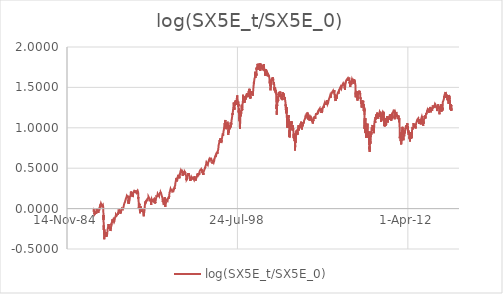
| Category | log(SX5E_t/SX5E_0) |
|---|---|
| 31777.0 | 0 |
| 31778.0 | 0 |
| 31779.0 | -0.01 |
| 31782.0 | -0.003 |
| 31783.0 | 0.002 |
| 31784.0 | -0.002 |
| 31785.0 | -0.015 |
| 31786.0 | -0.037 |
| 31789.0 | -0.024 |
| 31790.0 | -0.032 |
| 31791.0 | -0.027 |
| 31792.0 | -0.018 |
| 31793.0 | -0.019 |
| 31796.0 | -0.028 |
| 31797.0 | -0.029 |
| 31798.0 | -0.032 |
| 31799.0 | -0.027 |
| 31800.0 | -0.019 |
| 31803.0 | -0.034 |
| 31804.0 | -0.037 |
| 31805.0 | -0.072 |
| 31806.0 | -0.061 |
| 31807.0 | -0.047 |
| 31810.0 | -0.059 |
| 31811.0 | -0.07 |
| 31812.0 | -0.072 |
| 31813.0 | -0.078 |
| 31814.0 | -0.067 |
| 31817.0 | -0.064 |
| 31818.0 | -0.072 |
| 31819.0 | -0.073 |
| 31820.0 | -0.069 |
| 31821.0 | -0.068 |
| 31824.0 | -0.065 |
| 31825.0 | -0.077 |
| 31826.0 | -0.077 |
| 31827.0 | -0.065 |
| 31828.0 | -0.064 |
| 31831.0 | -0.071 |
| 31832.0 | -0.072 |
| 31833.0 | -0.078 |
| 31834.0 | -0.072 |
| 31835.0 | -0.069 |
| 31838.0 | -0.067 |
| 31839.0 | -0.074 |
| 31840.0 | -0.06 |
| 31841.0 | -0.052 |
| 31842.0 | -0.052 |
| 31845.0 | -0.05 |
| 31846.0 | -0.057 |
| 31847.0 | -0.064 |
| 31848.0 | -0.056 |
| 31849.0 | -0.052 |
| 31852.0 | -0.052 |
| 31853.0 | -0.06 |
| 31854.0 | -0.053 |
| 31855.0 | -0.067 |
| 31856.0 | -0.06 |
| 31859.0 | -0.046 |
| 31860.0 | -0.039 |
| 31861.0 | -0.037 |
| 31862.0 | -0.029 |
| 31863.0 | -0.02 |
| 31866.0 | -0.026 |
| 31867.0 | -0.035 |
| 31868.0 | -0.019 |
| 31869.0 | -0.014 |
| 31870.0 | -0.013 |
| 31873.0 | 0 |
| 31874.0 | -0.005 |
| 31875.0 | -0.006 |
| 31876.0 | -0.006 |
| 31877.0 | -0.018 |
| 31880.0 | -0.029 |
| 31881.0 | -0.022 |
| 31882.0 | -0.014 |
| 31883.0 | -0.006 |
| 31884.0 | -0.005 |
| 31887.0 | -0.008 |
| 31888.0 | -0.013 |
| 31889.0 | 0 |
| 31890.0 | -0.005 |
| 31891.0 | -0.011 |
| 31894.0 | -0.033 |
| 31895.0 | -0.024 |
| 31896.0 | -0.018 |
| 31897.0 | -0.022 |
| 31898.0 | -0.02 |
| 31901.0 | -0.023 |
| 31902.0 | -0.029 |
| 31903.0 | -0.022 |
| 31904.0 | -0.02 |
| 31905.0 | -0.02 |
| 31908.0 | -0.015 |
| 31909.0 | -0.024 |
| 31910.0 | -0.02 |
| 31911.0 | -0.02 |
| 31912.0 | -0.039 |
| 31915.0 | -0.036 |
| 31916.0 | -0.04 |
| 31917.0 | -0.051 |
| 31918.0 | -0.053 |
| 31919.0 | -0.049 |
| 31922.0 | -0.05 |
| 31923.0 | -0.041 |
| 31924.0 | -0.035 |
| 31925.0 | -0.036 |
| 31926.0 | -0.039 |
| 31929.0 | -0.032 |
| 31930.0 | -0.043 |
| 31931.0 | -0.041 |
| 31932.0 | -0.035 |
| 31933.0 | -0.041 |
| 31936.0 | -0.039 |
| 31937.0 | -0.043 |
| 31938.0 | -0.045 |
| 31939.0 | -0.037 |
| 31940.0 | -0.036 |
| 31943.0 | -0.024 |
| 31944.0 | -0.017 |
| 31945.0 | -0.017 |
| 31946.0 | -0.018 |
| 31947.0 | -0.004 |
| 31950.0 | 0.009 |
| 31951.0 | 0.016 |
| 31952.0 | 0.001 |
| 31953.0 | 0.003 |
| 31954.0 | 0.01 |
| 31957.0 | 0.01 |
| 31958.0 | 0.005 |
| 31959.0 | -0.007 |
| 31960.0 | 0.004 |
| 31961.0 | 0.019 |
| 31964.0 | 0.019 |
| 31965.0 | 0.018 |
| 31966.0 | 0.025 |
| 31967.0 | 0.022 |
| 31968.0 | 0.023 |
| 31971.0 | 0.023 |
| 31972.0 | 0.027 |
| 31973.0 | 0.031 |
| 31974.0 | 0.034 |
| 31975.0 | 0.044 |
| 31978.0 | 0.048 |
| 31979.0 | 0.044 |
| 31980.0 | 0.04 |
| 31981.0 | 0.034 |
| 31982.0 | 0.035 |
| 31985.0 | 0.039 |
| 31986.0 | 0.045 |
| 31987.0 | 0.053 |
| 31988.0 | 0.061 |
| 31989.0 | 0.059 |
| 31992.0 | 0.063 |
| 31993.0 | 0.061 |
| 31994.0 | 0.059 |
| 31995.0 | 0.065 |
| 31996.0 | 0.067 |
| 31999.0 | 0.066 |
| 32000.0 | 0.056 |
| 32001.0 | 0.066 |
| 32002.0 | 0.063 |
| 32003.0 | 0.065 |
| 32006.0 | 0.063 |
| 32007.0 | 0.052 |
| 32008.0 | 0.043 |
| 32009.0 | 0.052 |
| 32010.0 | 0.053 |
| 32013.0 | 0.045 |
| 32014.0 | 0.045 |
| 32015.0 | 0.045 |
| 32016.0 | 0.046 |
| 32017.0 | 0.051 |
| 32020.0 | 0.054 |
| 32021.0 | 0.057 |
| 32022.0 | 0.05 |
| 32023.0 | 0.042 |
| 32024.0 | 0.032 |
| 32027.0 | 0.021 |
| 32028.0 | 0.02 |
| 32029.0 | 0.021 |
| 32030.0 | 0.03 |
| 32031.0 | 0.036 |
| 32034.0 | 0.043 |
| 32035.0 | 0.039 |
| 32036.0 | 0.033 |
| 32037.0 | 0.036 |
| 32038.0 | 0.03 |
| 32041.0 | 0.029 |
| 32042.0 | 0.024 |
| 32043.0 | 0.04 |
| 32044.0 | 0.033 |
| 32045.0 | 0.03 |
| 32048.0 | 0.036 |
| 32049.0 | 0.039 |
| 32050.0 | 0.033 |
| 32051.0 | 0.041 |
| 32052.0 | 0.047 |
| 32055.0 | 0.053 |
| 32056.0 | 0.048 |
| 32057.0 | 0.038 |
| 32058.0 | 0.043 |
| 32059.0 | 0.028 |
| 32062.0 | 0.021 |
| 32063.0 | 0.023 |
| 32064.0 | 0.018 |
| 32065.0 | 0.001 |
| 32066.0 | -0.007 |
| 32069.0 | -0.09 |
| 32070.0 | -0.14 |
| 32071.0 | -0.08 |
| 32072.0 | -0.119 |
| 32073.0 | -0.133 |
| 32076.0 | -0.204 |
| 32077.0 | -0.195 |
| 32078.0 | -0.25 |
| 32079.0 | -0.265 |
| 32080.0 | -0.209 |
| 32083.0 | -0.217 |
| 32084.0 | -0.234 |
| 32085.0 | -0.267 |
| 32086.0 | -0.278 |
| 32087.0 | -0.277 |
| 32090.0 | -0.32 |
| 32091.0 | -0.38 |
| 32092.0 | -0.354 |
| 32093.0 | -0.287 |
| 32094.0 | -0.289 |
| 32097.0 | -0.259 |
| 32098.0 | -0.284 |
| 32099.0 | -0.287 |
| 32100.0 | -0.297 |
| 32101.0 | -0.321 |
| 32104.0 | -0.314 |
| 32105.0 | -0.287 |
| 32106.0 | -0.288 |
| 32107.0 | -0.294 |
| 32108.0 | -0.288 |
| 32111.0 | -0.314 |
| 32112.0 | -0.319 |
| 32113.0 | -0.319 |
| 32114.0 | -0.325 |
| 32115.0 | -0.348 |
| 32118.0 | -0.351 |
| 32119.0 | -0.345 |
| 32120.0 | -0.341 |
| 32121.0 | -0.34 |
| 32122.0 | -0.348 |
| 32125.0 | -0.342 |
| 32126.0 | -0.328 |
| 32127.0 | -0.309 |
| 32128.0 | -0.306 |
| 32129.0 | -0.313 |
| 32132.0 | -0.303 |
| 32133.0 | -0.3 |
| 32134.0 | -0.292 |
| 32135.0 | -0.294 |
| 32136.0 | -0.294 |
| 32139.0 | -0.306 |
| 32140.0 | -0.323 |
| 32141.0 | -0.317 |
| 32142.0 | -0.329 |
| 32143.0 | -0.329 |
| 32146.0 | -0.352 |
| 32147.0 | -0.313 |
| 32148.0 | -0.303 |
| 32149.0 | -0.297 |
| 32150.0 | -0.289 |
| 32153.0 | -0.326 |
| 32154.0 | -0.328 |
| 32155.0 | -0.343 |
| 32156.0 | -0.338 |
| 32157.0 | -0.333 |
| 32160.0 | -0.308 |
| 32161.0 | -0.328 |
| 32162.0 | -0.344 |
| 32163.0 | -0.352 |
| 32164.0 | -0.348 |
| 32167.0 | -0.348 |
| 32168.0 | -0.342 |
| 32169.0 | -0.346 |
| 32170.0 | -0.352 |
| 32171.0 | -0.348 |
| 32174.0 | -0.343 |
| 32175.0 | -0.343 |
| 32176.0 | -0.334 |
| 32177.0 | -0.321 |
| 32178.0 | -0.318 |
| 32181.0 | -0.31 |
| 32182.0 | -0.323 |
| 32183.0 | -0.314 |
| 32184.0 | -0.292 |
| 32185.0 | -0.283 |
| 32188.0 | -0.271 |
| 32189.0 | -0.269 |
| 32190.0 | -0.257 |
| 32191.0 | -0.257 |
| 32192.0 | -0.258 |
| 32195.0 | -0.249 |
| 32196.0 | -0.246 |
| 32197.0 | -0.242 |
| 32198.0 | -0.235 |
| 32199.0 | -0.245 |
| 32202.0 | -0.24 |
| 32203.0 | -0.23 |
| 32204.0 | -0.227 |
| 32205.0 | -0.229 |
| 32206.0 | -0.237 |
| 32209.0 | -0.251 |
| 32210.0 | -0.238 |
| 32211.0 | -0.233 |
| 32212.0 | -0.225 |
| 32213.0 | -0.233 |
| 32216.0 | -0.232 |
| 32217.0 | -0.231 |
| 32218.0 | -0.222 |
| 32219.0 | -0.242 |
| 32220.0 | -0.192 |
| 32223.0 | -0.196 |
| 32224.0 | -0.21 |
| 32225.0 | -0.208 |
| 32226.0 | -0.212 |
| 32227.0 | -0.224 |
| 32230.0 | -0.252 |
| 32231.0 | -0.243 |
| 32232.0 | -0.243 |
| 32233.0 | -0.25 |
| 32234.0 | -0.25 |
| 32237.0 | -0.253 |
| 32238.0 | -0.257 |
| 32239.0 | -0.242 |
| 32240.0 | -0.234 |
| 32241.0 | -0.235 |
| 32244.0 | -0.22 |
| 32245.0 | -0.213 |
| 32246.0 | -0.209 |
| 32247.0 | -0.216 |
| 32248.0 | -0.235 |
| 32251.0 | -0.236 |
| 32252.0 | -0.229 |
| 32253.0 | -0.235 |
| 32254.0 | -0.241 |
| 32255.0 | -0.236 |
| 32258.0 | -0.232 |
| 32259.0 | -0.229 |
| 32260.0 | -0.231 |
| 32261.0 | -0.228 |
| 32262.0 | -0.237 |
| 32265.0 | -0.238 |
| 32266.0 | -0.244 |
| 32267.0 | -0.237 |
| 32268.0 | -0.24 |
| 32269.0 | -0.242 |
| 32272.0 | -0.26 |
| 32273.0 | -0.264 |
| 32274.0 | -0.277 |
| 32275.0 | -0.281 |
| 32276.0 | -0.283 |
| 32279.0 | -0.262 |
| 32280.0 | -0.253 |
| 32281.0 | -0.256 |
| 32282.0 | -0.272 |
| 32283.0 | -0.265 |
| 32286.0 | -0.269 |
| 32287.0 | -0.267 |
| 32288.0 | -0.254 |
| 32289.0 | -0.256 |
| 32290.0 | -0.258 |
| 32293.0 | -0.249 |
| 32294.0 | -0.236 |
| 32295.0 | -0.218 |
| 32296.0 | -0.193 |
| 32297.0 | -0.207 |
| 32300.0 | -0.201 |
| 32301.0 | -0.206 |
| 32302.0 | -0.201 |
| 32303.0 | -0.184 |
| 32304.0 | -0.184 |
| 32307.0 | -0.188 |
| 32308.0 | -0.183 |
| 32309.0 | -0.18 |
| 32310.0 | -0.19 |
| 32311.0 | -0.187 |
| 32314.0 | -0.189 |
| 32315.0 | -0.186 |
| 32316.0 | -0.178 |
| 32317.0 | -0.171 |
| 32318.0 | -0.165 |
| 32321.0 | -0.166 |
| 32322.0 | -0.174 |
| 32323.0 | -0.169 |
| 32324.0 | -0.169 |
| 32325.0 | -0.157 |
| 32328.0 | -0.155 |
| 32329.0 | -0.15 |
| 32330.0 | -0.134 |
| 32331.0 | -0.14 |
| 32332.0 | -0.14 |
| 32335.0 | -0.143 |
| 32336.0 | -0.154 |
| 32337.0 | -0.161 |
| 32338.0 | -0.156 |
| 32339.0 | -0.151 |
| 32342.0 | -0.154 |
| 32343.0 | -0.16 |
| 32344.0 | -0.155 |
| 32345.0 | -0.154 |
| 32346.0 | -0.162 |
| 32349.0 | -0.163 |
| 32350.0 | -0.154 |
| 32351.0 | -0.15 |
| 32352.0 | -0.155 |
| 32353.0 | -0.144 |
| 32356.0 | -0.136 |
| 32357.0 | -0.135 |
| 32358.0 | -0.137 |
| 32359.0 | -0.138 |
| 32360.0 | -0.13 |
| 32363.0 | -0.136 |
| 32364.0 | -0.133 |
| 32365.0 | -0.151 |
| 32366.0 | -0.162 |
| 32367.0 | -0.153 |
| 32370.0 | -0.157 |
| 32371.0 | -0.161 |
| 32372.0 | -0.15 |
| 32373.0 | -0.147 |
| 32374.0 | -0.151 |
| 32377.0 | -0.152 |
| 32378.0 | -0.161 |
| 32379.0 | -0.157 |
| 32380.0 | -0.167 |
| 32381.0 | -0.169 |
| 32384.0 | -0.173 |
| 32385.0 | -0.17 |
| 32386.0 | -0.168 |
| 32387.0 | -0.173 |
| 32388.0 | -0.176 |
| 32391.0 | -0.166 |
| 32392.0 | -0.164 |
| 32393.0 | -0.16 |
| 32394.0 | -0.152 |
| 32395.0 | -0.159 |
| 32398.0 | -0.149 |
| 32399.0 | -0.144 |
| 32400.0 | -0.132 |
| 32401.0 | -0.126 |
| 32402.0 | -0.126 |
| 32405.0 | -0.121 |
| 32406.0 | -0.121 |
| 32407.0 | -0.114 |
| 32408.0 | -0.112 |
| 32409.0 | -0.116 |
| 32412.0 | -0.111 |
| 32413.0 | -0.115 |
| 32414.0 | -0.117 |
| 32415.0 | -0.109 |
| 32416.0 | -0.107 |
| 32419.0 | -0.107 |
| 32420.0 | -0.104 |
| 32421.0 | -0.101 |
| 32422.0 | -0.098 |
| 32423.0 | -0.096 |
| 32426.0 | -0.089 |
| 32427.0 | -0.097 |
| 32428.0 | -0.103 |
| 32429.0 | -0.094 |
| 32430.0 | -0.09 |
| 32433.0 | -0.087 |
| 32434.0 | -0.078 |
| 32435.0 | -0.073 |
| 32436.0 | -0.079 |
| 32437.0 | -0.079 |
| 32440.0 | -0.08 |
| 32441.0 | -0.079 |
| 32442.0 | -0.062 |
| 32443.0 | -0.074 |
| 32444.0 | -0.068 |
| 32447.0 | -0.072 |
| 32448.0 | -0.067 |
| 32449.0 | -0.072 |
| 32450.0 | -0.073 |
| 32451.0 | -0.072 |
| 32454.0 | -0.081 |
| 32455.0 | -0.074 |
| 32456.0 | -0.078 |
| 32457.0 | -0.081 |
| 32458.0 | -0.086 |
| 32461.0 | -0.092 |
| 32462.0 | -0.094 |
| 32463.0 | -0.091 |
| 32464.0 | -0.095 |
| 32465.0 | -0.088 |
| 32468.0 | -0.091 |
| 32469.0 | -0.091 |
| 32470.0 | -0.084 |
| 32471.0 | -0.082 |
| 32472.0 | -0.085 |
| 32475.0 | -0.091 |
| 32476.0 | -0.09 |
| 32477.0 | -0.084 |
| 32478.0 | -0.084 |
| 32479.0 | -0.087 |
| 32482.0 | -0.09 |
| 32483.0 | -0.085 |
| 32484.0 | -0.077 |
| 32485.0 | -0.078 |
| 32486.0 | -0.066 |
| 32489.0 | -0.075 |
| 32490.0 | -0.075 |
| 32491.0 | -0.078 |
| 32492.0 | -0.079 |
| 32493.0 | -0.071 |
| 32496.0 | -0.062 |
| 32497.0 | -0.053 |
| 32498.0 | -0.054 |
| 32499.0 | -0.066 |
| 32500.0 | -0.05 |
| 32503.0 | -0.051 |
| 32504.0 | -0.045 |
| 32505.0 | -0.047 |
| 32506.0 | -0.045 |
| 32507.0 | -0.045 |
| 32510.0 | -0.039 |
| 32511.0 | -0.032 |
| 32512.0 | -0.028 |
| 32513.0 | -0.02 |
| 32514.0 | -0.019 |
| 32517.0 | -0.017 |
| 32518.0 | -0.022 |
| 32519.0 | -0.022 |
| 32520.0 | -0.018 |
| 32521.0 | -0.017 |
| 32524.0 | -0.017 |
| 32525.0 | -0.021 |
| 32526.0 | -0.023 |
| 32527.0 | -0.014 |
| 32528.0 | -0.017 |
| 32531.0 | -0.023 |
| 32532.0 | -0.017 |
| 32533.0 | -0.009 |
| 32534.0 | -0.015 |
| 32535.0 | -0.011 |
| 32538.0 | -0.015 |
| 32539.0 | -0.022 |
| 32540.0 | -0.029 |
| 32541.0 | -0.026 |
| 32542.0 | -0.019 |
| 32545.0 | -0.017 |
| 32546.0 | -0.019 |
| 32547.0 | -0.01 |
| 32548.0 | -0.013 |
| 32549.0 | -0.014 |
| 32552.0 | -0.027 |
| 32553.0 | -0.025 |
| 32554.0 | -0.034 |
| 32555.0 | -0.031 |
| 32556.0 | -0.035 |
| 32559.0 | -0.027 |
| 32560.0 | -0.029 |
| 32561.0 | -0.038 |
| 32562.0 | -0.05 |
| 32563.0 | -0.042 |
| 32566.0 | -0.064 |
| 32567.0 | -0.055 |
| 32568.0 | -0.047 |
| 32569.0 | -0.046 |
| 32570.0 | -0.034 |
| 32573.0 | -0.024 |
| 32574.0 | -0.025 |
| 32575.0 | -0.032 |
| 32576.0 | -0.031 |
| 32577.0 | -0.034 |
| 32580.0 | -0.032 |
| 32581.0 | -0.028 |
| 32582.0 | -0.021 |
| 32583.0 | -0.02 |
| 32584.0 | -0.024 |
| 32587.0 | -0.054 |
| 32588.0 | -0.029 |
| 32589.0 | -0.029 |
| 32590.0 | -0.029 |
| 32591.0 | -0.028 |
| 32594.0 | -0.031 |
| 32595.0 | -0.028 |
| 32596.0 | -0.023 |
| 32597.0 | -0.021 |
| 32598.0 | -0.019 |
| 32601.0 | -0.011 |
| 32602.0 | -0.01 |
| 32603.0 | -0.008 |
| 32604.0 | -0.012 |
| 32605.0 | -0.011 |
| 32608.0 | -0.006 |
| 32609.0 | -0.001 |
| 32610.0 | 0.002 |
| 32611.0 | 0.002 |
| 32612.0 | 0.005 |
| 32615.0 | 0.009 |
| 32616.0 | 0.012 |
| 32617.0 | 0.012 |
| 32618.0 | 0.009 |
| 32619.0 | 0.009 |
| 32622.0 | 0.009 |
| 32623.0 | 0.004 |
| 32624.0 | 0 |
| 32625.0 | 0.001 |
| 32626.0 | 0.001 |
| 32629.0 | 0 |
| 32630.0 | -0.002 |
| 32631.0 | -0.003 |
| 32632.0 | -0.004 |
| 32633.0 | 0.004 |
| 32636.0 | -0.001 |
| 32637.0 | -0.002 |
| 32638.0 | -0.005 |
| 32639.0 | -0.008 |
| 32640.0 | -0.009 |
| 32643.0 | -0.01 |
| 32644.0 | -0.01 |
| 32645.0 | -0.012 |
| 32646.0 | -0.005 |
| 32647.0 | -0.003 |
| 32650.0 | 0.001 |
| 32651.0 | 0.004 |
| 32652.0 | 0.005 |
| 32653.0 | 0.014 |
| 32654.0 | 0.015 |
| 32657.0 | 0.021 |
| 32658.0 | 0.025 |
| 32659.0 | 0.025 |
| 32660.0 | 0.026 |
| 32661.0 | 0.028 |
| 32664.0 | 0.032 |
| 32665.0 | 0.031 |
| 32666.0 | 0.036 |
| 32667.0 | 0.042 |
| 32668.0 | 0.043 |
| 32671.0 | 0.048 |
| 32672.0 | 0.048 |
| 32673.0 | 0.05 |
| 32674.0 | 0.045 |
| 32675.0 | 0.046 |
| 32678.0 | 0.052 |
| 32679.0 | 0.062 |
| 32680.0 | 0.06 |
| 32681.0 | 0.062 |
| 32682.0 | 0.062 |
| 32685.0 | 0.066 |
| 32686.0 | 0.064 |
| 32687.0 | 0.07 |
| 32688.0 | 0.067 |
| 32689.0 | 0.057 |
| 32692.0 | 0.062 |
| 32693.0 | 0.067 |
| 32694.0 | 0.059 |
| 32695.0 | 0.06 |
| 32696.0 | 0.065 |
| 32699.0 | 0.07 |
| 32700.0 | 0.076 |
| 32701.0 | 0.075 |
| 32702.0 | 0.082 |
| 32703.0 | 0.085 |
| 32706.0 | 0.084 |
| 32707.0 | 0.086 |
| 32708.0 | 0.09 |
| 32709.0 | 0.096 |
| 32710.0 | 0.098 |
| 32713.0 | 0.088 |
| 32714.0 | 0.093 |
| 32715.0 | 0.099 |
| 32716.0 | 0.102 |
| 32717.0 | 0.101 |
| 32720.0 | 0.102 |
| 32721.0 | 0.111 |
| 32722.0 | 0.113 |
| 32723.0 | 0.109 |
| 32724.0 | 0.121 |
| 32727.0 | 0.123 |
| 32728.0 | 0.125 |
| 32729.0 | 0.127 |
| 32730.0 | 0.123 |
| 32731.0 | 0.127 |
| 32734.0 | 0.124 |
| 32735.0 | 0.116 |
| 32736.0 | 0.123 |
| 32737.0 | 0.125 |
| 32738.0 | 0.122 |
| 32741.0 | 0.129 |
| 32742.0 | 0.126 |
| 32743.0 | 0.125 |
| 32744.0 | 0.13 |
| 32745.0 | 0.141 |
| 32748.0 | 0.139 |
| 32749.0 | 0.135 |
| 32750.0 | 0.138 |
| 32751.0 | 0.142 |
| 32752.0 | 0.145 |
| 32755.0 | 0.152 |
| 32756.0 | 0.159 |
| 32757.0 | 0.152 |
| 32758.0 | 0.158 |
| 32759.0 | 0.162 |
| 32762.0 | 0.158 |
| 32763.0 | 0.155 |
| 32764.0 | 0.153 |
| 32765.0 | 0.152 |
| 32766.0 | 0.151 |
| 32769.0 | 0.154 |
| 32770.0 | 0.151 |
| 32771.0 | 0.149 |
| 32772.0 | 0.149 |
| 32773.0 | 0.155 |
| 32776.0 | 0.154 |
| 32777.0 | 0.149 |
| 32778.0 | 0.146 |
| 32779.0 | 0.145 |
| 32780.0 | 0.137 |
| 32783.0 | 0.132 |
| 32784.0 | 0.143 |
| 32785.0 | 0.146 |
| 32786.0 | 0.145 |
| 32787.0 | 0.151 |
| 32790.0 | 0.158 |
| 32791.0 | 0.158 |
| 32792.0 | 0.147 |
| 32793.0 | 0.146 |
| 32794.0 | 0.14 |
| 32797.0 | 0.064 |
| 32798.0 | 0.085 |
| 32799.0 | 0.088 |
| 32800.0 | 0.106 |
| 32801.0 | 0.104 |
| 32804.0 | 0.106 |
| 32805.0 | 0.088 |
| 32806.0 | 0.078 |
| 32807.0 | 0.076 |
| 32808.0 | 0.063 |
| 32811.0 | 0.07 |
| 32812.0 | 0.074 |
| 32813.0 | 0.076 |
| 32814.0 | 0.074 |
| 32815.0 | 0.065 |
| 32818.0 | 0.062 |
| 32819.0 | 0.05 |
| 32820.0 | 0.058 |
| 32821.0 | 0.064 |
| 32822.0 | 0.075 |
| 32825.0 | 0.087 |
| 32826.0 | 0.082 |
| 32827.0 | 0.078 |
| 32828.0 | 0.09 |
| 32829.0 | 0.09 |
| 32832.0 | 0.094 |
| 32833.0 | 0.089 |
| 32834.0 | 0.095 |
| 32835.0 | 0.101 |
| 32836.0 | 0.11 |
| 32839.0 | 0.114 |
| 32840.0 | 0.114 |
| 32841.0 | 0.118 |
| 32842.0 | 0.128 |
| 32843.0 | 0.138 |
| 32846.0 | 0.148 |
| 32847.0 | 0.144 |
| 32848.0 | 0.152 |
| 32849.0 | 0.154 |
| 32850.0 | 0.154 |
| 32853.0 | 0.152 |
| 32854.0 | 0.151 |
| 32855.0 | 0.15 |
| 32856.0 | 0.147 |
| 32857.0 | 0.149 |
| 32860.0 | 0.146 |
| 32861.0 | 0.142 |
| 32862.0 | 0.153 |
| 32863.0 | 0.161 |
| 32864.0 | 0.163 |
| 32867.0 | 0.163 |
| 32868.0 | 0.166 |
| 32869.0 | 0.184 |
| 32870.0 | 0.195 |
| 32871.0 | 0.198 |
| 32874.0 | 0.198 |
| 32875.0 | 0.201 |
| 32876.0 | 0.211 |
| 32877.0 | 0.212 |
| 32878.0 | 0.199 |
| 32881.0 | 0.204 |
| 32882.0 | 0.208 |
| 32883.0 | 0.2 |
| 32884.0 | 0.21 |
| 32885.0 | 0.2 |
| 32888.0 | 0.194 |
| 32889.0 | 0.178 |
| 32890.0 | 0.187 |
| 32891.0 | 0.173 |
| 32892.0 | 0.171 |
| 32895.0 | 0.172 |
| 32896.0 | 0.174 |
| 32897.0 | 0.152 |
| 32898.0 | 0.164 |
| 32899.0 | 0.164 |
| 32902.0 | 0.166 |
| 32903.0 | 0.17 |
| 32904.0 | 0.172 |
| 32905.0 | 0.183 |
| 32906.0 | 0.199 |
| 32909.0 | 0.21 |
| 32910.0 | 0.208 |
| 32911.0 | 0.194 |
| 32912.0 | 0.202 |
| 32913.0 | 0.192 |
| 32916.0 | 0.177 |
| 32917.0 | 0.169 |
| 32918.0 | 0.17 |
| 32919.0 | 0.174 |
| 32920.0 | 0.189 |
| 32923.0 | 0.176 |
| 32924.0 | 0.157 |
| 32925.0 | 0.15 |
| 32926.0 | 0.156 |
| 32927.0 | 0.142 |
| 32930.0 | 0.135 |
| 32931.0 | 0.149 |
| 32932.0 | 0.152 |
| 32933.0 | 0.143 |
| 32934.0 | 0.16 |
| 32937.0 | 0.167 |
| 32938.0 | 0.165 |
| 32939.0 | 0.176 |
| 32940.0 | 0.184 |
| 32941.0 | 0.188 |
| 32944.0 | 0.184 |
| 32945.0 | 0.189 |
| 32946.0 | 0.192 |
| 32947.0 | 0.201 |
| 32948.0 | 0.205 |
| 32951.0 | 0.208 |
| 32952.0 | 0.203 |
| 32953.0 | 0.213 |
| 32954.0 | 0.204 |
| 32955.0 | 0.207 |
| 32958.0 | 0.213 |
| 32959.0 | 0.208 |
| 32960.0 | 0.207 |
| 32961.0 | 0.212 |
| 32962.0 | 0.214 |
| 32965.0 | 0.202 |
| 32966.0 | 0.215 |
| 32967.0 | 0.216 |
| 32968.0 | 0.218 |
| 32969.0 | 0.224 |
| 32972.0 | 0.218 |
| 32973.0 | 0.217 |
| 32974.0 | 0.22 |
| 32975.0 | 0.225 |
| 32976.0 | 0.224 |
| 32979.0 | 0.227 |
| 32980.0 | 0.23 |
| 32981.0 | 0.222 |
| 32982.0 | 0.218 |
| 32983.0 | 0.224 |
| 32986.0 | 0.208 |
| 32987.0 | 0.205 |
| 32988.0 | 0.204 |
| 32989.0 | 0.196 |
| 32990.0 | 0.192 |
| 32993.0 | 0.189 |
| 32994.0 | 0.189 |
| 32995.0 | 0.198 |
| 32996.0 | 0.21 |
| 32997.0 | 0.216 |
| 33000.0 | 0.225 |
| 33001.0 | 0.221 |
| 33002.0 | 0.217 |
| 33003.0 | 0.214 |
| 33004.0 | 0.209 |
| 33007.0 | 0.211 |
| 33008.0 | 0.208 |
| 33009.0 | 0.207 |
| 33010.0 | 0.212 |
| 33011.0 | 0.208 |
| 33014.0 | 0.198 |
| 33015.0 | 0.206 |
| 33016.0 | 0.21 |
| 33017.0 | 0.209 |
| 33018.0 | 0.202 |
| 33021.0 | 0.199 |
| 33022.0 | 0.21 |
| 33023.0 | 0.215 |
| 33024.0 | 0.215 |
| 33025.0 | 0.214 |
| 33028.0 | 0.218 |
| 33029.0 | 0.221 |
| 33030.0 | 0.208 |
| 33031.0 | 0.206 |
| 33032.0 | 0.199 |
| 33035.0 | 0.194 |
| 33036.0 | 0.193 |
| 33037.0 | 0.195 |
| 33038.0 | 0.198 |
| 33039.0 | 0.19 |
| 33042.0 | 0.185 |
| 33043.0 | 0.198 |
| 33044.0 | 0.202 |
| 33045.0 | 0.205 |
| 33046.0 | 0.211 |
| 33049.0 | 0.217 |
| 33050.0 | 0.221 |
| 33051.0 | 0.22 |
| 33052.0 | 0.22 |
| 33053.0 | 0.218 |
| 33056.0 | 0.221 |
| 33057.0 | 0.219 |
| 33058.0 | 0.218 |
| 33059.0 | 0.212 |
| 33060.0 | 0.213 |
| 33063.0 | 0.209 |
| 33064.0 | 0.2 |
| 33065.0 | 0.208 |
| 33066.0 | 0.217 |
| 33067.0 | 0.219 |
| 33070.0 | 0.225 |
| 33071.0 | 0.23 |
| 33072.0 | 0.23 |
| 33073.0 | 0.231 |
| 33074.0 | 0.232 |
| 33077.0 | 0.218 |
| 33078.0 | 0.219 |
| 33079.0 | 0.22 |
| 33080.0 | 0.218 |
| 33081.0 | 0.211 |
| 33084.0 | 0.207 |
| 33085.0 | 0.215 |
| 33086.0 | 0.208 |
| 33087.0 | 0.197 |
| 33088.0 | 0.175 |
| 33091.0 | 0.126 |
| 33092.0 | 0.143 |
| 33093.0 | 0.121 |
| 33094.0 | 0.128 |
| 33095.0 | 0.125 |
| 33098.0 | 0.101 |
| 33099.0 | 0.108 |
| 33100.0 | 0.106 |
| 33101.0 | 0.112 |
| 33102.0 | 0.081 |
| 33105.0 | 0.056 |
| 33106.0 | 0.022 |
| 33107.0 | 0.032 |
| 33108.0 | 0.003 |
| 33109.0 | 0.021 |
| 33112.0 | 0.068 |
| 33113.0 | 0.059 |
| 33114.0 | 0.066 |
| 33115.0 | 0.074 |
| 33116.0 | 0.066 |
| 33119.0 | 0.062 |
| 33120.0 | 0.043 |
| 33121.0 | 0.043 |
| 33122.0 | 0.038 |
| 33123.0 | 0.04 |
| 33126.0 | 0.06 |
| 33127.0 | 0.051 |
| 33128.0 | 0.058 |
| 33129.0 | 0.056 |
| 33130.0 | 0.036 |
| 33133.0 | 0.026 |
| 33134.0 | 0.007 |
| 33135.0 | 0.004 |
| 33136.0 | -0.011 |
| 33137.0 | -0.016 |
| 33140.0 | -0.033 |
| 33141.0 | -0.057 |
| 33142.0 | -0.045 |
| 33143.0 | -0.046 |
| 33144.0 | -0.063 |
| 33147.0 | -0.029 |
| 33148.0 | -0.005 |
| 33149.0 | -0.01 |
| 33150.0 | -0.022 |
| 33151.0 | -0.038 |
| 33154.0 | -0.008 |
| 33155.0 | -0.026 |
| 33156.0 | -0.039 |
| 33157.0 | -0.035 |
| 33158.0 | -0.018 |
| 33161.0 | -0.01 |
| 33162.0 | -0.012 |
| 33163.0 | -0.016 |
| 33164.0 | 0.001 |
| 33165.0 | 0.01 |
| 33168.0 | 0.004 |
| 33169.0 | 0.027 |
| 33170.0 | 0.026 |
| 33171.0 | 0.017 |
| 33172.0 | -0.002 |
| 33175.0 | -0.005 |
| 33176.0 | -0.016 |
| 33177.0 | -0.013 |
| 33178.0 | -0.018 |
| 33179.0 | -0.021 |
| 33182.0 | -0.026 |
| 33183.0 | -0.027 |
| 33184.0 | -0.041 |
| 33185.0 | -0.049 |
| 33186.0 | -0.045 |
| 33189.0 | -0.032 |
| 33190.0 | -0.028 |
| 33191.0 | -0.034 |
| 33192.0 | -0.034 |
| 33193.0 | -0.033 |
| 33196.0 | -0.02 |
| 33197.0 | -0.018 |
| 33198.0 | -0.02 |
| 33199.0 | -0.012 |
| 33200.0 | -0.014 |
| 33203.0 | -0.033 |
| 33204.0 | -0.043 |
| 33205.0 | -0.042 |
| 33206.0 | -0.036 |
| 33207.0 | -0.032 |
| 33210.0 | -0.011 |
| 33211.0 | -0.019 |
| 33212.0 | -0.009 |
| 33213.0 | 0.006 |
| 33214.0 | 0.012 |
| 33217.0 | 0.008 |
| 33218.0 | 0.004 |
| 33219.0 | 0.008 |
| 33220.0 | 0.012 |
| 33221.0 | 0.01 |
| 33224.0 | -0.009 |
| 33225.0 | -0.009 |
| 33226.0 | -0.014 |
| 33227.0 | -0.034 |
| 33228.0 | -0.031 |
| 33231.0 | -0.038 |
| 33232.0 | -0.033 |
| 33233.0 | -0.039 |
| 33234.0 | -0.039 |
| 33235.0 | -0.045 |
| 33238.0 | -0.048 |
| 33239.0 | -0.048 |
| 33240.0 | -0.056 |
| 33241.0 | -0.053 |
| 33242.0 | -0.041 |
| 33245.0 | -0.061 |
| 33246.0 | -0.067 |
| 33247.0 | -0.051 |
| 33248.0 | -0.062 |
| 33249.0 | -0.066 |
| 33252.0 | -0.096 |
| 33253.0 | -0.093 |
| 33254.0 | -0.092 |
| 33255.0 | -0.035 |
| 33256.0 | -0.043 |
| 33259.0 | -0.053 |
| 33260.0 | -0.06 |
| 33261.0 | -0.07 |
| 33262.0 | -0.056 |
| 33263.0 | -0.049 |
| 33266.0 | -0.048 |
| 33267.0 | -0.054 |
| 33268.0 | -0.038 |
| 33269.0 | -0.033 |
| 33270.0 | -0.033 |
| 33273.0 | -0.026 |
| 33274.0 | -0.019 |
| 33275.0 | -0.022 |
| 33276.0 | -0.012 |
| 33277.0 | -0.001 |
| 33280.0 | 0.015 |
| 33281.0 | 0.009 |
| 33282.0 | 0.017 |
| 33283.0 | 0.024 |
| 33284.0 | 0.037 |
| 33287.0 | 0.054 |
| 33288.0 | 0.061 |
| 33289.0 | 0.049 |
| 33290.0 | 0.052 |
| 33291.0 | 0.063 |
| 33294.0 | 0.075 |
| 33295.0 | 0.056 |
| 33296.0 | 0.06 |
| 33297.0 | 0.063 |
| 33298.0 | 0.052 |
| 33301.0 | 0.06 |
| 33302.0 | 0.068 |
| 33303.0 | 0.086 |
| 33304.0 | 0.088 |
| 33305.0 | 0.095 |
| 33308.0 | 0.084 |
| 33309.0 | 0.084 |
| 33310.0 | 0.073 |
| 33311.0 | 0.09 |
| 33312.0 | 0.087 |
| 33315.0 | 0.083 |
| 33316.0 | 0.077 |
| 33317.0 | 0.069 |
| 33318.0 | 0.075 |
| 33319.0 | 0.071 |
| 33322.0 | 0.074 |
| 33323.0 | 0.071 |
| 33324.0 | 0.075 |
| 33325.0 | 0.086 |
| 33326.0 | 0.086 |
| 33329.0 | 0.093 |
| 33330.0 | 0.09 |
| 33331.0 | 0.103 |
| 33332.0 | 0.1 |
| 33333.0 | 0.107 |
| 33336.0 | 0.1 |
| 33337.0 | 0.104 |
| 33338.0 | 0.093 |
| 33339.0 | 0.1 |
| 33340.0 | 0.106 |
| 33343.0 | 0.111 |
| 33344.0 | 0.106 |
| 33345.0 | 0.117 |
| 33346.0 | 0.117 |
| 33347.0 | 0.112 |
| 33350.0 | 0.1 |
| 33351.0 | 0.109 |
| 33352.0 | 0.111 |
| 33353.0 | 0.118 |
| 33354.0 | 0.103 |
| 33357.0 | 0.111 |
| 33358.0 | 0.107 |
| 33359.0 | 0.109 |
| 33360.0 | 0.122 |
| 33361.0 | 0.123 |
| 33364.0 | 0.124 |
| 33365.0 | 0.124 |
| 33366.0 | 0.118 |
| 33367.0 | 0.119 |
| 33368.0 | 0.128 |
| 33371.0 | 0.12 |
| 33372.0 | 0.117 |
| 33373.0 | 0.109 |
| 33374.0 | 0.113 |
| 33375.0 | 0.109 |
| 33378.0 | 0.111 |
| 33379.0 | 0.12 |
| 33380.0 | 0.125 |
| 33381.0 | 0.125 |
| 33382.0 | 0.126 |
| 33385.0 | 0.128 |
| 33386.0 | 0.131 |
| 33387.0 | 0.135 |
| 33388.0 | 0.139 |
| 33389.0 | 0.149 |
| 33392.0 | 0.151 |
| 33393.0 | 0.148 |
| 33394.0 | 0.154 |
| 33395.0 | 0.149 |
| 33396.0 | 0.147 |
| 33399.0 | 0.146 |
| 33400.0 | 0.153 |
| 33401.0 | 0.145 |
| 33402.0 | 0.143 |
| 33403.0 | 0.151 |
| 33406.0 | 0.145 |
| 33407.0 | 0.142 |
| 33408.0 | 0.133 |
| 33409.0 | 0.129 |
| 33410.0 | 0.137 |
| 33413.0 | 0.125 |
| 33414.0 | 0.126 |
| 33415.0 | 0.119 |
| 33416.0 | 0.119 |
| 33417.0 | 0.108 |
| 33420.0 | 0.109 |
| 33421.0 | 0.105 |
| 33422.0 | 0.098 |
| 33423.0 | 0.096 |
| 33424.0 | 0.104 |
| 33427.0 | 0.091 |
| 33428.0 | 0.101 |
| 33429.0 | 0.111 |
| 33430.0 | 0.104 |
| 33431.0 | 0.103 |
| 33434.0 | 0.107 |
| 33435.0 | 0.107 |
| 33436.0 | 0.1 |
| 33437.0 | 0.101 |
| 33438.0 | 0.106 |
| 33441.0 | 0.108 |
| 33442.0 | 0.111 |
| 33443.0 | 0.109 |
| 33444.0 | 0.107 |
| 33445.0 | 0.101 |
| 33448.0 | 0.101 |
| 33449.0 | 0.105 |
| 33450.0 | 0.105 |
| 33451.0 | 0.108 |
| 33452.0 | 0.106 |
| 33455.0 | 0.107 |
| 33456.0 | 0.1 |
| 33457.0 | 0.111 |
| 33458.0 | 0.109 |
| 33459.0 | 0.108 |
| 33462.0 | 0.105 |
| 33463.0 | 0.113 |
| 33464.0 | 0.117 |
| 33465.0 | 0.117 |
| 33466.0 | 0.118 |
| 33469.0 | 0.045 |
| 33470.0 | 0.066 |
| 33471.0 | 0.087 |
| 33472.0 | 0.108 |
| 33473.0 | 0.111 |
| 33476.0 | 0.119 |
| 33477.0 | 0.118 |
| 33478.0 | 0.116 |
| 33479.0 | 0.119 |
| 33480.0 | 0.121 |
| 33483.0 | 0.121 |
| 33484.0 | 0.124 |
| 33485.0 | 0.123 |
| 33486.0 | 0.124 |
| 33487.0 | 0.122 |
| 33490.0 | 0.116 |
| 33491.0 | 0.111 |
| 33492.0 | 0.108 |
| 33493.0 | 0.111 |
| 33494.0 | 0.113 |
| 33497.0 | 0.114 |
| 33498.0 | 0.114 |
| 33499.0 | 0.117 |
| 33500.0 | 0.116 |
| 33501.0 | 0.117 |
| 33504.0 | 0.114 |
| 33505.0 | 0.119 |
| 33506.0 | 0.115 |
| 33507.0 | 0.114 |
| 33508.0 | 0.11 |
| 33511.0 | 0.111 |
| 33512.0 | 0.112 |
| 33513.0 | 0.11 |
| 33514.0 | 0.107 |
| 33515.0 | 0.102 |
| 33518.0 | 0.099 |
| 33519.0 | 0.099 |
| 33520.0 | 0.092 |
| 33521.0 | 0.095 |
| 33522.0 | 0.094 |
| 33525.0 | 0.095 |
| 33526.0 | 0.105 |
| 33527.0 | 0.104 |
| 33528.0 | 0.103 |
| 33529.0 | 0.104 |
| 33532.0 | 0.104 |
| 33533.0 | 0.108 |
| 33534.0 | 0.107 |
| 33535.0 | 0.102 |
| 33536.0 | 0.097 |
| 33539.0 | 0.106 |
| 33540.0 | 0.107 |
| 33541.0 | 0.105 |
| 33542.0 | 0.108 |
| 33543.0 | 0.103 |
| 33546.0 | 0.099 |
| 33547.0 | 0.103 |
| 33548.0 | 0.099 |
| 33549.0 | 0.103 |
| 33550.0 | 0.114 |
| 33553.0 | 0.114 |
| 33554.0 | 0.119 |
| 33555.0 | 0.121 |
| 33556.0 | 0.125 |
| 33557.0 | 0.126 |
| 33560.0 | 0.107 |
| 33561.0 | 0.097 |
| 33562.0 | 0.099 |
| 33563.0 | 0.097 |
| 33564.0 | 0.098 |
| 33567.0 | 0.093 |
| 33568.0 | 0.099 |
| 33569.0 | 0.095 |
| 33570.0 | 0.095 |
| 33571.0 | 0.09 |
| 33574.0 | 0.078 |
| 33575.0 | 0.085 |
| 33576.0 | 0.084 |
| 33577.0 | 0.084 |
| 33578.0 | 0.078 |
| 33581.0 | 0.073 |
| 33582.0 | 0.065 |
| 33583.0 | 0.067 |
| 33584.0 | 0.073 |
| 33585.0 | 0.082 |
| 33588.0 | 0.082 |
| 33589.0 | 0.085 |
| 33590.0 | 0.09 |
| 33591.0 | 0.08 |
| 33592.0 | 0.067 |
| 33595.0 | 0.069 |
| 33596.0 | 0.08 |
| 33597.0 | 0.08 |
| 33598.0 | 0.082 |
| 33599.0 | 0.09 |
| 33602.0 | 0.101 |
| 33603.0 | 0.104 |
| 33605.0 | 0.108 |
| 33606.0 | 0.106 |
| 33609.0 | 0.119 |
| 33610.0 | 0.117 |
| 33611.0 | 0.108 |
| 33612.0 | 0.109 |
| 33613.0 | 0.125 |
| 33616.0 | 0.127 |
| 33617.0 | 0.133 |
| 33618.0 | 0.154 |
| 33619.0 | 0.154 |
| 33620.0 | 0.149 |
| 33623.0 | 0.152 |
| 33624.0 | 0.157 |
| 33625.0 | 0.15 |
| 33626.0 | 0.144 |
| 33627.0 | 0.144 |
| 33630.0 | 0.159 |
| 33631.0 | 0.159 |
| 33632.0 | 0.155 |
| 33633.0 | 0.154 |
| 33634.0 | 0.149 |
| 33637.0 | 0.16 |
| 33638.0 | 0.148 |
| 33639.0 | 0.161 |
| 33640.0 | 0.157 |
| 33641.0 | 0.164 |
| 33644.0 | 0.146 |
| 33645.0 | 0.15 |
| 33646.0 | 0.15 |
| 33647.0 | 0.154 |
| 33648.0 | 0.152 |
| 33651.0 | 0.151 |
| 33652.0 | 0.165 |
| 33653.0 | 0.161 |
| 33654.0 | 0.17 |
| 33655.0 | 0.169 |
| 33658.0 | 0.176 |
| 33659.0 | 0.168 |
| 33660.0 | 0.184 |
| 33661.0 | 0.189 |
| 33662.0 | 0.184 |
| 33665.0 | 0.185 |
| 33666.0 | 0.187 |
| 33667.0 | 0.191 |
| 33668.0 | 0.186 |
| 33669.0 | 0.183 |
| 33672.0 | 0.184 |
| 33673.0 | 0.185 |
| 33674.0 | 0.18 |
| 33675.0 | 0.173 |
| 33676.0 | 0.17 |
| 33679.0 | 0.169 |
| 33680.0 | 0.17 |
| 33681.0 | 0.168 |
| 33682.0 | 0.166 |
| 33683.0 | 0.173 |
| 33686.0 | 0.16 |
| 33687.0 | 0.16 |
| 33688.0 | 0.161 |
| 33689.0 | 0.165 |
| 33690.0 | 0.161 |
| 33693.0 | 0.163 |
| 33694.0 | 0.163 |
| 33695.0 | 0.161 |
| 33696.0 | 0.163 |
| 33697.0 | 0.164 |
| 33700.0 | 0.171 |
| 33701.0 | 0.176 |
| 33702.0 | 0.154 |
| 33703.0 | 0.157 |
| 33704.0 | 0.171 |
| 33707.0 | 0.167 |
| 33708.0 | 0.166 |
| 33709.0 | 0.18 |
| 33710.0 | 0.172 |
| 33711.0 | 0.172 |
| 33714.0 | 0.182 |
| 33715.0 | 0.181 |
| 33716.0 | 0.181 |
| 33717.0 | 0.181 |
| 33718.0 | 0.18 |
| 33721.0 | 0.181 |
| 33722.0 | 0.183 |
| 33723.0 | 0.186 |
| 33724.0 | 0.186 |
| 33725.0 | 0.184 |
| 33728.0 | 0.182 |
| 33729.0 | 0.186 |
| 33730.0 | 0.188 |
| 33731.0 | 0.19 |
| 33732.0 | 0.193 |
| 33735.0 | 0.199 |
| 33736.0 | 0.192 |
| 33737.0 | 0.19 |
| 33738.0 | 0.182 |
| 33739.0 | 0.189 |
| 33742.0 | 0.19 |
| 33743.0 | 0.192 |
| 33744.0 | 0.192 |
| 33745.0 | 0.194 |
| 33746.0 | 0.203 |
| 33749.0 | 0.207 |
| 33750.0 | 0.201 |
| 33751.0 | 0.198 |
| 33752.0 | 0.199 |
| 33753.0 | 0.204 |
| 33756.0 | 0.203 |
| 33757.0 | 0.201 |
| 33758.0 | 0.2 |
| 33759.0 | 0.198 |
| 33760.0 | 0.194 |
| 33763.0 | 0.193 |
| 33764.0 | 0.186 |
| 33765.0 | 0.187 |
| 33766.0 | 0.179 |
| 33767.0 | 0.18 |
| 33770.0 | 0.175 |
| 33771.0 | 0.179 |
| 33772.0 | 0.174 |
| 33773.0 | 0.166 |
| 33774.0 | 0.167 |
| 33777.0 | 0.165 |
| 33778.0 | 0.166 |
| 33779.0 | 0.164 |
| 33780.0 | 0.163 |
| 33781.0 | 0.165 |
| 33784.0 | 0.159 |
| 33785.0 | 0.16 |
| 33786.0 | 0.152 |
| 33787.0 | 0.161 |
| 33788.0 | 0.161 |
| 33791.0 | 0.156 |
| 33792.0 | 0.155 |
| 33793.0 | 0.151 |
| 33794.0 | 0.158 |
| 33795.0 | 0.161 |
| 33798.0 | 0.149 |
| 33799.0 | 0.148 |
| 33800.0 | 0.144 |
| 33801.0 | 0.149 |
| 33802.0 | 0.128 |
| 33805.0 | 0.104 |
| 33806.0 | 0.103 |
| 33807.0 | 0.095 |
| 33808.0 | 0.094 |
| 33809.0 | 0.082 |
| 33812.0 | 0.088 |
| 33813.0 | 0.087 |
| 33814.0 | 0.094 |
| 33815.0 | 0.098 |
| 33816.0 | 0.093 |
| 33819.0 | 0.092 |
| 33820.0 | 0.097 |
| 33821.0 | 0.098 |
| 33822.0 | 0.102 |
| 33823.0 | 0.09 |
| 33826.0 | 0.08 |
| 33827.0 | 0.066 |
| 33828.0 | 0.061 |
| 33829.0 | 0.055 |
| 33830.0 | 0.068 |
| 33833.0 | 0.068 |
| 33834.0 | 0.06 |
| 33835.0 | 0.061 |
| 33836.0 | 0.059 |
| 33837.0 | 0.072 |
| 33840.0 | 0.044 |
| 33841.0 | 0.038 |
| 33842.0 | 0.036 |
| 33843.0 | 0.045 |
| 33844.0 | 0.046 |
| 33847.0 | 0.055 |
| 33848.0 | 0.049 |
| 33849.0 | 0.048 |
| 33850.0 | 0.069 |
| 33851.0 | 0.073 |
| 33854.0 | 0.068 |
| 33855.0 | 0.065 |
| 33856.0 | 0.061 |
| 33857.0 | 0.058 |
| 33858.0 | 0.07 |
| 33861.0 | 0.11 |
| 33862.0 | 0.097 |
| 33863.0 | 0.123 |
| 33864.0 | 0.11 |
| 33865.0 | 0.14 |
| 33868.0 | 0.118 |
| 33869.0 | 0.125 |
| 33870.0 | 0.111 |
| 33871.0 | 0.114 |
| 33872.0 | 0.107 |
| 33875.0 | 0.077 |
| 33876.0 | 0.074 |
| 33877.0 | 0.073 |
| 33878.0 | 0.063 |
| 33879.0 | 0.075 |
| 33882.0 | 0.022 |
| 33883.0 | 0.031 |
| 33884.0 | 0.034 |
| 33885.0 | 0.048 |
| 33886.0 | 0.056 |
| 33889.0 | 0.057 |
| 33890.0 | 0.063 |
| 33891.0 | 0.06 |
| 33892.0 | 0.053 |
| 33893.0 | 0.059 |
| 33896.0 | 0.056 |
| 33897.0 | 0.082 |
| 33898.0 | 0.067 |
| 33899.0 | 0.08 |
| 33900.0 | 0.093 |
| 33903.0 | 0.096 |
| 33904.0 | 0.093 |
| 33905.0 | 0.088 |
| 33906.0 | 0.083 |
| 33907.0 | 0.084 |
| 33910.0 | 0.084 |
| 33911.0 | 0.091 |
| 33912.0 | 0.092 |
| 33913.0 | 0.088 |
| 33914.0 | 0.083 |
| 33917.0 | 0.093 |
| 33918.0 | 0.104 |
| 33919.0 | 0.104 |
| 33920.0 | 0.107 |
| 33921.0 | 0.113 |
| 33924.0 | 0.109 |
| 33925.0 | 0.112 |
| 33926.0 | 0.115 |
| 33927.0 | 0.111 |
| 33928.0 | 0.098 |
| 33931.0 | 0.099 |
| 33932.0 | 0.102 |
| 33933.0 | 0.103 |
| 33934.0 | 0.104 |
| 33935.0 | 0.114 |
| 33938.0 | 0.117 |
| 33939.0 | 0.115 |
| 33940.0 | 0.11 |
| 33941.0 | 0.11 |
| 33942.0 | 0.109 |
| 33945.0 | 0.115 |
| 33946.0 | 0.106 |
| 33947.0 | 0.108 |
| 33948.0 | 0.098 |
| 33949.0 | 0.094 |
| 33952.0 | 0.091 |
| 33953.0 | 0.093 |
| 33954.0 | 0.082 |
| 33955.0 | 0.093 |
| 33956.0 | 0.105 |
| 33959.0 | 0.119 |
| 33960.0 | 0.128 |
| 33961.0 | 0.13 |
| 33962.0 | 0.136 |
| 33963.0 | 0.136 |
| 33966.0 | 0.129 |
| 33967.0 | 0.145 |
| 33968.0 | 0.138 |
| 33969.0 | 0.137 |
| 33970.0 | 0.138 |
| 33973.0 | 0.133 |
| 33974.0 | 0.143 |
| 33975.0 | 0.143 |
| 33976.0 | 0.138 |
| 33977.0 | 0.132 |
| 33980.0 | 0.119 |
| 33981.0 | 0.122 |
| 33982.0 | 0.12 |
| 33983.0 | 0.127 |
| 33984.0 | 0.14 |
| 33987.0 | 0.15 |
| 33988.0 | 0.15 |
| 33989.0 | 0.15 |
| 33990.0 | 0.152 |
| 33991.0 | 0.154 |
| 33994.0 | 0.139 |
| 33995.0 | 0.149 |
| 33996.0 | 0.141 |
| 33997.0 | 0.143 |
| 33998.0 | 0.147 |
| 34001.0 | 0.155 |
| 34002.0 | 0.158 |
| 34003.0 | 0.174 |
| 34004.0 | 0.181 |
| 34005.0 | 0.197 |
| 34008.0 | 0.202 |
| 34009.0 | 0.194 |
| 34010.0 | 0.196 |
| 34011.0 | 0.201 |
| 34012.0 | 0.199 |
| 34015.0 | 0.206 |
| 34016.0 | 0.198 |
| 34017.0 | 0.197 |
| 34018.0 | 0.209 |
| 34019.0 | 0.211 |
| 34022.0 | 0.217 |
| 34023.0 | 0.21 |
| 34024.0 | 0.208 |
| 34025.0 | 0.211 |
| 34026.0 | 0.225 |
| 34029.0 | 0.236 |
| 34030.0 | 0.235 |
| 34031.0 | 0.236 |
| 34032.0 | 0.234 |
| 34033.0 | 0.237 |
| 34036.0 | 0.241 |
| 34037.0 | 0.243 |
| 34038.0 | 0.242 |
| 34039.0 | 0.243 |
| 34040.0 | 0.232 |
| 34043.0 | 0.235 |
| 34044.0 | 0.232 |
| 34045.0 | 0.227 |
| 34046.0 | 0.23 |
| 34047.0 | 0.231 |
| 34050.0 | 0.216 |
| 34051.0 | 0.217 |
| 34052.0 | 0.218 |
| 34053.0 | 0.224 |
| 34054.0 | 0.227 |
| 34057.0 | 0.232 |
| 34058.0 | 0.235 |
| 34059.0 | 0.236 |
| 34060.0 | 0.227 |
| 34061.0 | 0.22 |
| 34064.0 | 0.217 |
| 34065.0 | 0.223 |
| 34066.0 | 0.221 |
| 34067.0 | 0.227 |
| 34068.0 | 0.224 |
| 34071.0 | 0.223 |
| 34072.0 | 0.235 |
| 34073.0 | 0.234 |
| 34074.0 | 0.231 |
| 34075.0 | 0.235 |
| 34078.0 | 0.237 |
| 34079.0 | 0.232 |
| 34080.0 | 0.224 |
| 34081.0 | 0.227 |
| 34082.0 | 0.221 |
| 34085.0 | 0.219 |
| 34086.0 | 0.219 |
| 34087.0 | 0.218 |
| 34088.0 | 0.209 |
| 34089.0 | 0.213 |
| 34092.0 | 0.215 |
| 34093.0 | 0.215 |
| 34094.0 | 0.214 |
| 34095.0 | 0.212 |
| 34096.0 | 0.203 |
| 34099.0 | 0.203 |
| 34100.0 | 0.203 |
| 34101.0 | 0.207 |
| 34102.0 | 0.22 |
| 34103.0 | 0.212 |
| 34106.0 | 0.206 |
| 34107.0 | 0.207 |
| 34108.0 | 0.206 |
| 34109.0 | 0.204 |
| 34110.0 | 0.202 |
| 34113.0 | 0.206 |
| 34114.0 | 0.214 |
| 34115.0 | 0.212 |
| 34116.0 | 0.216 |
| 34117.0 | 0.212 |
| 34120.0 | 0.212 |
| 34121.0 | 0.206 |
| 34122.0 | 0.209 |
| 34123.0 | 0.209 |
| 34124.0 | 0.208 |
| 34127.0 | 0.213 |
| 34128.0 | 0.216 |
| 34129.0 | 0.227 |
| 34130.0 | 0.228 |
| 34131.0 | 0.232 |
| 34134.0 | 0.234 |
| 34135.0 | 0.228 |
| 34136.0 | 0.233 |
| 34137.0 | 0.231 |
| 34138.0 | 0.236 |
| 34141.0 | 0.239 |
| 34142.0 | 0.251 |
| 34143.0 | 0.251 |
| 34144.0 | 0.247 |
| 34145.0 | 0.248 |
| 34148.0 | 0.255 |
| 34149.0 | 0.25 |
| 34150.0 | 0.251 |
| 34151.0 | 0.25 |
| 34152.0 | 0.242 |
| 34155.0 | 0.24 |
| 34156.0 | 0.242 |
| 34157.0 | 0.248 |
| 34158.0 | 0.271 |
| 34159.0 | 0.276 |
| 34162.0 | 0.279 |
| 34163.0 | 0.276 |
| 34164.0 | 0.276 |
| 34165.0 | 0.28 |
| 34166.0 | 0.279 |
| 34169.0 | 0.283 |
| 34170.0 | 0.28 |
| 34171.0 | 0.271 |
| 34172.0 | 0.276 |
| 34173.0 | 0.282 |
| 34176.0 | 0.289 |
| 34177.0 | 0.289 |
| 34178.0 | 0.288 |
| 34179.0 | 0.299 |
| 34180.0 | 0.316 |
| 34183.0 | 0.324 |
| 34184.0 | 0.321 |
| 34185.0 | 0.323 |
| 34186.0 | 0.322 |
| 34187.0 | 0.325 |
| 34190.0 | 0.336 |
| 34191.0 | 0.331 |
| 34192.0 | 0.344 |
| 34193.0 | 0.341 |
| 34194.0 | 0.343 |
| 34197.0 | 0.346 |
| 34198.0 | 0.348 |
| 34199.0 | 0.362 |
| 34200.0 | 0.366 |
| 34201.0 | 0.357 |
| 34204.0 | 0.351 |
| 34205.0 | 0.355 |
| 34206.0 | 0.371 |
| 34207.0 | 0.369 |
| 34208.0 | 0.373 |
| 34211.0 | 0.38 |
| 34212.0 | 0.384 |
| 34213.0 | 0.373 |
| 34214.0 | 0.373 |
| 34215.0 | 0.373 |
| 34218.0 | 0.365 |
| 34219.0 | 0.357 |
| 34220.0 | 0.35 |
| 34221.0 | 0.349 |
| 34222.0 | 0.345 |
| 34225.0 | 0.344 |
| 34226.0 | 0.35 |
| 34227.0 | 0.337 |
| 34228.0 | 0.333 |
| 34229.0 | 0.341 |
| 34232.0 | 0.351 |
| 34233.0 | 0.348 |
| 34234.0 | 0.34 |
| 34235.0 | 0.342 |
| 34236.0 | 0.338 |
| 34239.0 | 0.353 |
| 34240.0 | 0.354 |
| 34241.0 | 0.351 |
| 34242.0 | 0.356 |
| 34243.0 | 0.357 |
| 34246.0 | 0.362 |
| 34247.0 | 0.377 |
| 34248.0 | 0.384 |
| 34249.0 | 0.383 |
| 34250.0 | 0.394 |
| 34253.0 | 0.382 |
| 34254.0 | 0.379 |
| 34255.0 | 0.378 |
| 34256.0 | 0.377 |
| 34257.0 | 0.387 |
| 34260.0 | 0.397 |
| 34261.0 | 0.393 |
| 34262.0 | 0.399 |
| 34263.0 | 0.405 |
| 34264.0 | 0.417 |
| 34267.0 | 0.419 |
| 34268.0 | 0.413 |
| 34269.0 | 0.404 |
| 34270.0 | 0.407 |
| 34271.0 | 0.412 |
| 34274.0 | 0.413 |
| 34275.0 | 0.417 |
| 34276.0 | 0.416 |
| 34277.0 | 0.407 |
| 34278.0 | 0.385 |
| 34281.0 | 0.384 |
| 34282.0 | 0.389 |
| 34283.0 | 0.383 |
| 34284.0 | 0.381 |
| 34285.0 | 0.379 |
| 34288.0 | 0.389 |
| 34289.0 | 0.39 |
| 34290.0 | 0.395 |
| 34291.0 | 0.401 |
| 34292.0 | 0.398 |
| 34295.0 | 0.375 |
| 34296.0 | 0.37 |
| 34297.0 | 0.371 |
| 34298.0 | 0.382 |
| 34299.0 | 0.385 |
| 34302.0 | 0.384 |
| 34303.0 | 0.387 |
| 34304.0 | 0.403 |
| 34305.0 | 0.409 |
| 34306.0 | 0.415 |
| 34309.0 | 0.419 |
| 34310.0 | 0.42 |
| 34311.0 | 0.431 |
| 34312.0 | 0.437 |
| 34313.0 | 0.43 |
| 34316.0 | 0.432 |
| 34317.0 | 0.42 |
| 34318.0 | 0.415 |
| 34319.0 | 0.423 |
| 34320.0 | 0.431 |
| 34323.0 | 0.44 |
| 34324.0 | 0.443 |
| 34325.0 | 0.448 |
| 34326.0 | 0.456 |
| 34327.0 | 0.456 |
| 34330.0 | 0.464 |
| 34331.0 | 0.459 |
| 34332.0 | 0.455 |
| 34333.0 | 0.463 |
| 34334.0 | 0.464 |
| 34337.0 | 0.47 |
| 34338.0 | 0.466 |
| 34339.0 | 0.459 |
| 34340.0 | 0.462 |
| 34341.0 | 0.465 |
| 34344.0 | 0.468 |
| 34345.0 | 0.469 |
| 34346.0 | 0.455 |
| 34347.0 | 0.442 |
| 34348.0 | 0.445 |
| 34351.0 | 0.443 |
| 34352.0 | 0.447 |
| 34353.0 | 0.456 |
| 34354.0 | 0.45 |
| 34355.0 | 0.443 |
| 34358.0 | 0.448 |
| 34359.0 | 0.454 |
| 34360.0 | 0.456 |
| 34361.0 | 0.457 |
| 34362.0 | 0.467 |
| 34365.0 | 0.481 |
| 34366.0 | 0.478 |
| 34367.0 | 0.482 |
| 34368.0 | 0.474 |
| 34369.0 | 0.473 |
| 34372.0 | 0.452 |
| 34373.0 | 0.465 |
| 34374.0 | 0.462 |
| 34375.0 | 0.465 |
| 34376.0 | 0.457 |
| 34379.0 | 0.454 |
| 34380.0 | 0.457 |
| 34381.0 | 0.461 |
| 34382.0 | 0.464 |
| 34383.0 | 0.464 |
| 34386.0 | 0.45 |
| 34387.0 | 0.446 |
| 34388.0 | 0.455 |
| 34389.0 | 0.434 |
| 34390.0 | 0.428 |
| 34393.0 | 0.438 |
| 34394.0 | 0.422 |
| 34395.0 | 0.403 |
| 34396.0 | 0.412 |
| 34397.0 | 0.421 |
| 34400.0 | 0.438 |
| 34401.0 | 0.44 |
| 34402.0 | 0.432 |
| 34403.0 | 0.437 |
| 34404.0 | 0.427 |
| 34407.0 | 0.443 |
| 34408.0 | 0.454 |
| 34409.0 | 0.451 |
| 34410.0 | 0.453 |
| 34411.0 | 0.444 |
| 34414.0 | 0.435 |
| 34415.0 | 0.434 |
| 34416.0 | 0.439 |
| 34417.0 | 0.429 |
| 34418.0 | 0.419 |
| 34421.0 | 0.43 |
| 34422.0 | 0.429 |
| 34423.0 | 0.418 |
| 34424.0 | 0.416 |
| 34425.0 | 0.418 |
| 34428.0 | 0.415 |
| 34429.0 | 0.422 |
| 34430.0 | 0.437 |
| 34431.0 | 0.441 |
| 34432.0 | 0.446 |
| 34435.0 | 0.459 |
| 34436.0 | 0.462 |
| 34437.0 | 0.459 |
| 34438.0 | 0.453 |
| 34439.0 | 0.458 |
| 34442.0 | 0.456 |
| 34443.0 | 0.441 |
| 34444.0 | 0.438 |
| 34445.0 | 0.436 |
| 34446.0 | 0.452 |
| 34449.0 | 0.447 |
| 34450.0 | 0.46 |
| 34451.0 | 0.467 |
| 34452.0 | 0.463 |
| 34453.0 | 0.46 |
| 34456.0 | 0.464 |
| 34457.0 | 0.461 |
| 34458.0 | 0.451 |
| 34459.0 | 0.451 |
| 34460.0 | 0.459 |
| 34463.0 | 0.45 |
| 34464.0 | 0.462 |
| 34465.0 | 0.463 |
| 34466.0 | 0.465 |
| 34467.0 | 0.467 |
| 34470.0 | 0.467 |
| 34471.0 | 0.469 |
| 34472.0 | 0.47 |
| 34473.0 | 0.465 |
| 34474.0 | 0.459 |
| 34477.0 | 0.456 |
| 34478.0 | 0.442 |
| 34479.0 | 0.427 |
| 34480.0 | 0.421 |
| 34481.0 | 0.416 |
| 34484.0 | 0.414 |
| 34485.0 | 0.411 |
| 34486.0 | 0.403 |
| 34487.0 | 0.408 |
| 34488.0 | 0.415 |
| 34491.0 | 0.421 |
| 34492.0 | 0.416 |
| 34493.0 | 0.42 |
| 34494.0 | 0.414 |
| 34495.0 | 0.418 |
| 34498.0 | 0.403 |
| 34499.0 | 0.397 |
| 34500.0 | 0.393 |
| 34501.0 | 0.383 |
| 34502.0 | 0.379 |
| 34505.0 | 0.35 |
| 34506.0 | 0.345 |
| 34507.0 | 0.356 |
| 34508.0 | 0.372 |
| 34509.0 | 0.359 |
| 34512.0 | 0.35 |
| 34513.0 | 0.358 |
| 34514.0 | 0.366 |
| 34515.0 | 0.355 |
| 34516.0 | 0.356 |
| 34519.0 | 0.358 |
| 34520.0 | 0.356 |
| 34521.0 | 0.357 |
| 34522.0 | 0.361 |
| 34523.0 | 0.365 |
| 34526.0 | 0.372 |
| 34527.0 | 0.365 |
| 34528.0 | 0.375 |
| 34529.0 | 0.378 |
| 34530.0 | 0.387 |
| 34533.0 | 0.396 |
| 34534.0 | 0.408 |
| 34535.0 | 0.407 |
| 34536.0 | 0.408 |
| 34537.0 | 0.417 |
| 34540.0 | 0.417 |
| 34541.0 | 0.42 |
| 34542.0 | 0.412 |
| 34543.0 | 0.41 |
| 34544.0 | 0.422 |
| 34547.0 | 0.427 |
| 34548.0 | 0.44 |
| 34549.0 | 0.442 |
| 34550.0 | 0.439 |
| 34551.0 | 0.439 |
| 34554.0 | 0.439 |
| 34555.0 | 0.428 |
| 34556.0 | 0.421 |
| 34557.0 | 0.419 |
| 34558.0 | 0.405 |
| 34561.0 | 0.407 |
| 34562.0 | 0.409 |
| 34563.0 | 0.414 |
| 34564.0 | 0.406 |
| 34565.0 | 0.406 |
| 34568.0 | 0.398 |
| 34569.0 | 0.402 |
| 34570.0 | 0.409 |
| 34571.0 | 0.419 |
| 34572.0 | 0.429 |
| 34575.0 | 0.439 |
| 34576.0 | 0.437 |
| 34577.0 | 0.439 |
| 34578.0 | 0.429 |
| 34579.0 | 0.429 |
| 34582.0 | 0.418 |
| 34583.0 | 0.408 |
| 34584.0 | 0.412 |
| 34585.0 | 0.417 |
| 34586.0 | 0.414 |
| 34589.0 | 0.406 |
| 34590.0 | 0.405 |
| 34591.0 | 0.4 |
| 34592.0 | 0.406 |
| 34593.0 | 0.399 |
| 34596.0 | 0.392 |
| 34597.0 | 0.383 |
| 34598.0 | 0.382 |
| 34599.0 | 0.378 |
| 34600.0 | 0.388 |
| 34603.0 | 0.382 |
| 34604.0 | 0.381 |
| 34605.0 | 0.389 |
| 34606.0 | 0.376 |
| 34607.0 | 0.369 |
| 34610.0 | 0.361 |
| 34611.0 | 0.36 |
| 34612.0 | 0.342 |
| 34613.0 | 0.343 |
| 34614.0 | 0.343 |
| 34617.0 | 0.364 |
| 34618.0 | 0.379 |
| 34619.0 | 0.382 |
| 34620.0 | 0.392 |
| 34621.0 | 0.393 |
| 34624.0 | 0.387 |
| 34625.0 | 0.38 |
| 34626.0 | 0.371 |
| 34627.0 | 0.373 |
| 34628.0 | 0.359 |
| 34631.0 | 0.36 |
| 34632.0 | 0.348 |
| 34633.0 | 0.355 |
| 34634.0 | 0.359 |
| 34635.0 | 0.376 |
| 34638.0 | 0.388 |
| 34639.0 | 0.383 |
| 34640.0 | 0.37 |
| 34641.0 | 0.378 |
| 34642.0 | 0.383 |
| 34645.0 | 0.371 |
| 34646.0 | 0.376 |
| 34647.0 | 0.391 |
| 34648.0 | 0.388 |
| 34649.0 | 0.387 |
| 34652.0 | 0.389 |
| 34653.0 | 0.401 |
| 34654.0 | 0.395 |
| 34655.0 | 0.39 |
| 34656.0 | 0.389 |
| 34659.0 | 0.391 |
| 34660.0 | 0.378 |
| 34661.0 | 0.363 |
| 34662.0 | 0.376 |
| 34663.0 | 0.378 |
| 34666.0 | 0.382 |
| 34667.0 | 0.377 |
| 34668.0 | 0.385 |
| 34669.0 | 0.383 |
| 34670.0 | 0.386 |
| 34673.0 | 0.393 |
| 34674.0 | 0.384 |
| 34675.0 | 0.384 |
| 34676.0 | 0.38 |
| 34677.0 | 0.371 |
| 34680.0 | 0.364 |
| 34681.0 | 0.362 |
| 34682.0 | 0.367 |
| 34683.0 | 0.372 |
| 34684.0 | 0.376 |
| 34687.0 | 0.378 |
| 34688.0 | 0.378 |
| 34689.0 | 0.386 |
| 34690.0 | 0.39 |
| 34691.0 | 0.391 |
| 34694.0 | 0.393 |
| 34695.0 | 0.395 |
| 34696.0 | 0.398 |
| 34697.0 | 0.377 |
| 34698.0 | 0.383 |
| 34701.0 | 0.379 |
| 34702.0 | 0.38 |
| 34703.0 | 0.381 |
| 34704.0 | 0.373 |
| 34705.0 | 0.375 |
| 34708.0 | 0.37 |
| 34709.0 | 0.368 |
| 34710.0 | 0.366 |
| 34711.0 | 0.367 |
| 34712.0 | 0.369 |
| 34715.0 | 0.384 |
| 34716.0 | 0.381 |
| 34717.0 | 0.379 |
| 34718.0 | 0.381 |
| 34719.0 | 0.371 |
| 34722.0 | 0.358 |
| 34723.0 | 0.361 |
| 34724.0 | 0.363 |
| 34725.0 | 0.371 |
| 34726.0 | 0.372 |
| 34729.0 | 0.372 |
| 34730.0 | 0.364 |
| 34731.0 | 0.378 |
| 34732.0 | 0.378 |
| 34733.0 | 0.386 |
| 34736.0 | 0.397 |
| 34737.0 | 0.396 |
| 34738.0 | 0.393 |
| 34739.0 | 0.4 |
| 34740.0 | 0.403 |
| 34743.0 | 0.398 |
| 34744.0 | 0.401 |
| 34745.0 | 0.402 |
| 34746.0 | 0.391 |
| 34747.0 | 0.389 |
| 34750.0 | 0.381 |
| 34751.0 | 0.381 |
| 34752.0 | 0.378 |
| 34753.0 | 0.387 |
| 34754.0 | 0.384 |
| 34757.0 | 0.377 |
| 34758.0 | 0.377 |
| 34759.0 | 0.384 |
| 34760.0 | 0.383 |
| 34761.0 | 0.379 |
| 34764.0 | 0.37 |
| 34765.0 | 0.364 |
| 34766.0 | 0.353 |
| 34767.0 | 0.347 |
| 34768.0 | 0.353 |
| 34771.0 | 0.348 |
| 34772.0 | 0.357 |
| 34773.0 | 0.355 |
| 34774.0 | 0.358 |
| 34775.0 | 0.371 |
| 34778.0 | 0.37 |
| 34779.0 | 0.368 |
| 34780.0 | 0.37 |
| 34781.0 | 0.351 |
| 34782.0 | 0.355 |
| 34785.0 | 0.363 |
| 34786.0 | 0.356 |
| 34787.0 | 0.358 |
| 34788.0 | 0.373 |
| 34789.0 | 0.367 |
| 34792.0 | 0.365 |
| 34793.0 | 0.376 |
| 34794.0 | 0.378 |
| 34795.0 | 0.384 |
| 34796.0 | 0.381 |
| 34799.0 | 0.377 |
| 34800.0 | 0.379 |
| 34801.0 | 0.382 |
| 34802.0 | 0.382 |
| 34803.0 | 0.383 |
| 34806.0 | 0.384 |
| 34807.0 | 0.378 |
| 34808.0 | 0.378 |
| 34809.0 | 0.379 |
| 34810.0 | 0.392 |
| 34813.0 | 0.391 |
| 34814.0 | 0.4 |
| 34815.0 | 0.407 |
| 34816.0 | 0.406 |
| 34817.0 | 0.402 |
| 34820.0 | 0.407 |
| 34821.0 | 0.416 |
| 34822.0 | 0.421 |
| 34823.0 | 0.423 |
| 34824.0 | 0.419 |
| 34827.0 | 0.419 |
| 34828.0 | 0.428 |
| 34829.0 | 0.434 |
| 34830.0 | 0.437 |
| 34831.0 | 0.439 |
| 34834.0 | 0.434 |
| 34835.0 | 0.441 |
| 34836.0 | 0.437 |
| 34837.0 | 0.43 |
| 34838.0 | 0.418 |
| 34841.0 | 0.426 |
| 34842.0 | 0.425 |
| 34843.0 | 0.433 |
| 34844.0 | 0.431 |
| 34845.0 | 0.417 |
| 34848.0 | 0.412 |
| 34849.0 | 0.42 |
| 34850.0 | 0.425 |
| 34851.0 | 0.437 |
| 34852.0 | 0.437 |
| 34855.0 | 0.437 |
| 34856.0 | 0.437 |
| 34857.0 | 0.439 |
| 34858.0 | 0.434 |
| 34859.0 | 0.425 |
| 34862.0 | 0.423 |
| 34863.0 | 0.424 |
| 34864.0 | 0.422 |
| 34865.0 | 0.427 |
| 34866.0 | 0.422 |
| 34869.0 | 0.43 |
| 34870.0 | 0.428 |
| 34871.0 | 0.429 |
| 34872.0 | 0.437 |
| 34873.0 | 0.434 |
| 34876.0 | 0.434 |
| 34877.0 | 0.429 |
| 34878.0 | 0.419 |
| 34879.0 | 0.419 |
| 34880.0 | 0.414 |
| 34883.0 | 0.42 |
| 34884.0 | 0.428 |
| 34885.0 | 0.429 |
| 34886.0 | 0.428 |
| 34887.0 | 0.447 |
| 34890.0 | 0.457 |
| 34891.0 | 0.461 |
| 34892.0 | 0.464 |
| 34893.0 | 0.467 |
| 34894.0 | 0.461 |
| 34897.0 | 0.464 |
| 34898.0 | 0.462 |
| 34899.0 | 0.454 |
| 34900.0 | 0.45 |
| 34901.0 | 0.454 |
| 34904.0 | 0.463 |
| 34905.0 | 0.471 |
| 34906.0 | 0.474 |
| 34907.0 | 0.474 |
| 34908.0 | 0.469 |
| 34911.0 | 0.466 |
| 34912.0 | 0.466 |
| 34913.0 | 0.48 |
| 34914.0 | 0.474 |
| 34915.0 | 0.475 |
| 34918.0 | 0.477 |
| 34919.0 | 0.477 |
| 34920.0 | 0.473 |
| 34921.0 | 0.473 |
| 34922.0 | 0.475 |
| 34925.0 | 0.471 |
| 34926.0 | 0.475 |
| 34927.0 | 0.479 |
| 34928.0 | 0.478 |
| 34929.0 | 0.482 |
| 34932.0 | 0.487 |
| 34933.0 | 0.482 |
| 34934.0 | 0.481 |
| 34935.0 | 0.478 |
| 34936.0 | 0.475 |
| 34939.0 | 0.468 |
| 34940.0 | 0.466 |
| 34941.0 | 0.469 |
| 34942.0 | 0.464 |
| 34943.0 | 0.464 |
| 34946.0 | 0.471 |
| 34947.0 | 0.474 |
| 34948.0 | 0.476 |
| 34949.0 | 0.474 |
| 34950.0 | 0.476 |
| 34953.0 | 0.475 |
| 34954.0 | 0.478 |
| 34955.0 | 0.486 |
| 34956.0 | 0.488 |
| 34957.0 | 0.489 |
| 34960.0 | 0.483 |
| 34961.0 | 0.487 |
| 34962.0 | 0.487 |
| 34963.0 | 0.483 |
| 34964.0 | 0.461 |
| 34967.0 | 0.459 |
| 34968.0 | 0.467 |
| 34969.0 | 0.457 |
| 34970.0 | 0.446 |
| 34971.0 | 0.455 |
| 34974.0 | 0.457 |
| 34975.0 | 0.457 |
| 34976.0 | 0.46 |
| 34977.0 | 0.461 |
| 34978.0 | 0.453 |
| 34981.0 | 0.448 |
| 34982.0 | 0.438 |
| 34983.0 | 0.443 |
| 34984.0 | 0.447 |
| 34985.0 | 0.454 |
| 34988.0 | 0.45 |
| 34989.0 | 0.45 |
| 34990.0 | 0.45 |
| 34991.0 | 0.445 |
| 34992.0 | 0.437 |
| 34995.0 | 0.42 |
| 34996.0 | 0.424 |
| 34997.0 | 0.436 |
| 34998.0 | 0.431 |
| 34999.0 | 0.417 |
| 35002.0 | 0.435 |
| 35003.0 | 0.446 |
| 35004.0 | 0.446 |
| 35005.0 | 0.451 |
| 35006.0 | 0.455 |
| 35009.0 | 0.449 |
| 35010.0 | 0.453 |
| 35011.0 | 0.452 |
| 35012.0 | 0.458 |
| 35013.0 | 0.453 |
| 35016.0 | 0.453 |
| 35017.0 | 0.456 |
| 35018.0 | 0.46 |
| 35019.0 | 0.469 |
| 35020.0 | 0.47 |
| 35023.0 | 0.476 |
| 35024.0 | 0.471 |
| 35025.0 | 0.472 |
| 35026.0 | 0.47 |
| 35027.0 | 0.475 |
| 35030.0 | 0.482 |
| 35031.0 | 0.48 |
| 35032.0 | 0.482 |
| 35033.0 | 0.48 |
| 35034.0 | 0.484 |
| 35037.0 | 0.476 |
| 35038.0 | 0.484 |
| 35039.0 | 0.488 |
| 35040.0 | 0.488 |
| 35041.0 | 0.493 |
| 35044.0 | 0.498 |
| 35045.0 | 0.506 |
| 35046.0 | 0.502 |
| 35047.0 | 0.511 |
| 35048.0 | 0.504 |
| 35051.0 | 0.498 |
| 35052.0 | 0.49 |
| 35053.0 | 0.499 |
| 35054.0 | 0.504 |
| 35055.0 | 0.515 |
| 35058.0 | 0.516 |
| 35059.0 | 0.516 |
| 35060.0 | 0.515 |
| 35061.0 | 0.515 |
| 35062.0 | 0.514 |
| 35065.0 | 0.515 |
| 35066.0 | 0.527 |
| 35067.0 | 0.539 |
| 35068.0 | 0.533 |
| 35069.0 | 0.528 |
| 35072.0 | 0.527 |
| 35073.0 | 0.53 |
| 35074.0 | 0.525 |
| 35075.0 | 0.519 |
| 35076.0 | 0.533 |
| 35079.0 | 0.532 |
| 35080.0 | 0.542 |
| 35081.0 | 0.548 |
| 35082.0 | 0.551 |
| 35083.0 | 0.561 |
| 35086.0 | 0.559 |
| 35087.0 | 0.553 |
| 35088.0 | 0.566 |
| 35089.0 | 0.57 |
| 35090.0 | 0.574 |
| 35093.0 | 0.578 |
| 35094.0 | 0.577 |
| 35095.0 | 0.581 |
| 35096.0 | 0.58 |
| 35097.0 | 0.581 |
| 35100.0 | 0.569 |
| 35101.0 | 0.571 |
| 35102.0 | 0.571 |
| 35103.0 | 0.566 |
| 35104.0 | 0.564 |
| 35107.0 | 0.568 |
| 35108.0 | 0.574 |
| 35109.0 | 0.57 |
| 35110.0 | 0.567 |
| 35111.0 | 0.566 |
| 35114.0 | 0.557 |
| 35115.0 | 0.547 |
| 35116.0 | 0.552 |
| 35117.0 | 0.561 |
| 35118.0 | 0.571 |
| 35121.0 | 0.563 |
| 35122.0 | 0.56 |
| 35123.0 | 0.571 |
| 35124.0 | 0.572 |
| 35125.0 | 0.58 |
| 35128.0 | 0.577 |
| 35129.0 | 0.57 |
| 35130.0 | 0.57 |
| 35131.0 | 0.574 |
| 35132.0 | 0.565 |
| 35135.0 | 0.551 |
| 35136.0 | 0.553 |
| 35137.0 | 0.555 |
| 35138.0 | 0.56 |
| 35139.0 | 0.561 |
| 35142.0 | 0.568 |
| 35143.0 | 0.575 |
| 35144.0 | 0.575 |
| 35145.0 | 0.576 |
| 35146.0 | 0.577 |
| 35149.0 | 0.578 |
| 35150.0 | 0.576 |
| 35151.0 | 0.582 |
| 35152.0 | 0.578 |
| 35153.0 | 0.582 |
| 35156.0 | 0.586 |
| 35157.0 | 0.587 |
| 35158.0 | 0.589 |
| 35159.0 | 0.591 |
| 35160.0 | 0.59 |
| 35163.0 | 0.591 |
| 35164.0 | 0.592 |
| 35165.0 | 0.602 |
| 35166.0 | 0.595 |
| 35167.0 | 0.595 |
| 35170.0 | 0.604 |
| 35171.0 | 0.606 |
| 35172.0 | 0.599 |
| 35173.0 | 0.602 |
| 35174.0 | 0.606 |
| 35177.0 | 0.615 |
| 35178.0 | 0.614 |
| 35179.0 | 0.615 |
| 35180.0 | 0.617 |
| 35181.0 | 0.62 |
| 35184.0 | 0.617 |
| 35185.0 | 0.618 |
| 35186.0 | 0.621 |
| 35187.0 | 0.619 |
| 35188.0 | 0.607 |
| 35191.0 | 0.609 |
| 35192.0 | 0.608 |
| 35193.0 | 0.602 |
| 35194.0 | 0.606 |
| 35195.0 | 0.61 |
| 35198.0 | 0.611 |
| 35199.0 | 0.621 |
| 35200.0 | 0.628 |
| 35201.0 | 0.626 |
| 35202.0 | 0.622 |
| 35205.0 | 0.626 |
| 35206.0 | 0.63 |
| 35207.0 | 0.624 |
| 35208.0 | 0.625 |
| 35209.0 | 0.622 |
| 35212.0 | 0.624 |
| 35213.0 | 0.627 |
| 35214.0 | 0.623 |
| 35215.0 | 0.616 |
| 35216.0 | 0.62 |
| 35219.0 | 0.613 |
| 35220.0 | 0.615 |
| 35221.0 | 0.619 |
| 35222.0 | 0.62 |
| 35223.0 | 0.615 |
| 35226.0 | 0.621 |
| 35227.0 | 0.623 |
| 35228.0 | 0.626 |
| 35229.0 | 0.62 |
| 35230.0 | 0.615 |
| 35233.0 | 0.615 |
| 35234.0 | 0.619 |
| 35235.0 | 0.612 |
| 35236.0 | 0.606 |
| 35237.0 | 0.605 |
| 35240.0 | 0.61 |
| 35241.0 | 0.616 |
| 35242.0 | 0.616 |
| 35243.0 | 0.61 |
| 35244.0 | 0.615 |
| 35247.0 | 0.613 |
| 35248.0 | 0.613 |
| 35249.0 | 0.613 |
| 35250.0 | 0.617 |
| 35251.0 | 0.61 |
| 35254.0 | 0.601 |
| 35255.0 | 0.605 |
| 35256.0 | 0.602 |
| 35257.0 | 0.598 |
| 35258.0 | 0.589 |
| 35261.0 | 0.584 |
| 35262.0 | 0.561 |
| 35263.0 | 0.568 |
| 35264.0 | 0.574 |
| 35265.0 | 0.576 |
| 35268.0 | 0.561 |
| 35269.0 | 0.566 |
| 35270.0 | 0.551 |
| 35271.0 | 0.561 |
| 35272.0 | 0.556 |
| 35275.0 | 0.558 |
| 35276.0 | 0.559 |
| 35277.0 | 0.569 |
| 35278.0 | 0.576 |
| 35279.0 | 0.585 |
| 35282.0 | 0.587 |
| 35283.0 | 0.585 |
| 35284.0 | 0.588 |
| 35285.0 | 0.587 |
| 35286.0 | 0.582 |
| 35289.0 | 0.581 |
| 35290.0 | 0.583 |
| 35291.0 | 0.582 |
| 35292.0 | 0.584 |
| 35293.0 | 0.587 |
| 35296.0 | 0.591 |
| 35297.0 | 0.598 |
| 35298.0 | 0.591 |
| 35299.0 | 0.598 |
| 35300.0 | 0.595 |
| 35303.0 | 0.59 |
| 35304.0 | 0.592 |
| 35305.0 | 0.591 |
| 35306.0 | 0.584 |
| 35307.0 | 0.575 |
| 35310.0 | 0.576 |
| 35311.0 | 0.571 |
| 35312.0 | 0.577 |
| 35313.0 | 0.578 |
| 35314.0 | 0.578 |
| 35317.0 | 0.589 |
| 35318.0 | 0.593 |
| 35319.0 | 0.591 |
| 35320.0 | 0.596 |
| 35321.0 | 0.609 |
| 35324.0 | 0.615 |
| 35325.0 | 0.611 |
| 35326.0 | 0.609 |
| 35327.0 | 0.61 |
| 35328.0 | 0.614 |
| 35331.0 | 0.609 |
| 35332.0 | 0.607 |
| 35333.0 | 0.619 |
| 35334.0 | 0.622 |
| 35335.0 | 0.629 |
| 35338.0 | 0.632 |
| 35339.0 | 0.632 |
| 35340.0 | 0.639 |
| 35341.0 | 0.64 |
| 35342.0 | 0.641 |
| 35345.0 | 0.642 |
| 35346.0 | 0.643 |
| 35347.0 | 0.641 |
| 35348.0 | 0.635 |
| 35349.0 | 0.636 |
| 35352.0 | 0.637 |
| 35353.0 | 0.649 |
| 35354.0 | 0.644 |
| 35355.0 | 0.646 |
| 35356.0 | 0.655 |
| 35359.0 | 0.655 |
| 35360.0 | 0.659 |
| 35361.0 | 0.649 |
| 35362.0 | 0.647 |
| 35363.0 | 0.646 |
| 35366.0 | 0.65 |
| 35367.0 | 0.638 |
| 35368.0 | 0.634 |
| 35369.0 | 0.635 |
| 35370.0 | 0.636 |
| 35373.0 | 0.633 |
| 35374.0 | 0.647 |
| 35375.0 | 0.657 |
| 35376.0 | 0.656 |
| 35377.0 | 0.66 |
| 35380.0 | 0.657 |
| 35381.0 | 0.664 |
| 35382.0 | 0.668 |
| 35383.0 | 0.672 |
| 35384.0 | 0.678 |
| 35387.0 | 0.675 |
| 35388.0 | 0.677 |
| 35389.0 | 0.677 |
| 35390.0 | 0.676 |
| 35391.0 | 0.683 |
| 35394.0 | 0.686 |
| 35395.0 | 0.691 |
| 35396.0 | 0.683 |
| 35397.0 | 0.692 |
| 35398.0 | 0.702 |
| 35401.0 | 0.706 |
| 35402.0 | 0.712 |
| 35403.0 | 0.705 |
| 35404.0 | 0.709 |
| 35405.0 | 0.682 |
| 35408.0 | 0.695 |
| 35409.0 | 0.698 |
| 35410.0 | 0.682 |
| 35411.0 | 0.683 |
| 35412.0 | 0.671 |
| 35415.0 | 0.687 |
| 35416.0 | 0.68 |
| 35417.0 | 0.689 |
| 35418.0 | 0.701 |
| 35419.0 | 0.711 |
| 35422.0 | 0.712 |
| 35423.0 | 0.712 |
| 35424.0 | 0.71 |
| 35425.0 | 0.714 |
| 35426.0 | 0.717 |
| 35429.0 | 0.725 |
| 35430.0 | 0.72 |
| 35431.0 | 0.722 |
| 35432.0 | 0.706 |
| 35433.0 | 0.717 |
| 35436.0 | 0.722 |
| 35437.0 | 0.722 |
| 35438.0 | 0.733 |
| 35439.0 | 0.736 |
| 35440.0 | 0.745 |
| 35443.0 | 0.759 |
| 35444.0 | 0.768 |
| 35445.0 | 0.769 |
| 35446.0 | 0.777 |
| 35447.0 | 0.781 |
| 35450.0 | 0.784 |
| 35451.0 | 0.778 |
| 35452.0 | 0.793 |
| 35453.0 | 0.798 |
| 35454.0 | 0.786 |
| 35457.0 | 0.786 |
| 35458.0 | 0.789 |
| 35459.0 | 0.782 |
| 35460.0 | 0.791 |
| 35461.0 | 0.8 |
| 35464.0 | 0.8 |
| 35465.0 | 0.801 |
| 35466.0 | 0.815 |
| 35467.0 | 0.817 |
| 35468.0 | 0.826 |
| 35471.0 | 0.83 |
| 35472.0 | 0.826 |
| 35473.0 | 0.833 |
| 35474.0 | 0.841 |
| 35475.0 | 0.845 |
| 35478.0 | 0.847 |
| 35479.0 | 0.85 |
| 35480.0 | 0.845 |
| 35481.0 | 0.84 |
| 35482.0 | 0.832 |
| 35485.0 | 0.832 |
| 35486.0 | 0.845 |
| 35487.0 | 0.841 |
| 35488.0 | 0.846 |
| 35489.0 | 0.835 |
| 35492.0 | 0.837 |
| 35493.0 | 0.852 |
| 35494.0 | 0.857 |
| 35495.0 | 0.87 |
| 35496.0 | 0.867 |
| 35499.0 | 0.876 |
| 35500.0 | 0.879 |
| 35501.0 | 0.867 |
| 35502.0 | 0.862 |
| 35503.0 | 0.865 |
| 35506.0 | 0.858 |
| 35507.0 | 0.844 |
| 35508.0 | 0.846 |
| 35509.0 | 0.831 |
| 35510.0 | 0.842 |
| 35513.0 | 0.837 |
| 35514.0 | 0.851 |
| 35515.0 | 0.862 |
| 35516.0 | 0.866 |
| 35517.0 | 0.866 |
| 35520.0 | 0.864 |
| 35521.0 | 0.829 |
| 35522.0 | 0.826 |
| 35523.0 | 0.811 |
| 35524.0 | 0.813 |
| 35527.0 | 0.833 |
| 35528.0 | 0.836 |
| 35529.0 | 0.847 |
| 35530.0 | 0.842 |
| 35531.0 | 0.837 |
| 35534.0 | 0.827 |
| 35535.0 | 0.847 |
| 35536.0 | 0.85 |
| 35537.0 | 0.856 |
| 35538.0 | 0.849 |
| 35541.0 | 0.85 |
| 35542.0 | 0.85 |
| 35543.0 | 0.863 |
| 35544.0 | 0.863 |
| 35545.0 | 0.858 |
| 35548.0 | 0.852 |
| 35549.0 | 0.867 |
| 35550.0 | 0.877 |
| 35551.0 | 0.882 |
| 35552.0 | 0.882 |
| 35555.0 | 0.895 |
| 35556.0 | 0.899 |
| 35557.0 | 0.895 |
| 35558.0 | 0.896 |
| 35559.0 | 0.902 |
| 35562.0 | 0.913 |
| 35563.0 | 0.916 |
| 35564.0 | 0.922 |
| 35565.0 | 0.92 |
| 35566.0 | 0.923 |
| 35569.0 | 0.923 |
| 35570.0 | 0.906 |
| 35571.0 | 0.929 |
| 35572.0 | 0.923 |
| 35573.0 | 0.926 |
| 35576.0 | 0.929 |
| 35577.0 | 0.932 |
| 35578.0 | 0.921 |
| 35579.0 | 0.918 |
| 35580.0 | 0.902 |
| 35583.0 | 0.916 |
| 35584.0 | 0.921 |
| 35585.0 | 0.927 |
| 35586.0 | 0.932 |
| 35587.0 | 0.942 |
| 35590.0 | 0.944 |
| 35591.0 | 0.94 |
| 35592.0 | 0.945 |
| 35593.0 | 0.957 |
| 35594.0 | 0.967 |
| 35597.0 | 0.969 |
| 35598.0 | 0.961 |
| 35599.0 | 0.963 |
| 35600.0 | 0.967 |
| 35601.0 | 0.974 |
| 35604.0 | 0.974 |
| 35605.0 | 0.975 |
| 35606.0 | 0.991 |
| 35607.0 | 0.996 |
| 35608.0 | 0.993 |
| 35611.0 | 0.979 |
| 35612.0 | 0.999 |
| 35613.0 | 1.002 |
| 35614.0 | 1.017 |
| 35615.0 | 1.024 |
| 35618.0 | 1.033 |
| 35619.0 | 1.029 |
| 35620.0 | 1.038 |
| 35621.0 | 1.026 |
| 35622.0 | 1.037 |
| 35625.0 | 1.042 |
| 35626.0 | 1.039 |
| 35627.0 | 1.059 |
| 35628.0 | 1.061 |
| 35629.0 | 1.044 |
| 35632.0 | 1.027 |
| 35633.0 | 1.052 |
| 35634.0 | 1.077 |
| 35635.0 | 1.067 |
| 35636.0 | 1.075 |
| 35639.0 | 1.083 |
| 35640.0 | 1.074 |
| 35641.0 | 1.088 |
| 35642.0 | 1.088 |
| 35643.0 | 1.081 |
| 35646.0 | 1.066 |
| 35647.0 | 1.067 |
| 35648.0 | 1.086 |
| 35649.0 | 1.098 |
| 35650.0 | 1.081 |
| 35653.0 | 1.07 |
| 35654.0 | 1.077 |
| 35655.0 | 1.052 |
| 35656.0 | 1.044 |
| 35657.0 | 1.022 |
| 35660.0 | 1.024 |
| 35661.0 | 1.04 |
| 35662.0 | 1.056 |
| 35663.0 | 1.053 |
| 35664.0 | 1.027 |
| 35667.0 | 1.026 |
| 35668.0 | 1.007 |
| 35669.0 | 1.007 |
| 35670.0 | 0.996 |
| 35671.0 | 0.983 |
| 35674.0 | 0.996 |
| 35675.0 | 1.027 |
| 35676.0 | 1.036 |
| 35677.0 | 1.029 |
| 35678.0 | 1.034 |
| 35681.0 | 1.032 |
| 35682.0 | 1.026 |
| 35683.0 | 1.012 |
| 35684.0 | 0.994 |
| 35685.0 | 0.984 |
| 35688.0 | 0.992 |
| 35689.0 | 1.01 |
| 35690.0 | 1.021 |
| 35691.0 | 1.023 |
| 35692.0 | 1.025 |
| 35695.0 | 1.044 |
| 35696.0 | 1.039 |
| 35697.0 | 1.045 |
| 35698.0 | 1.043 |
| 35699.0 | 1.043 |
| 35702.0 | 1.041 |
| 35703.0 | 1.053 |
| 35704.0 | 1.063 |
| 35705.0 | 1.064 |
| 35706.0 | 1.076 |
| 35709.0 | 1.074 |
| 35710.0 | 1.071 |
| 35711.0 | 1.07 |
| 35712.0 | 1.041 |
| 35713.0 | 1.034 |
| 35716.0 | 1.053 |
| 35717.0 | 1.054 |
| 35718.0 | 1.047 |
| 35719.0 | 1.038 |
| 35720.0 | 1.024 |
| 35723.0 | 1.022 |
| 35724.0 | 1.039 |
| 35725.0 | 1.036 |
| 35726.0 | 0.998 |
| 35727.0 | 1.001 |
| 35730.0 | 0.968 |
| 35731.0 | 0.911 |
| 35732.0 | 0.968 |
| 35733.0 | 0.951 |
| 35734.0 | 0.951 |
| 35737.0 | 0.977 |
| 35738.0 | 0.967 |
| 35739.0 | 0.974 |
| 35740.0 | 0.964 |
| 35741.0 | 0.937 |
| 35744.0 | 0.946 |
| 35745.0 | 0.942 |
| 35746.0 | 0.929 |
| 35747.0 | 0.939 |
| 35748.0 | 0.943 |
| 35751.0 | 0.967 |
| 35752.0 | 0.973 |
| 35753.0 | 0.967 |
| 35754.0 | 0.988 |
| 35755.0 | 1 |
| 35758.0 | 0.974 |
| 35759.0 | 0.974 |
| 35760.0 | 0.985 |
| 35761.0 | 0.99 |
| 35762.0 | 0.99 |
| 35765.0 | 1.014 |
| 35766.0 | 1.017 |
| 35767.0 | 1.011 |
| 35768.0 | 1.02 |
| 35769.0 | 1.022 |
| 35772.0 | 1.031 |
| 35773.0 | 1.029 |
| 35774.0 | 1.013 |
| 35775.0 | 0.989 |
| 35776.0 | 0.993 |
| 35779.0 | 0.996 |
| 35780.0 | 1.016 |
| 35781.0 | 1.022 |
| 35782.0 | 1.015 |
| 35783.0 | 0.989 |
| 35786.0 | 0.992 |
| 35787.0 | 0.995 |
| 35788.0 | 0.997 |
| 35789.0 | 0.996 |
| 35790.0 | 0.996 |
| 35793.0 | 1.02 |
| 35794.0 | 1.032 |
| 35795.0 | 1.033 |
| 35796.0 | 1.033 |
| 35797.0 | 1.05 |
| 35800.0 | 1.066 |
| 35801.0 | 1.057 |
| 35802.0 | 1.056 |
| 35803.0 | 1.045 |
| 35804.0 | 1.032 |
| 35807.0 | 1.007 |
| 35808.0 | 1.024 |
| 35809.0 | 1.03 |
| 35810.0 | 1.031 |
| 35811.0 | 1.042 |
| 35814.0 | 1.051 |
| 35815.0 | 1.058 |
| 35816.0 | 1.054 |
| 35817.0 | 1.047 |
| 35818.0 | 1.039 |
| 35821.0 | 1.049 |
| 35822.0 | 1.061 |
| 35823.0 | 1.076 |
| 35824.0 | 1.085 |
| 35825.0 | 1.089 |
| 35828.0 | 1.096 |
| 35829.0 | 1.097 |
| 35830.0 | 1.091 |
| 35831.0 | 1.101 |
| 35832.0 | 1.105 |
| 35835.0 | 1.107 |
| 35836.0 | 1.106 |
| 35837.0 | 1.115 |
| 35838.0 | 1.103 |
| 35839.0 | 1.104 |
| 35842.0 | 1.114 |
| 35843.0 | 1.133 |
| 35844.0 | 1.133 |
| 35845.0 | 1.127 |
| 35846.0 | 1.129 |
| 35849.0 | 1.134 |
| 35850.0 | 1.135 |
| 35851.0 | 1.156 |
| 35852.0 | 1.161 |
| 35853.0 | 1.162 |
| 35856.0 | 1.179 |
| 35857.0 | 1.172 |
| 35858.0 | 1.162 |
| 35859.0 | 1.156 |
| 35860.0 | 1.18 |
| 35863.0 | 1.19 |
| 35864.0 | 1.189 |
| 35865.0 | 1.195 |
| 35866.0 | 1.192 |
| 35867.0 | 1.203 |
| 35870.0 | 1.213 |
| 35871.0 | 1.221 |
| 35872.0 | 1.215 |
| 35873.0 | 1.219 |
| 35874.0 | 1.231 |
| 35877.0 | 1.239 |
| 35878.0 | 1.25 |
| 35879.0 | 1.261 |
| 35880.0 | 1.247 |
| 35881.0 | 1.252 |
| 35884.0 | 1.248 |
| 35885.0 | 1.253 |
| 35886.0 | 1.266 |
| 35887.0 | 1.277 |
| 35888.0 | 1.289 |
| 35891.0 | 1.312 |
| 35892.0 | 1.294 |
| 35893.0 | 1.284 |
| 35894.0 | 1.287 |
| 35899.0 | 1.293 |
| 35900.0 | 1.295 |
| 35901.0 | 1.284 |
| 35902.0 | 1.289 |
| 35905.0 | 1.298 |
| 35906.0 | 1.297 |
| 35907.0 | 1.29 |
| 35908.0 | 1.276 |
| 35909.0 | 1.259 |
| 35912.0 | 1.223 |
| 35913.0 | 1.253 |
| 35914.0 | 1.242 |
| 35915.0 | 1.266 |
| 35919.0 | 1.301 |
| 35920.0 | 1.287 |
| 35921.0 | 1.287 |
| 35922.0 | 1.273 |
| 35923.0 | 1.285 |
| 35926.0 | 1.307 |
| 35927.0 | 1.296 |
| 35928.0 | 1.3 |
| 35929.0 | 1.3 |
| 35930.0 | 1.3 |
| 35933.0 | 1.284 |
| 35934.0 | 1.303 |
| 35935.0 | 1.314 |
| 35937.0 | 1.32 |
| 35940.0 | 1.335 |
| 35941.0 | 1.335 |
| 35942.0 | 1.311 |
| 35943.0 | 1.31 |
| 35944.0 | 1.316 |
| 35948.0 | 1.319 |
| 35949.0 | 1.328 |
| 35950.0 | 1.321 |
| 35951.0 | 1.335 |
| 35954.0 | 1.341 |
| 35955.0 | 1.333 |
| 35956.0 | 1.335 |
| 35957.0 | 1.326 |
| 35958.0 | 1.299 |
| 35961.0 | 1.284 |
| 35962.0 | 1.289 |
| 35963.0 | 1.308 |
| 35964.0 | 1.296 |
| 35965.0 | 1.286 |
| 35968.0 | 1.284 |
| 35969.0 | 1.301 |
| 35970.0 | 1.308 |
| 35971.0 | 1.326 |
| 35972.0 | 1.327 |
| 35975.0 | 1.337 |
| 35976.0 | 1.33 |
| 35977.0 | 1.347 |
| 35978.0 | 1.349 |
| 35979.0 | 1.359 |
| 35982.0 | 1.363 |
| 35983.0 | 1.366 |
| 35984.0 | 1.372 |
| 35985.0 | 1.369 |
| 35986.0 | 1.366 |
| 35989.0 | 1.372 |
| 35990.0 | 1.379 |
| 35991.0 | 1.386 |
| 35992.0 | 1.389 |
| 35993.0 | 1.401 |
| 35996.0 | 1.405 |
| 35997.0 | 1.399 |
| 35998.0 | 1.38 |
| 35999.0 | 1.38 |
| 36000.0 | 1.377 |
| 36003.0 | 1.361 |
| 36004.0 | 1.357 |
| 36005.0 | 1.356 |
| 36006.0 | 1.366 |
| 36007.0 | 1.352 |
| 36010.0 | 1.335 |
| 36011.0 | 1.332 |
| 36012.0 | 1.312 |
| 36013.0 | 1.295 |
| 36014.0 | 1.313 |
| 36017.0 | 1.293 |
| 36018.0 | 1.264 |
| 36019.0 | 1.283 |
| 36020.0 | 1.28 |
| 36021.0 | 1.294 |
| 36024.0 | 1.291 |
| 36025.0 | 1.325 |
| 36026.0 | 1.328 |
| 36027.0 | 1.313 |
| 36028.0 | 1.27 |
| 36031.0 | 1.269 |
| 36032.0 | 1.293 |
| 36033.0 | 1.263 |
| 36034.0 | 1.224 |
| 36035.0 | 1.206 |
| 36038.0 | 1.196 |
| 36039.0 | 1.186 |
| 36040.0 | 1.215 |
| 36041.0 | 1.193 |
| 36042.0 | 1.204 |
| 36045.0 | 1.216 |
| 36046.0 | 1.238 |
| 36047.0 | 1.22 |
| 36048.0 | 1.17 |
| 36049.0 | 1.166 |
| 36052.0 | 1.193 |
| 36053.0 | 1.185 |
| 36054.0 | 1.194 |
| 36055.0 | 1.143 |
| 36056.0 | 1.128 |
| 36059.0 | 1.082 |
| 36060.0 | 1.107 |
| 36061.0 | 1.141 |
| 36062.0 | 1.13 |
| 36063.0 | 1.114 |
| 36066.0 | 1.129 |
| 36067.0 | 1.12 |
| 36068.0 | 1.087 |
| 36069.0 | 1.034 |
| 36070.0 | 1.016 |
| 36073.0 | 0.999 |
| 36074.0 | 1.055 |
| 36075.0 | 1.037 |
| 36076.0 | 0.988 |
| 36077.0 | 1.009 |
| 36080.0 | 1.071 |
| 36081.0 | 1.088 |
| 36082.0 | 1.113 |
| 36083.0 | 1.113 |
| 36084.0 | 1.127 |
| 36087.0 | 1.127 |
| 36088.0 | 1.157 |
| 36089.0 | 1.141 |
| 36090.0 | 1.133 |
| 36091.0 | 1.136 |
| 36094.0 | 1.145 |
| 36095.0 | 1.173 |
| 36096.0 | 1.15 |
| 36097.0 | 1.146 |
| 36098.0 | 1.165 |
| 36101.0 | 1.187 |
| 36102.0 | 1.187 |
| 36103.0 | 1.213 |
| 36104.0 | 1.195 |
| 36105.0 | 1.194 |
| 36108.0 | 1.189 |
| 36109.0 | 1.176 |
| 36110.0 | 1.181 |
| 36111.0 | 1.179 |
| 36112.0 | 1.178 |
| 36115.0 | 1.203 |
| 36116.0 | 1.197 |
| 36117.0 | 1.195 |
| 36118.0 | 1.219 |
| 36119.0 | 1.247 |
| 36122.0 | 1.266 |
| 36123.0 | 1.256 |
| 36124.0 | 1.257 |
| 36125.0 | 1.277 |
| 36126.0 | 1.287 |
| 36129.0 | 1.261 |
| 36130.0 | 1.222 |
| 36131.0 | 1.209 |
| 36132.0 | 1.224 |
| 36133.0 | 1.229 |
| 36136.0 | 1.234 |
| 36137.0 | 1.237 |
| 36138.0 | 1.24 |
| 36139.0 | 1.238 |
| 36140.0 | 1.219 |
| 36143.0 | 1.218 |
| 36144.0 | 1.226 |
| 36145.0 | 1.241 |
| 36146.0 | 1.252 |
| 36147.0 | 1.243 |
| 36150.0 | 1.276 |
| 36151.0 | 1.283 |
| 36152.0 | 1.299 |
| 36157.0 | 1.308 |
| 36158.0 | 1.315 |
| 36159.0 | 1.311 |
| 36160.0 | 1.311 |
| 36164.0 | 1.369 |
| 36165.0 | 1.387 |
| 36166.0 | 1.409 |
| 36167.0 | 1.393 |
| 36168.0 | 1.39 |
| 36171.0 | 1.37 |
| 36172.0 | 1.358 |
| 36173.0 | 1.309 |
| 36174.0 | 1.318 |
| 36175.0 | 1.336 |
| 36178.0 | 1.362 |
| 36179.0 | 1.362 |
| 36180.0 | 1.386 |
| 36181.0 | 1.375 |
| 36182.0 | 1.336 |
| 36185.0 | 1.337 |
| 36186.0 | 1.338 |
| 36187.0 | 1.344 |
| 36188.0 | 1.36 |
| 36189.0 | 1.371 |
| 36192.0 | 1.385 |
| 36193.0 | 1.369 |
| 36194.0 | 1.354 |
| 36195.0 | 1.354 |
| 36196.0 | 1.354 |
| 36199.0 | 1.346 |
| 36200.0 | 1.311 |
| 36201.0 | 1.306 |
| 36202.0 | 1.321 |
| 36203.0 | 1.33 |
| 36206.0 | 1.333 |
| 36207.0 | 1.329 |
| 36208.0 | 1.311 |
| 36209.0 | 1.322 |
| 36210.0 | 1.333 |
| 36213.0 | 1.349 |
| 36214.0 | 1.368 |
| 36215.0 | 1.373 |
| 36216.0 | 1.356 |
| 36217.0 | 1.353 |
| 36220.0 | 1.34 |
| 36221.0 | 1.343 |
| 36222.0 | 1.326 |
| 36223.0 | 1.338 |
| 36224.0 | 1.368 |
| 36227.0 | 1.356 |
| 36228.0 | 1.355 |
| 36229.0 | 1.353 |
| 36230.0 | 1.363 |
| 36231.0 | 1.378 |
| 36234.0 | 1.381 |
| 36235.0 | 1.387 |
| 36236.0 | 1.382 |
| 36237.0 | 1.38 |
| 36238.0 | 1.395 |
| 36241.0 | 1.388 |
| 36242.0 | 1.363 |
| 36243.0 | 1.349 |
| 36244.0 | 1.365 |
| 36245.0 | 1.354 |
| 36248.0 | 1.368 |
| 36249.0 | 1.364 |
| 36250.0 | 1.374 |
| 36251.0 | 1.378 |
| 36252.0 | 1.378 |
| 36256.0 | 1.398 |
| 36257.0 | 1.402 |
| 36258.0 | 1.404 |
| 36259.0 | 1.41 |
| 36262.0 | 1.41 |
| 36263.0 | 1.42 |
| 36264.0 | 1.413 |
| 36265.0 | 1.4 |
| 36266.0 | 1.401 |
| 36269.0 | 1.414 |
| 36270.0 | 1.389 |
| 36271.0 | 1.397 |
| 36272.0 | 1.406 |
| 36273.0 | 1.403 |
| 36276.0 | 1.407 |
| 36277.0 | 1.428 |
| 36278.0 | 1.424 |
| 36279.0 | 1.422 |
| 36280.0 | 1.428 |
| 36283.0 | 1.433 |
| 36284.0 | 1.433 |
| 36285.0 | 1.417 |
| 36286.0 | 1.413 |
| 36287.0 | 1.408 |
| 36290.0 | 1.411 |
| 36291.0 | 1.413 |
| 36292.0 | 1.407 |
| 36293.0 | 1.411 |
| 36294.0 | 1.397 |
| 36297.0 | 1.378 |
| 36298.0 | 1.388 |
| 36299.0 | 1.4 |
| 36300.0 | 1.409 |
| 36301.0 | 1.41 |
| 36305.0 | 1.395 |
| 36306.0 | 1.398 |
| 36307.0 | 1.382 |
| 36308.0 | 1.386 |
| 36311.0 | 1.394 |
| 36312.0 | 1.388 |
| 36313.0 | 1.39 |
| 36314.0 | 1.399 |
| 36315.0 | 1.405 |
| 36318.0 | 1.418 |
| 36319.0 | 1.419 |
| 36320.0 | 1.423 |
| 36321.0 | 1.415 |
| 36322.0 | 1.426 |
| 36325.0 | 1.422 |
| 36326.0 | 1.424 |
| 36327.0 | 1.434 |
| 36328.0 | 1.441 |
| 36329.0 | 1.445 |
| 36332.0 | 1.457 |
| 36333.0 | 1.454 |
| 36334.0 | 1.447 |
| 36335.0 | 1.434 |
| 36336.0 | 1.423 |
| 36339.0 | 1.431 |
| 36340.0 | 1.436 |
| 36341.0 | 1.436 |
| 36342.0 | 1.457 |
| 36343.0 | 1.462 |
| 36346.0 | 1.484 |
| 36347.0 | 1.483 |
| 36348.0 | 1.478 |
| 36349.0 | 1.478 |
| 36350.0 | 1.481 |
| 36353.0 | 1.481 |
| 36354.0 | 1.467 |
| 36355.0 | 1.471 |
| 36356.0 | 1.481 |
| 36357.0 | 1.479 |
| 36360.0 | 1.477 |
| 36361.0 | 1.454 |
| 36362.0 | 1.439 |
| 36363.0 | 1.429 |
| 36364.0 | 1.419 |
| 36367.0 | 1.407 |
| 36368.0 | 1.409 |
| 36369.0 | 1.409 |
| 36370.0 | 1.38 |
| 36371.0 | 1.396 |
| 36374.0 | 1.395 |
| 36375.0 | 1.389 |
| 36376.0 | 1.383 |
| 36377.0 | 1.361 |
| 36378.0 | 1.364 |
| 36381.0 | 1.381 |
| 36382.0 | 1.367 |
| 36383.0 | 1.372 |
| 36384.0 | 1.397 |
| 36385.0 | 1.416 |
| 36388.0 | 1.419 |
| 36389.0 | 1.426 |
| 36390.0 | 1.423 |
| 36391.0 | 1.407 |
| 36392.0 | 1.417 |
| 36395.0 | 1.427 |
| 36396.0 | 1.435 |
| 36397.0 | 1.454 |
| 36398.0 | 1.453 |
| 36399.0 | 1.453 |
| 36402.0 | 1.449 |
| 36403.0 | 1.431 |
| 36404.0 | 1.438 |
| 36405.0 | 1.418 |
| 36406.0 | 1.442 |
| 36409.0 | 1.451 |
| 36410.0 | 1.448 |
| 36411.0 | 1.447 |
| 36412.0 | 1.455 |
| 36413.0 | 1.462 |
| 36416.0 | 1.455 |
| 36417.0 | 1.446 |
| 36418.0 | 1.444 |
| 36419.0 | 1.433 |
| 36420.0 | 1.426 |
| 36423.0 | 1.435 |
| 36424.0 | 1.421 |
| 36425.0 | 1.416 |
| 36426.0 | 1.426 |
| 36427.0 | 1.41 |
| 36430.0 | 1.42 |
| 36431.0 | 1.406 |
| 36432.0 | 1.404 |
| 36433.0 | 1.405 |
| 36434.0 | 1.397 |
| 36437.0 | 1.411 |
| 36438.0 | 1.421 |
| 36439.0 | 1.427 |
| 36440.0 | 1.436 |
| 36441.0 | 1.435 |
| 36444.0 | 1.437 |
| 36445.0 | 1.428 |
| 36446.0 | 1.419 |
| 36447.0 | 1.412 |
| 36448.0 | 1.396 |
| 36451.0 | 1.388 |
| 36452.0 | 1.41 |
| 36453.0 | 1.413 |
| 36454.0 | 1.411 |
| 36455.0 | 1.434 |
| 36458.0 | 1.428 |
| 36459.0 | 1.439 |
| 36460.0 | 1.436 |
| 36461.0 | 1.457 |
| 36462.0 | 1.471 |
| 36465.0 | 1.469 |
| 36466.0 | 1.471 |
| 36467.0 | 1.48 |
| 36468.0 | 1.489 |
| 36469.0 | 1.494 |
| 36472.0 | 1.497 |
| 36473.0 | 1.501 |
| 36474.0 | 1.51 |
| 36475.0 | 1.525 |
| 36476.0 | 1.524 |
| 36479.0 | 1.54 |
| 36480.0 | 1.544 |
| 36481.0 | 1.545 |
| 36482.0 | 1.56 |
| 36483.0 | 1.561 |
| 36486.0 | 1.543 |
| 36487.0 | 1.546 |
| 36488.0 | 1.549 |
| 36489.0 | 1.573 |
| 36490.0 | 1.582 |
| 36493.0 | 1.578 |
| 36494.0 | 1.566 |
| 36495.0 | 1.572 |
| 36496.0 | 1.571 |
| 36497.0 | 1.597 |
| 36500.0 | 1.599 |
| 36501.0 | 1.611 |
| 36502.0 | 1.607 |
| 36503.0 | 1.608 |
| 36504.0 | 1.599 |
| 36507.0 | 1.603 |
| 36508.0 | 1.611 |
| 36509.0 | 1.605 |
| 36510.0 | 1.612 |
| 36511.0 | 1.617 |
| 36514.0 | 1.627 |
| 36515.0 | 1.623 |
| 36516.0 | 1.638 |
| 36517.0 | 1.663 |
| 36518.0 | 1.669 |
| 36521.0 | 1.67 |
| 36522.0 | 1.671 |
| 36523.0 | 1.675 |
| 36524.0 | 1.695 |
| 36525.0 | 1.695 |
| 36528.0 | 1.683 |
| 36529.0 | 1.643 |
| 36530.0 | 1.618 |
| 36531.0 | 1.609 |
| 36532.0 | 1.641 |
| 36535.0 | 1.655 |
| 36536.0 | 1.646 |
| 36537.0 | 1.641 |
| 36538.0 | 1.65 |
| 36539.0 | 1.679 |
| 36542.0 | 1.691 |
| 36543.0 | 1.665 |
| 36544.0 | 1.666 |
| 36545.0 | 1.669 |
| 36546.0 | 1.656 |
| 36549.0 | 1.656 |
| 36550.0 | 1.642 |
| 36551.0 | 1.656 |
| 36552.0 | 1.67 |
| 36553.0 | 1.669 |
| 36556.0 | 1.649 |
| 36557.0 | 1.671 |
| 36558.0 | 1.694 |
| 36559.0 | 1.723 |
| 36560.0 | 1.738 |
| 36563.0 | 1.722 |
| 36564.0 | 1.749 |
| 36565.0 | 1.752 |
| 36566.0 | 1.748 |
| 36567.0 | 1.752 |
| 36570.0 | 1.747 |
| 36571.0 | 1.723 |
| 36572.0 | 1.727 |
| 36573.0 | 1.737 |
| 36574.0 | 1.73 |
| 36577.0 | 1.721 |
| 36578.0 | 1.719 |
| 36579.0 | 1.731 |
| 36580.0 | 1.737 |
| 36581.0 | 1.755 |
| 36584.0 | 1.739 |
| 36585.0 | 1.75 |
| 36586.0 | 1.76 |
| 36587.0 | 1.792 |
| 36588.0 | 1.8 |
| 36591.0 | 1.803 |
| 36592.0 | 1.796 |
| 36593.0 | 1.784 |
| 36594.0 | 1.782 |
| 36595.0 | 1.794 |
| 36598.0 | 1.764 |
| 36599.0 | 1.764 |
| 36600.0 | 1.73 |
| 36601.0 | 1.748 |
| 36602.0 | 1.759 |
| 36605.0 | 1.77 |
| 36606.0 | 1.766 |
| 36607.0 | 1.766 |
| 36608.0 | 1.764 |
| 36609.0 | 1.787 |
| 36612.0 | 1.785 |
| 36613.0 | 1.796 |
| 36614.0 | 1.794 |
| 36615.0 | 1.763 |
| 36616.0 | 1.763 |
| 36619.0 | 1.737 |
| 36620.0 | 1.749 |
| 36621.0 | 1.723 |
| 36622.0 | 1.749 |
| 36623.0 | 1.764 |
| 36626.0 | 1.769 |
| 36627.0 | 1.748 |
| 36628.0 | 1.749 |
| 36629.0 | 1.75 |
| 36630.0 | 1.721 |
| 36633.0 | 1.71 |
| 36634.0 | 1.726 |
| 36635.0 | 1.73 |
| 36636.0 | 1.737 |
| 36641.0 | 1.745 |
| 36642.0 | 1.762 |
| 36643.0 | 1.748 |
| 36644.0 | 1.773 |
| 36648.0 | 1.797 |
| 36649.0 | 1.775 |
| 36650.0 | 1.773 |
| 36651.0 | 1.782 |
| 36654.0 | 1.769 |
| 36655.0 | 1.75 |
| 36656.0 | 1.727 |
| 36657.0 | 1.748 |
| 36658.0 | 1.76 |
| 36661.0 | 1.75 |
| 36662.0 | 1.779 |
| 36663.0 | 1.759 |
| 36664.0 | 1.762 |
| 36665.0 | 1.726 |
| 36668.0 | 1.703 |
| 36669.0 | 1.711 |
| 36670.0 | 1.694 |
| 36671.0 | 1.718 |
| 36672.0 | 1.715 |
| 36675.0 | 1.731 |
| 36676.0 | 1.745 |
| 36677.0 | 1.753 |
| 36678.0 | 1.767 |
| 36679.0 | 1.796 |
| 36682.0 | 1.787 |
| 36683.0 | 1.777 |
| 36684.0 | 1.767 |
| 36685.0 | 1.77 |
| 36686.0 | 1.771 |
| 36689.0 | 1.771 |
| 36690.0 | 1.773 |
| 36691.0 | 1.787 |
| 36692.0 | 1.779 |
| 36693.0 | 1.769 |
| 36696.0 | 1.767 |
| 36697.0 | 1.774 |
| 36698.0 | 1.763 |
| 36699.0 | 1.759 |
| 36700.0 | 1.761 |
| 36703.0 | 1.76 |
| 36704.0 | 1.755 |
| 36705.0 | 1.759 |
| 36706.0 | 1.726 |
| 36707.0 | 1.743 |
| 36710.0 | 1.751 |
| 36711.0 | 1.75 |
| 36712.0 | 1.747 |
| 36713.0 | 1.744 |
| 36714.0 | 1.763 |
| 36717.0 | 1.765 |
| 36718.0 | 1.759 |
| 36719.0 | 1.763 |
| 36720.0 | 1.772 |
| 36721.0 | 1.776 |
| 36724.0 | 1.783 |
| 36725.0 | 1.775 |
| 36726.0 | 1.771 |
| 36727.0 | 1.775 |
| 36728.0 | 1.76 |
| 36731.0 | 1.76 |
| 36732.0 | 1.756 |
| 36733.0 | 1.757 |
| 36734.0 | 1.733 |
| 36735.0 | 1.726 |
| 36738.0 | 1.738 |
| 36739.0 | 1.735 |
| 36740.0 | 1.732 |
| 36741.0 | 1.713 |
| 36742.0 | 1.724 |
| 36745.0 | 1.731 |
| 36746.0 | 1.735 |
| 36747.0 | 1.745 |
| 36748.0 | 1.75 |
| 36749.0 | 1.749 |
| 36752.0 | 1.757 |
| 36753.0 | 1.754 |
| 36754.0 | 1.758 |
| 36755.0 | 1.752 |
| 36756.0 | 1.749 |
| 36759.0 | 1.746 |
| 36760.0 | 1.746 |
| 36761.0 | 1.745 |
| 36762.0 | 1.738 |
| 36763.0 | 1.748 |
| 36766.0 | 1.754 |
| 36767.0 | 1.751 |
| 36768.0 | 1.747 |
| 36769.0 | 1.748 |
| 36770.0 | 1.772 |
| 36773.0 | 1.789 |
| 36774.0 | 1.777 |
| 36775.0 | 1.772 |
| 36776.0 | 1.778 |
| 36777.0 | 1.759 |
| 36780.0 | 1.76 |
| 36781.0 | 1.757 |
| 36782.0 | 1.744 |
| 36783.0 | 1.754 |
| 36784.0 | 1.753 |
| 36787.0 | 1.739 |
| 36788.0 | 1.737 |
| 36789.0 | 1.724 |
| 36790.0 | 1.702 |
| 36791.0 | 1.703 |
| 36794.0 | 1.711 |
| 36795.0 | 1.701 |
| 36796.0 | 1.704 |
| 36797.0 | 1.701 |
| 36798.0 | 1.697 |
| 36801.0 | 1.706 |
| 36802.0 | 1.715 |
| 36803.0 | 1.706 |
| 36804.0 | 1.713 |
| 36805.0 | 1.706 |
| 36808.0 | 1.682 |
| 36809.0 | 1.687 |
| 36810.0 | 1.661 |
| 36811.0 | 1.662 |
| 36812.0 | 1.669 |
| 36815.0 | 1.672 |
| 36816.0 | 1.665 |
| 36817.0 | 1.643 |
| 36818.0 | 1.681 |
| 36819.0 | 1.692 |
| 36822.0 | 1.695 |
| 36823.0 | 1.72 |
| 36824.0 | 1.709 |
| 36825.0 | 1.699 |
| 36826.0 | 1.707 |
| 36829.0 | 1.71 |
| 36830.0 | 1.725 |
| 36831.0 | 1.731 |
| 36832.0 | 1.732 |
| 36833.0 | 1.734 |
| 36836.0 | 1.732 |
| 36837.0 | 1.729 |
| 36838.0 | 1.725 |
| 36839.0 | 1.717 |
| 36840.0 | 1.701 |
| 36843.0 | 1.683 |
| 36844.0 | 1.716 |
| 36845.0 | 1.725 |
| 36846.0 | 1.716 |
| 36847.0 | 1.706 |
| 36850.0 | 1.683 |
| 36851.0 | 1.692 |
| 36852.0 | 1.67 |
| 36853.0 | 1.681 |
| 36854.0 | 1.702 |
| 36857.0 | 1.703 |
| 36858.0 | 1.692 |
| 36859.0 | 1.695 |
| 36860.0 | 1.669 |
| 36861.0 | 1.681 |
| 36864.0 | 1.659 |
| 36865.0 | 1.696 |
| 36866.0 | 1.687 |
| 36867.0 | 1.694 |
| 36868.0 | 1.692 |
| 36871.0 | 1.708 |
| 36872.0 | 1.703 |
| 36873.0 | 1.692 |
| 36874.0 | 1.675 |
| 36875.0 | 1.656 |
| 36878.0 | 1.661 |
| 36879.0 | 1.676 |
| 36880.0 | 1.639 |
| 36881.0 | 1.634 |
| 36882.0 | 1.643 |
| 36887.0 | 1.657 |
| 36888.0 | 1.667 |
| 36889.0 | 1.667 |
| 36893.0 | 1.652 |
| 36894.0 | 1.644 |
| 36895.0 | 1.663 |
| 36896.0 | 1.659 |
| 36899.0 | 1.654 |
| 36900.0 | 1.64 |
| 36901.0 | 1.63 |
| 36902.0 | 1.649 |
| 36903.0 | 1.66 |
| 36906.0 | 1.665 |
| 36907.0 | 1.651 |
| 36908.0 | 1.67 |
| 36909.0 | 1.664 |
| 36910.0 | 1.656 |
| 36913.0 | 1.661 |
| 36914.0 | 1.661 |
| 36915.0 | 1.667 |
| 36916.0 | 1.669 |
| 36917.0 | 1.665 |
| 36920.0 | 1.664 |
| 36921.0 | 1.658 |
| 36922.0 | 1.669 |
| 36923.0 | 1.654 |
| 36924.0 | 1.645 |
| 36927.0 | 1.645 |
| 36928.0 | 1.653 |
| 36929.0 | 1.638 |
| 36930.0 | 1.642 |
| 36931.0 | 1.627 |
| 36934.0 | 1.637 |
| 36935.0 | 1.637 |
| 36936.0 | 1.621 |
| 36937.0 | 1.632 |
| 36938.0 | 1.613 |
| 36941.0 | 1.612 |
| 36942.0 | 1.604 |
| 36943.0 | 1.589 |
| 36944.0 | 1.573 |
| 36945.0 | 1.548 |
| 36948.0 | 1.565 |
| 36949.0 | 1.571 |
| 36950.0 | 1.567 |
| 36951.0 | 1.559 |
| 36952.0 | 1.563 |
| 36955.0 | 1.574 |
| 36956.0 | 1.589 |
| 36957.0 | 1.589 |
| 36958.0 | 1.579 |
| 36959.0 | 1.571 |
| 36962.0 | 1.544 |
| 36963.0 | 1.536 |
| 36964.0 | 1.521 |
| 36965.0 | 1.54 |
| 36966.0 | 1.517 |
| 36969.0 | 1.512 |
| 36970.0 | 1.53 |
| 36971.0 | 1.507 |
| 36972.0 | 1.463 |
| 36973.0 | 1.491 |
| 36976.0 | 1.526 |
| 36977.0 | 1.547 |
| 36978.0 | 1.529 |
| 36979.0 | 1.531 |
| 36980.0 | 1.536 |
| 36983.0 | 1.537 |
| 36984.0 | 1.5 |
| 36985.0 | 1.506 |
| 36986.0 | 1.53 |
| 36987.0 | 1.527 |
| 36990.0 | 1.541 |
| 36991.0 | 1.564 |
| 36992.0 | 1.57 |
| 36993.0 | 1.572 |
| 36998.0 | 1.562 |
| 36999.0 | 1.595 |
| 37000.0 | 1.591 |
| 37001.0 | 1.582 |
| 37004.0 | 1.57 |
| 37005.0 | 1.58 |
| 37006.0 | 1.578 |
| 37007.0 | 1.587 |
| 37008.0 | 1.603 |
| 37011.0 | 1.614 |
| 37012.0 | 1.615 |
| 37013.0 | 1.607 |
| 37014.0 | 1.586 |
| 37015.0 | 1.59 |
| 37018.0 | 1.604 |
| 37019.0 | 1.596 |
| 37020.0 | 1.59 |
| 37021.0 | 1.613 |
| 37022.0 | 1.604 |
| 37025.0 | 1.592 |
| 37026.0 | 1.598 |
| 37027.0 | 1.597 |
| 37028.0 | 1.609 |
| 37029.0 | 1.619 |
| 37032.0 | 1.622 |
| 37033.0 | 1.627 |
| 37034.0 | 1.616 |
| 37035.0 | 1.622 |
| 37036.0 | 1.608 |
| 37039.0 | 1.611 |
| 37040.0 | 1.604 |
| 37041.0 | 1.589 |
| 37042.0 | 1.592 |
| 37043.0 | 1.589 |
| 37046.0 | 1.593 |
| 37047.0 | 1.607 |
| 37048.0 | 1.602 |
| 37049.0 | 1.597 |
| 37050.0 | 1.598 |
| 37053.0 | 1.592 |
| 37054.0 | 1.561 |
| 37055.0 | 1.571 |
| 37056.0 | 1.559 |
| 37057.0 | 1.548 |
| 37060.0 | 1.532 |
| 37061.0 | 1.538 |
| 37062.0 | 1.534 |
| 37063.0 | 1.533 |
| 37064.0 | 1.538 |
| 37067.0 | 1.542 |
| 37068.0 | 1.526 |
| 37069.0 | 1.521 |
| 37070.0 | 1.532 |
| 37071.0 | 1.55 |
| 37074.0 | 1.564 |
| 37075.0 | 1.55 |
| 37076.0 | 1.543 |
| 37077.0 | 1.536 |
| 37078.0 | 1.51 |
| 37081.0 | 1.51 |
| 37082.0 | 1.499 |
| 37083.0 | 1.484 |
| 37084.0 | 1.493 |
| 37085.0 | 1.502 |
| 37088.0 | 1.494 |
| 37089.0 | 1.49 |
| 37090.0 | 1.468 |
| 37091.0 | 1.489 |
| 37092.0 | 1.478 |
| 37095.0 | 1.485 |
| 37096.0 | 1.473 |
| 37097.0 | 1.455 |
| 37098.0 | 1.469 |
| 37099.0 | 1.487 |
| 37102.0 | 1.503 |
| 37103.0 | 1.513 |
| 37104.0 | 1.514 |
| 37105.0 | 1.507 |
| 37106.0 | 1.497 |
| 37109.0 | 1.502 |
| 37110.0 | 1.501 |
| 37111.0 | 1.484 |
| 37112.0 | 1.462 |
| 37113.0 | 1.447 |
| 37116.0 | 1.459 |
| 37117.0 | 1.472 |
| 37118.0 | 1.464 |
| 37119.0 | 1.452 |
| 37120.0 | 1.429 |
| 37123.0 | 1.43 |
| 37124.0 | 1.437 |
| 37125.0 | 1.438 |
| 37126.0 | 1.444 |
| 37127.0 | 1.463 |
| 37130.0 | 1.463 |
| 37131.0 | 1.446 |
| 37132.0 | 1.448 |
| 37133.0 | 1.423 |
| 37134.0 | 1.425 |
| 37137.0 | 1.411 |
| 37138.0 | 1.423 |
| 37139.0 | 1.396 |
| 37140.0 | 1.371 |
| 37141.0 | 1.345 |
| 37144.0 | 1.34 |
| 37145.0 | 1.274 |
| 37146.0 | 1.286 |
| 37147.0 | 1.296 |
| 37148.0 | 1.233 |
| 37151.0 | 1.269 |
| 37152.0 | 1.264 |
| 37153.0 | 1.238 |
| 37154.0 | 1.192 |
| 37155.0 | 1.161 |
| 37158.0 | 1.225 |
| 37159.0 | 1.234 |
| 37160.0 | 1.254 |
| 37161.0 | 1.267 |
| 37162.0 | 1.297 |
| 37165.0 | 1.27 |
| 37166.0 | 1.288 |
| 37167.0 | 1.288 |
| 37168.0 | 1.327 |
| 37169.0 | 1.313 |
| 37172.0 | 1.314 |
| 37173.0 | 1.316 |
| 37174.0 | 1.348 |
| 37175.0 | 1.36 |
| 37176.0 | 1.357 |
| 37179.0 | 1.326 |
| 37180.0 | 1.344 |
| 37181.0 | 1.366 |
| 37182.0 | 1.345 |
| 37183.0 | 1.33 |
| 37186.0 | 1.352 |
| 37187.0 | 1.38 |
| 37188.0 | 1.388 |
| 37189.0 | 1.364 |
| 37190.0 | 1.389 |
| 37193.0 | 1.365 |
| 37194.0 | 1.333 |
| 37195.0 | 1.351 |
| 37196.0 | 1.36 |
| 37197.0 | 1.358 |
| 37201.0 | 1.383 |
| 37202.0 | 1.395 |
| 37203.0 | 1.418 |
| 37204.0 | 1.403 |
| 37207.0 | 1.425 |
| 37208.0 | 1.418 |
| 37209.0 | 1.415 |
| 37210.0 | 1.414 |
| 37211.0 | 1.424 |
| 37214.0 | 1.438 |
| 37215.0 | 1.425 |
| 37216.0 | 1.421 |
| 37217.0 | 1.432 |
| 37221.0 | 1.427 |
| 37222.0 | 1.408 |
| 37223.0 | 1.394 |
| 37224.0 | 1.394 |
| 37225.0 | 1.401 |
| 37228.0 | 1.398 |
| 37229.0 | 1.41 |
| 37230.0 | 1.445 |
| 37231.0 | 1.447 |
| 37232.0 | 1.438 |
| 37235.0 | 1.418 |
| 37237.0 | 1.411 |
| 37238.0 | 1.387 |
| 37239.0 | 1.377 |
| 37242.0 | 1.411 |
| 37243.0 | 1.408 |
| 37244.0 | 1.4 |
| 37245.0 | 1.39 |
| 37246.0 | 1.412 |
| 37249.0 | 1.412 |
| 37252.0 | 1.434 |
| 37253.0 | 1.441 |
| 37256.0 | 1.441 |
| 37258.0 | 1.428 |
| 37259.0 | 1.448 |
| 37260.0 | 1.445 |
| 37263.0 | 1.427 |
| 37264.0 | 1.419 |
| 37265.0 | 1.419 |
| 37266.0 | 1.404 |
| 37267.0 | 1.412 |
| 37270.0 | 1.382 |
| 37271.0 | 1.396 |
| 37272.0 | 1.379 |
| 37273.0 | 1.399 |
| 37274.0 | 1.396 |
| 37277.0 | 1.386 |
| 37278.0 | 1.389 |
| 37279.0 | 1.399 |
| 37280.0 | 1.416 |
| 37281.0 | 1.413 |
| 37285.0 | 1.409 |
| 37286.0 | 1.394 |
| 37287.0 | 1.405 |
| 37288.0 | 1.408 |
| 37291.0 | 1.391 |
| 37292.0 | 1.367 |
| 37293.0 | 1.353 |
| 37294.0 | 1.363 |
| 37295.0 | 1.359 |
| 37298.0 | 1.373 |
| 37299.0 | 1.369 |
| 37300.0 | 1.377 |
| 37301.0 | 1.39 |
| 37302.0 | 1.373 |
| 37305.0 | 1.368 |
| 37306.0 | 1.343 |
| 37307.0 | 1.338 |
| 37308.0 | 1.352 |
| 37309.0 | 1.337 |
| 37312.0 | 1.355 |
| 37313.0 | 1.363 |
| 37314.0 | 1.383 |
| 37315.0 | 1.392 |
| 37316.0 | 1.398 |
| 37319.0 | 1.426 |
| 37320.0 | 1.421 |
| 37321.0 | 1.426 |
| 37322.0 | 1.431 |
| 37323.0 | 1.437 |
| 37326.0 | 1.431 |
| 37327.0 | 1.419 |
| 37328.0 | 1.414 |
| 37329.0 | 1.416 |
| 37333.0 | 1.434 |
| 37334.0 | 1.438 |
| 37335.0 | 1.425 |
| 37336.0 | 1.419 |
| 37337.0 | 1.425 |
| 37340.0 | 1.416 |
| 37341.0 | 1.422 |
| 37342.0 | 1.422 |
| 37343.0 | 1.435 |
| 37348.0 | 1.425 |
| 37349.0 | 1.426 |
| 37350.0 | 1.41 |
| 37351.0 | 1.407 |
| 37354.0 | 1.387 |
| 37355.0 | 1.392 |
| 37356.0 | 1.402 |
| 37357.0 | 1.384 |
| 37358.0 | 1.389 |
| 37361.0 | 1.399 |
| 37362.0 | 1.424 |
| 37363.0 | 1.425 |
| 37364.0 | 1.414 |
| 37365.0 | 1.415 |
| 37368.0 | 1.403 |
| 37369.0 | 1.401 |
| 37370.0 | 1.392 |
| 37371.0 | 1.378 |
| 37372.0 | 1.375 |
| 37375.0 | 1.368 |
| 37376.0 | 1.378 |
| 37377.0 | 1.378 |
| 37378.0 | 1.369 |
| 37379.0 | 1.356 |
| 37382.0 | 1.351 |
| 37383.0 | 1.344 |
| 37384.0 | 1.369 |
| 37385.0 | 1.364 |
| 37386.0 | 1.347 |
| 37389.0 | 1.36 |
| 37390.0 | 1.379 |
| 37391.0 | 1.384 |
| 37392.0 | 1.38 |
| 37393.0 | 1.373 |
| 37396.0 | 1.363 |
| 37397.0 | 1.361 |
| 37398.0 | 1.345 |
| 37399.0 | 1.348 |
| 37400.0 | 1.351 |
| 37403.0 | 1.357 |
| 37404.0 | 1.349 |
| 37405.0 | 1.346 |
| 37406.0 | 1.325 |
| 37407.0 | 1.336 |
| 37410.0 | 1.323 |
| 37411.0 | 1.286 |
| 37412.0 | 1.289 |
| 37413.0 | 1.292 |
| 37414.0 | 1.271 |
| 37417.0 | 1.269 |
| 37418.0 | 1.288 |
| 37420.0 | 1.249 |
| 37421.0 | 1.221 |
| 37424.0 | 1.265 |
| 37425.0 | 1.264 |
| 37426.0 | 1.243 |
| 37427.0 | 1.222 |
| 37428.0 | 1.215 |
| 37431.0 | 1.179 |
| 37432.0 | 1.206 |
| 37433.0 | 1.186 |
| 37434.0 | 1.204 |
| 37435.0 | 1.247 |
| 37438.0 | 1.246 |
| 37439.0 | 1.203 |
| 37440.0 | 1.179 |
| 37441.0 | 1.208 |
| 37442.0 | 1.257 |
| 37445.0 | 1.254 |
| 37446.0 | 1.24 |
| 37447.0 | 1.198 |
| 37448.0 | 1.164 |
| 37449.0 | 1.164 |
| 37452.0 | 1.101 |
| 37453.0 | 1.103 |
| 37454.0 | 1.141 |
| 37455.0 | 1.152 |
| 37456.0 | 1.096 |
| 37459.0 | 1.039 |
| 37460.0 | 1.004 |
| 37461.0 | 0.996 |
| 37462.0 | 1.027 |
| 37463.0 | 1.035 |
| 37466.0 | 1.106 |
| 37467.0 | 1.095 |
| 37468.0 | 1.092 |
| 37469.0 | 1.044 |
| 37470.0 | 1.039 |
| 37473.0 | 0.999 |
| 37474.0 | 1.057 |
| 37475.0 | 1.046 |
| 37476.0 | 1.097 |
| 37477.0 | 1.116 |
| 37480.0 | 1.087 |
| 37481.0 | 1.097 |
| 37482.0 | 1.056 |
| 37483.0 | 1.089 |
| 37484.0 | 1.103 |
| 37487.0 | 1.143 |
| 37488.0 | 1.124 |
| 37489.0 | 1.135 |
| 37490.0 | 1.159 |
| 37491.0 | 1.142 |
| 37494.0 | 1.124 |
| 37495.0 | 1.157 |
| 37496.0 | 1.109 |
| 37497.0 | 1.085 |
| 37498.0 | 1.101 |
| 37501.0 | 1.075 |
| 37502.0 | 1.025 |
| 37503.0 | 1.034 |
| 37504.0 | 1.025 |
| 37505.0 | 1.067 |
| 37508.0 | 1.046 |
| 37509.0 | 1.075 |
| 37510.0 | 1.106 |
| 37511.0 | 1.056 |
| 37512.0 | 1.033 |
| 37515.0 | 1.027 |
| 37516.0 | 1.018 |
| 37517.0 | 0.973 |
| 37518.0 | 0.95 |
| 37519.0 | 0.941 |
| 37522.0 | 0.901 |
| 37523.0 | 0.887 |
| 37524.0 | 0.91 |
| 37525.0 | 0.969 |
| 37526.0 | 0.956 |
| 37529.0 | 0.895 |
| 37530.0 | 0.923 |
| 37531.0 | 0.964 |
| 37532.0 | 0.94 |
| 37533.0 | 0.904 |
| 37536.0 | 0.896 |
| 37537.0 | 0.879 |
| 37538.0 | 0.87 |
| 37539.0 | 0.909 |
| 37540.0 | 0.96 |
| 37543.0 | 0.945 |
| 37544.0 | 1.015 |
| 37545.0 | 0.998 |
| 37546.0 | 1.035 |
| 37547.0 | 1.032 |
| 37550.0 | 1.04 |
| 37551.0 | 1.024 |
| 37552.0 | 0.98 |
| 37553.0 | 1.009 |
| 37554.0 | 1.003 |
| 37557.0 | 1.024 |
| 37558.0 | 0.973 |
| 37559.0 | 1.008 |
| 37560.0 | 1.028 |
| 37561.0 | 1.016 |
| 37564.0 | 1.057 |
| 37565.0 | 1.065 |
| 37566.0 | 1.052 |
| 37567.0 | 1.015 |
| 37568.0 | 1.001 |
| 37571.0 | 0.994 |
| 37572.0 | 1.002 |
| 37573.0 | 0.995 |
| 37574.0 | 1.031 |
| 37575.0 | 1.035 |
| 37578.0 | 1.049 |
| 37579.0 | 1.041 |
| 37580.0 | 1.038 |
| 37581.0 | 1.077 |
| 37582.0 | 1.078 |
| 37585.0 | 1.075 |
| 37586.0 | 1.046 |
| 37587.0 | 1.081 |
| 37588.0 | 1.086 |
| 37589.0 | 1.082 |
| 37592.0 | 1.084 |
| 37593.0 | 1.054 |
| 37594.0 | 1.051 |
| 37595.0 | 1.032 |
| 37596.0 | 1.033 |
| 37599.0 | 1.004 |
| 37600.0 | 1.016 |
| 37601.0 | 1.027 |
| 37602.0 | 1.009 |
| 37603.0 | 0.992 |
| 37606.0 | 1.03 |
| 37607.0 | 1.017 |
| 37608.0 | 0.991 |
| 37609.0 | 0.982 |
| 37610.0 | 0.996 |
| 37613.0 | 1.003 |
| 37617.0 | 0.965 |
| 37620.0 | 0.974 |
| 37621.0 | 0.974 |
| 37623.0 | 1.03 |
| 37624.0 | 1.022 |
| 37627.0 | 1.033 |
| 37628.0 | 1.023 |
| 37629.0 | 1 |
| 37630.0 | 1.018 |
| 37631.0 | 1.016 |
| 37634.0 | 1.02 |
| 37635.0 | 1.025 |
| 37636.0 | 1.013 |
| 37637.0 | 1.011 |
| 37638.0 | 0.976 |
| 37641.0 | 0.96 |
| 37642.0 | 0.949 |
| 37643.0 | 0.928 |
| 37644.0 | 0.924 |
| 37645.0 | 0.908 |
| 37648.0 | 0.872 |
| 37649.0 | 0.874 |
| 37650.0 | 0.888 |
| 37651.0 | 0.91 |
| 37652.0 | 0.915 |
| 37655.0 | 0.925 |
| 37656.0 | 0.886 |
| 37657.0 | 0.904 |
| 37658.0 | 0.879 |
| 37659.0 | 0.862 |
| 37662.0 | 0.859 |
| 37663.0 | 0.888 |
| 37664.0 | 0.864 |
| 37665.0 | 0.858 |
| 37666.0 | 0.893 |
| 37669.0 | 0.911 |
| 37670.0 | 0.929 |
| 37671.0 | 0.897 |
| 37672.0 | 0.881 |
| 37673.0 | 0.897 |
| 37676.0 | 0.875 |
| 37677.0 | 0.837 |
| 37678.0 | 0.827 |
| 37679.0 | 0.848 |
| 37680.0 | 0.866 |
| 37683.0 | 0.866 |
| 37684.0 | 0.843 |
| 37685.0 | 0.837 |
| 37686.0 | 0.819 |
| 37687.0 | 0.794 |
| 37690.0 | 0.765 |
| 37691.0 | 0.764 |
| 37692.0 | 0.719 |
| 37693.0 | 0.785 |
| 37694.0 | 0.837 |
| 37697.0 | 0.874 |
| 37698.0 | 0.872 |
| 37699.0 | 0.887 |
| 37700.0 | 0.873 |
| 37701.0 | 0.915 |
| 37704.0 | 0.858 |
| 37705.0 | 0.886 |
| 37706.0 | 0.88 |
| 37707.0 | 0.862 |
| 37708.0 | 0.862 |
| 37711.0 | 0.816 |
| 37712.0 | 0.831 |
| 37713.0 | 0.875 |
| 37714.0 | 0.885 |
| 37715.0 | 0.903 |
| 37718.0 | 0.944 |
| 37719.0 | 0.93 |
| 37720.0 | 0.928 |
| 37721.0 | 0.903 |
| 37722.0 | 0.914 |
| 37725.0 | 0.926 |
| 37726.0 | 0.945 |
| 37727.0 | 0.935 |
| 37728.0 | 0.948 |
| 37733.0 | 0.956 |
| 37734.0 | 0.966 |
| 37735.0 | 0.942 |
| 37736.0 | 0.925 |
| 37739.0 | 0.956 |
| 37740.0 | 0.947 |
| 37741.0 | 0.948 |
| 37742.0 | 0.948 |
| 37743.0 | 0.947 |
| 37746.0 | 0.96 |
| 37747.0 | 0.976 |
| 37748.0 | 0.962 |
| 37749.0 | 0.932 |
| 37750.0 | 0.943 |
| 37753.0 | 0.945 |
| 37754.0 | 0.943 |
| 37755.0 | 0.942 |
| 37756.0 | 0.956 |
| 37757.0 | 0.958 |
| 37760.0 | 0.915 |
| 37761.0 | 0.915 |
| 37762.0 | 0.906 |
| 37763.0 | 0.921 |
| 37764.0 | 0.914 |
| 37767.0 | 0.912 |
| 37768.0 | 0.92 |
| 37769.0 | 0.941 |
| 37770.0 | 0.942 |
| 37771.0 | 0.95 |
| 37774.0 | 0.971 |
| 37775.0 | 0.966 |
| 37776.0 | 0.978 |
| 37777.0 | 0.966 |
| 37778.0 | 0.989 |
| 37781.0 | 0.975 |
| 37782.0 | 0.984 |
| 37783.0 | 1.002 |
| 37784.0 | 1.013 |
| 37785.0 | 0.997 |
| 37788.0 | 1.018 |
| 37789.0 | 1.023 |
| 37790.0 | 1.032 |
| 37791.0 | 1.018 |
| 37792.0 | 1.027 |
| 37795.0 | 1.001 |
| 37796.0 | 0.999 |
| 37797.0 | 1.002 |
| 37798.0 | 1.002 |
| 37799.0 | 1.002 |
| 37802.0 | 0.988 |
| 37803.0 | 0.966 |
| 37804.0 | 0.988 |
| 37805.0 | 0.989 |
| 37806.0 | 0.983 |
| 37809.0 | 1.015 |
| 37810.0 | 1.018 |
| 37811.0 | 1.01 |
| 37812.0 | 0.997 |
| 37813.0 | 1.012 |
| 37816.0 | 1.028 |
| 37817.0 | 1.022 |
| 37818.0 | 1.016 |
| 37819.0 | 1 |
| 37820.0 | 1.004 |
| 37823.0 | 0.988 |
| 37824.0 | 0.995 |
| 37825.0 | 0.992 |
| 37826.0 | 1.013 |
| 37827.0 | 0.997 |
| 37830.0 | 1.015 |
| 37831.0 | 1.009 |
| 37832.0 | 1.014 |
| 37833.0 | 1.029 |
| 37834.0 | 1.013 |
| 37837.0 | 1.003 |
| 37838.0 | 1.013 |
| 37839.0 | 0.995 |
| 37840.0 | 0.995 |
| 37841.0 | 1.005 |
| 37844.0 | 1.012 |
| 37845.0 | 1.019 |
| 37846.0 | 1.02 |
| 37847.0 | 1.038 |
| 37848.0 | 1.04 |
| 37851.0 | 1.05 |
| 37852.0 | 1.052 |
| 37853.0 | 1.045 |
| 37854.0 | 1.054 |
| 37855.0 | 1.057 |
| 37858.0 | 1.046 |
| 37859.0 | 1.035 |
| 37860.0 | 1.045 |
| 37861.0 | 1.051 |
| 37862.0 | 1.043 |
| 37865.0 | 1.06 |
| 37866.0 | 1.06 |
| 37867.0 | 1.076 |
| 37868.0 | 1.075 |
| 37869.0 | 1.066 |
| 37872.0 | 1.074 |
| 37873.0 | 1.062 |
| 37874.0 | 1.047 |
| 37875.0 | 1.049 |
| 37876.0 | 1.039 |
| 37879.0 | 1.043 |
| 37880.0 | 1.054 |
| 37881.0 | 1.055 |
| 37882.0 | 1.063 |
| 37883.0 | 1.053 |
| 37886.0 | 1.026 |
| 37887.0 | 1.018 |
| 37888.0 | 1.012 |
| 37889.0 | 1.007 |
| 37890.0 | 1 |
| 37893.0 | 0.996 |
| 37894.0 | 0.978 |
| 37895.0 | 0.996 |
| 37896.0 | 0.994 |
| 37897.0 | 1.027 |
| 37900.0 | 1.02 |
| 37901.0 | 1.011 |
| 37902.0 | 1.01 |
| 37903.0 | 1.033 |
| 37904.0 | 1.028 |
| 37907.0 | 1.046 |
| 37908.0 | 1.041 |
| 37909.0 | 1.049 |
| 37910.0 | 1.044 |
| 37911.0 | 1.041 |
| 37914.0 | 1.041 |
| 37915.0 | 1.045 |
| 37916.0 | 1.025 |
| 37917.0 | 1.016 |
| 37918.0 | 1.014 |
| 37921.0 | 1.026 |
| 37922.0 | 1.038 |
| 37923.0 | 1.043 |
| 37924.0 | 1.049 |
| 37925.0 | 1.05 |
| 37928.0 | 1.072 |
| 37929.0 | 1.07 |
| 37930.0 | 1.064 |
| 37931.0 | 1.07 |
| 37932.0 | 1.082 |
| 37935.0 | 1.073 |
| 37936.0 | 1.067 |
| 37937.0 | 1.07 |
| 37938.0 | 1.074 |
| 37939.0 | 1.082 |
| 37942.0 | 1.055 |
| 37943.0 | 1.054 |
| 37944.0 | 1.05 |
| 37945.0 | 1.048 |
| 37946.0 | 1.052 |
| 37949.0 | 1.072 |
| 37950.0 | 1.07 |
| 37951.0 | 1.067 |
| 37952.0 | 1.074 |
| 37953.0 | 1.072 |
| 37956.0 | 1.088 |
| 37957.0 | 1.085 |
| 37958.0 | 1.095 |
| 37959.0 | 1.095 |
| 37960.0 | 1.087 |
| 37963.0 | 1.08 |
| 37964.0 | 1.088 |
| 37965.0 | 1.083 |
| 37966.0 | 1.092 |
| 37967.0 | 1.092 |
| 37970.0 | 1.097 |
| 37971.0 | 1.097 |
| 37972.0 | 1.095 |
| 37973.0 | 1.103 |
| 37974.0 | 1.107 |
| 37977.0 | 1.103 |
| 37978.0 | 1.106 |
| 37979.0 | 1.107 |
| 37984.0 | 1.114 |
| 37985.0 | 1.116 |
| 37986.0 | 1.12 |
| 37988.0 | 1.133 |
| 37991.0 | 1.137 |
| 37992.0 | 1.136 |
| 37993.0 | 1.128 |
| 37994.0 | 1.142 |
| 37995.0 | 1.134 |
| 37998.0 | 1.132 |
| 37999.0 | 1.135 |
| 38000.0 | 1.145 |
| 38001.0 | 1.149 |
| 38002.0 | 1.157 |
| 38005.0 | 1.162 |
| 38006.0 | 1.155 |
| 38007.0 | 1.16 |
| 38008.0 | 1.166 |
| 38009.0 | 1.167 |
| 38012.0 | 1.16 |
| 38013.0 | 1.164 |
| 38014.0 | 1.168 |
| 38015.0 | 1.155 |
| 38016.0 | 1.148 |
| 38019.0 | 1.153 |
| 38020.0 | 1.149 |
| 38021.0 | 1.141 |
| 38022.0 | 1.14 |
| 38023.0 | 1.146 |
| 38026.0 | 1.159 |
| 38027.0 | 1.163 |
| 38028.0 | 1.166 |
| 38029.0 | 1.168 |
| 38030.0 | 1.156 |
| 38033.0 | 1.161 |
| 38034.0 | 1.168 |
| 38035.0 | 1.168 |
| 38036.0 | 1.18 |
| 38037.0 | 1.171 |
| 38040.0 | 1.172 |
| 38041.0 | 1.157 |
| 38042.0 | 1.16 |
| 38043.0 | 1.163 |
| 38044.0 | 1.167 |
| 38047.0 | 1.176 |
| 38048.0 | 1.185 |
| 38049.0 | 1.178 |
| 38050.0 | 1.187 |
| 38051.0 | 1.185 |
| 38054.0 | 1.19 |
| 38055.0 | 1.177 |
| 38056.0 | 1.177 |
| 38057.0 | 1.146 |
| 38058.0 | 1.146 |
| 38061.0 | 1.118 |
| 38062.0 | 1.124 |
| 38063.0 | 1.142 |
| 38064.0 | 1.12 |
| 38065.0 | 1.123 |
| 38068.0 | 1.102 |
| 38069.0 | 1.103 |
| 38070.0 | 1.098 |
| 38071.0 | 1.117 |
| 38072.0 | 1.121 |
| 38075.0 | 1.133 |
| 38076.0 | 1.131 |
| 38077.0 | 1.13 |
| 38078.0 | 1.141 |
| 38079.0 | 1.164 |
| 38082.0 | 1.171 |
| 38083.0 | 1.157 |
| 38084.0 | 1.152 |
| 38085.0 | 1.155 |
| 38090.0 | 1.166 |
| 38091.0 | 1.154 |
| 38092.0 | 1.153 |
| 38093.0 | 1.158 |
| 38096.0 | 1.155 |
| 38097.0 | 1.162 |
| 38098.0 | 1.154 |
| 38099.0 | 1.161 |
| 38100.0 | 1.167 |
| 38103.0 | 1.164 |
| 38104.0 | 1.164 |
| 38105.0 | 1.147 |
| 38106.0 | 1.136 |
| 38107.0 | 1.13 |
| 38110.0 | 1.136 |
| 38111.0 | 1.134 |
| 38112.0 | 1.142 |
| 38113.0 | 1.122 |
| 38114.0 | 1.119 |
| 38117.0 | 1.092 |
| 38118.0 | 1.105 |
| 38119.0 | 1.09 |
| 38120.0 | 1.102 |
| 38121.0 | 1.096 |
| 38124.0 | 1.083 |
| 38125.0 | 1.089 |
| 38126.0 | 1.109 |
| 38127.0 | 1.101 |
| 38128.0 | 1.097 |
| 38131.0 | 1.104 |
| 38132.0 | 1.097 |
| 38133.0 | 1.109 |
| 38134.0 | 1.117 |
| 38135.0 | 1.111 |
| 38138.0 | 1.116 |
| 38139.0 | 1.103 |
| 38140.0 | 1.109 |
| 38141.0 | 1.111 |
| 38142.0 | 1.123 |
| 38145.0 | 1.134 |
| 38146.0 | 1.134 |
| 38147.0 | 1.13 |
| 38148.0 | 1.134 |
| 38149.0 | 1.133 |
| 38152.0 | 1.119 |
| 38153.0 | 1.129 |
| 38154.0 | 1.137 |
| 38155.0 | 1.137 |
| 38156.0 | 1.142 |
| 38159.0 | 1.14 |
| 38160.0 | 1.128 |
| 38161.0 | 1.132 |
| 38162.0 | 1.142 |
| 38163.0 | 1.141 |
| 38166.0 | 1.148 |
| 38167.0 | 1.144 |
| 38168.0 | 1.138 |
| 38169.0 | 1.136 |
| 38170.0 | 1.128 |
| 38173.0 | 1.129 |
| 38174.0 | 1.121 |
| 38175.0 | 1.121 |
| 38176.0 | 1.126 |
| 38177.0 | 1.126 |
| 38180.0 | 1.12 |
| 38181.0 | 1.121 |
| 38182.0 | 1.118 |
| 38183.0 | 1.103 |
| 38184.0 | 1.103 |
| 38187.0 | 1.097 |
| 38188.0 | 1.101 |
| 38189.0 | 1.108 |
| 38190.0 | 1.09 |
| 38191.0 | 1.088 |
| 38194.0 | 1.075 |
| 38195.0 | 1.087 |
| 38196.0 | 1.085 |
| 38197.0 | 1.104 |
| 38198.0 | 1.105 |
| 38201.0 | 1.096 |
| 38202.0 | 1.102 |
| 38203.0 | 1.092 |
| 38204.0 | 1.094 |
| 38205.0 | 1.067 |
| 38208.0 | 1.059 |
| 38209.0 | 1.067 |
| 38210.0 | 1.058 |
| 38211.0 | 1.056 |
| 38212.0 | 1.052 |
| 38215.0 | 1.062 |
| 38216.0 | 1.067 |
| 38217.0 | 1.07 |
| 38218.0 | 1.072 |
| 38219.0 | 1.07 |
| 38222.0 | 1.084 |
| 38223.0 | 1.082 |
| 38224.0 | 1.085 |
| 38225.0 | 1.093 |
| 38226.0 | 1.099 |
| 38229.0 | 1.097 |
| 38230.0 | 1.087 |
| 38231.0 | 1.095 |
| 38232.0 | 1.102 |
| 38233.0 | 1.112 |
| 38236.0 | 1.115 |
| 38237.0 | 1.117 |
| 38238.0 | 1.115 |
| 38239.0 | 1.109 |
| 38240.0 | 1.115 |
| 38243.0 | 1.127 |
| 38244.0 | 1.124 |
| 38245.0 | 1.121 |
| 38246.0 | 1.122 |
| 38247.0 | 1.13 |
| 38250.0 | 1.125 |
| 38251.0 | 1.131 |
| 38252.0 | 1.12 |
| 38253.0 | 1.111 |
| 38254.0 | 1.112 |
| 38257.0 | 1.107 |
| 38258.0 | 1.11 |
| 38259.0 | 1.115 |
| 38260.0 | 1.107 |
| 38261.0 | 1.133 |
| 38264.0 | 1.142 |
| 38265.0 | 1.145 |
| 38266.0 | 1.145 |
| 38267.0 | 1.146 |
| 38268.0 | 1.14 |
| 38271.0 | 1.139 |
| 38272.0 | 1.13 |
| 38273.0 | 1.131 |
| 38274.0 | 1.125 |
| 38275.0 | 1.125 |
| 38278.0 | 1.123 |
| 38279.0 | 1.134 |
| 38280.0 | 1.123 |
| 38281.0 | 1.129 |
| 38282.0 | 1.13 |
| 38285.0 | 1.11 |
| 38286.0 | 1.112 |
| 38287.0 | 1.129 |
| 38288.0 | 1.141 |
| 38289.0 | 1.138 |
| 38292.0 | 1.146 |
| 38293.0 | 1.154 |
| 38294.0 | 1.156 |
| 38295.0 | 1.155 |
| 38296.0 | 1.16 |
| 38299.0 | 1.16 |
| 38300.0 | 1.157 |
| 38301.0 | 1.16 |
| 38302.0 | 1.171 |
| 38303.0 | 1.172 |
| 38306.0 | 1.169 |
| 38307.0 | 1.162 |
| 38308.0 | 1.177 |
| 38309.0 | 1.175 |
| 38310.0 | 1.167 |
| 38313.0 | 1.162 |
| 38314.0 | 1.161 |
| 38315.0 | 1.161 |
| 38316.0 | 1.171 |
| 38317.0 | 1.169 |
| 38320.0 | 1.166 |
| 38321.0 | 1.161 |
| 38322.0 | 1.174 |
| 38323.0 | 1.178 |
| 38324.0 | 1.173 |
| 38327.0 | 1.171 |
| 38328.0 | 1.175 |
| 38329.0 | 1.173 |
| 38330.0 | 1.165 |
| 38331.0 | 1.171 |
| 38334.0 | 1.179 |
| 38335.0 | 1.181 |
| 38336.0 | 1.177 |
| 38337.0 | 1.179 |
| 38338.0 | 1.166 |
| 38341.0 | 1.171 |
| 38342.0 | 1.174 |
| 38343.0 | 1.182 |
| 38344.0 | 1.187 |
| 38348.0 | 1.184 |
| 38349.0 | 1.188 |
| 38350.0 | 1.187 |
| 38351.0 | 1.187 |
| 38352.0 | 1.187 |
| 38355.0 | 1.193 |
| 38356.0 | 1.193 |
| 38357.0 | 1.185 |
| 38358.0 | 1.192 |
| 38359.0 | 1.196 |
| 38362.0 | 1.195 |
| 38363.0 | 1.186 |
| 38364.0 | 1.177 |
| 38365.0 | 1.182 |
| 38366.0 | 1.186 |
| 38369.0 | 1.191 |
| 38370.0 | 1.19 |
| 38371.0 | 1.19 |
| 38372.0 | 1.182 |
| 38373.0 | 1.183 |
| 38376.0 | 1.182 |
| 38377.0 | 1.189 |
| 38378.0 | 1.188 |
| 38379.0 | 1.193 |
| 38380.0 | 1.188 |
| 38383.0 | 1.198 |
| 38384.0 | 1.206 |
| 38385.0 | 1.21 |
| 38386.0 | 1.207 |
| 38387.0 | 1.215 |
| 38390.0 | 1.22 |
| 38391.0 | 1.222 |
| 38392.0 | 1.218 |
| 38393.0 | 1.218 |
| 38394.0 | 1.229 |
| 38397.0 | 1.228 |
| 38398.0 | 1.232 |
| 38399.0 | 1.226 |
| 38400.0 | 1.225 |
| 38401.0 | 1.227 |
| 38404.0 | 1.224 |
| 38405.0 | 1.218 |
| 38406.0 | 1.212 |
| 38407.0 | 1.211 |
| 38408.0 | 1.224 |
| 38411.0 | 1.222 |
| 38412.0 | 1.229 |
| 38413.0 | 1.23 |
| 38414.0 | 1.229 |
| 38415.0 | 1.238 |
| 38418.0 | 1.241 |
| 38419.0 | 1.235 |
| 38420.0 | 1.23 |
| 38421.0 | 1.221 |
| 38422.0 | 1.223 |
| 38425.0 | 1.223 |
| 38426.0 | 1.231 |
| 38427.0 | 1.214 |
| 38428.0 | 1.216 |
| 38429.0 | 1.221 |
| 38432.0 | 1.216 |
| 38433.0 | 1.22 |
| 38434.0 | 1.215 |
| 38435.0 | 1.223 |
| 38440.0 | 1.226 |
| 38441.0 | 1.222 |
| 38442.0 | 1.221 |
| 38443.0 | 1.223 |
| 38446.0 | 1.217 |
| 38447.0 | 1.224 |
| 38448.0 | 1.228 |
| 38449.0 | 1.233 |
| 38450.0 | 1.232 |
| 38453.0 | 1.23 |
| 38454.0 | 1.225 |
| 38455.0 | 1.23 |
| 38456.0 | 1.228 |
| 38457.0 | 1.208 |
| 38460.0 | 1.186 |
| 38461.0 | 1.189 |
| 38462.0 | 1.184 |
| 38463.0 | 1.186 |
| 38464.0 | 1.195 |
| 38467.0 | 1.199 |
| 38468.0 | 1.197 |
| 38469.0 | 1.184 |
| 38470.0 | 1.18 |
| 38471.0 | 1.179 |
| 38474.0 | 1.186 |
| 38475.0 | 1.191 |
| 38476.0 | 1.197 |
| 38477.0 | 1.205 |
| 38478.0 | 1.209 |
| 38481.0 | 1.205 |
| 38482.0 | 1.198 |
| 38483.0 | 1.193 |
| 38484.0 | 1.201 |
| 38485.0 | 1.201 |
| 38488.0 | 1.199 |
| 38489.0 | 1.198 |
| 38490.0 | 1.215 |
| 38491.0 | 1.22 |
| 38492.0 | 1.22 |
| 38495.0 | 1.226 |
| 38496.0 | 1.225 |
| 38497.0 | 1.223 |
| 38498.0 | 1.231 |
| 38499.0 | 1.231 |
| 38502.0 | 1.235 |
| 38503.0 | 1.228 |
| 38504.0 | 1.244 |
| 38505.0 | 1.246 |
| 38506.0 | 1.24 |
| 38509.0 | 1.236 |
| 38510.0 | 1.247 |
| 38511.0 | 1.244 |
| 38512.0 | 1.243 |
| 38513.0 | 1.25 |
| 38516.0 | 1.255 |
| 38517.0 | 1.256 |
| 38518.0 | 1.251 |
| 38519.0 | 1.255 |
| 38520.0 | 1.261 |
| 38523.0 | 1.256 |
| 38524.0 | 1.261 |
| 38525.0 | 1.262 |
| 38526.0 | 1.265 |
| 38527.0 | 1.255 |
| 38530.0 | 1.246 |
| 38531.0 | 1.256 |
| 38532.0 | 1.261 |
| 38533.0 | 1.262 |
| 38534.0 | 1.27 |
| 38537.0 | 1.272 |
| 38538.0 | 1.27 |
| 38539.0 | 1.275 |
| 38540.0 | 1.258 |
| 38541.0 | 1.275 |
| 38544.0 | 1.282 |
| 38545.0 | 1.279 |
| 38546.0 | 1.286 |
| 38547.0 | 1.291 |
| 38548.0 | 1.292 |
| 38551.0 | 1.291 |
| 38552.0 | 1.303 |
| 38553.0 | 1.3 |
| 38554.0 | 1.298 |
| 38555.0 | 1.296 |
| 38558.0 | 1.298 |
| 38559.0 | 1.299 |
| 38560.0 | 1.302 |
| 38561.0 | 1.308 |
| 38562.0 | 1.306 |
| 38565.0 | 1.305 |
| 38566.0 | 1.313 |
| 38567.0 | 1.312 |
| 38568.0 | 1.302 |
| 38569.0 | 1.292 |
| 38572.0 | 1.296 |
| 38573.0 | 1.308 |
| 38574.0 | 1.32 |
| 38575.0 | 1.315 |
| 38576.0 | 1.309 |
| 38579.0 | 1.306 |
| 38580.0 | 1.301 |
| 38581.0 | 1.298 |
| 38582.0 | 1.293 |
| 38583.0 | 1.307 |
| 38586.0 | 1.308 |
| 38587.0 | 1.298 |
| 38588.0 | 1.297 |
| 38589.0 | 1.286 |
| 38590.0 | 1.275 |
| 38593.0 | 1.28 |
| 38594.0 | 1.278 |
| 38595.0 | 1.287 |
| 38596.0 | 1.293 |
| 38597.0 | 1.291 |
| 38600.0 | 1.299 |
| 38601.0 | 1.311 |
| 38602.0 | 1.313 |
| 38603.0 | 1.312 |
| 38604.0 | 1.316 |
| 38607.0 | 1.315 |
| 38608.0 | 1.306 |
| 38609.0 | 1.31 |
| 38610.0 | 1.31 |
| 38611.0 | 1.318 |
| 38614.0 | 1.315 |
| 38615.0 | 1.321 |
| 38616.0 | 1.306 |
| 38617.0 | 1.302 |
| 38618.0 | 1.308 |
| 38621.0 | 1.328 |
| 38622.0 | 1.324 |
| 38623.0 | 1.337 |
| 38624.0 | 1.332 |
| 38625.0 | 1.337 |
| 38628.0 | 1.343 |
| 38629.0 | 1.347 |
| 38630.0 | 1.334 |
| 38631.0 | 1.324 |
| 38632.0 | 1.321 |
| 38635.0 | 1.323 |
| 38636.0 | 1.325 |
| 38637.0 | 1.316 |
| 38638.0 | 1.308 |
| 38639.0 | 1.313 |
| 38642.0 | 1.315 |
| 38643.0 | 1.309 |
| 38644.0 | 1.292 |
| 38645.0 | 1.294 |
| 38646.0 | 1.29 |
| 38649.0 | 1.301 |
| 38650.0 | 1.296 |
| 38651.0 | 1.3 |
| 38652.0 | 1.28 |
| 38653.0 | 1.282 |
| 38656.0 | 1.304 |
| 38657.0 | 1.302 |
| 38658.0 | 1.305 |
| 38659.0 | 1.317 |
| 38660.0 | 1.315 |
| 38663.0 | 1.317 |
| 38664.0 | 1.317 |
| 38665.0 | 1.315 |
| 38666.0 | 1.317 |
| 38667.0 | 1.33 |
| 38670.0 | 1.332 |
| 38671.0 | 1.332 |
| 38672.0 | 1.326 |
| 38673.0 | 1.329 |
| 38674.0 | 1.336 |
| 38677.0 | 1.343 |
| 38678.0 | 1.343 |
| 38679.0 | 1.349 |
| 38680.0 | 1.345 |
| 38681.0 | 1.347 |
| 38684.0 | 1.344 |
| 38685.0 | 1.347 |
| 38686.0 | 1.342 |
| 38687.0 | 1.358 |
| 38688.0 | 1.363 |
| 38691.0 | 1.357 |
| 38692.0 | 1.362 |
| 38693.0 | 1.359 |
| 38694.0 | 1.36 |
| 38695.0 | 1.357 |
| 38698.0 | 1.361 |
| 38699.0 | 1.365 |
| 38700.0 | 1.363 |
| 38701.0 | 1.364 |
| 38702.0 | 1.373 |
| 38705.0 | 1.372 |
| 38706.0 | 1.375 |
| 38707.0 | 1.383 |
| 38708.0 | 1.383 |
| 38709.0 | 1.385 |
| 38713.0 | 1.389 |
| 38714.0 | 1.387 |
| 38715.0 | 1.39 |
| 38716.0 | 1.38 |
| 38719.0 | 1.387 |
| 38720.0 | 1.389 |
| 38721.0 | 1.4 |
| 38722.0 | 1.399 |
| 38723.0 | 1.404 |
| 38726.0 | 1.405 |
| 38727.0 | 1.398 |
| 38728.0 | 1.404 |
| 38729.0 | 1.405 |
| 38730.0 | 1.393 |
| 38733.0 | 1.398 |
| 38734.0 | 1.388 |
| 38735.0 | 1.377 |
| 38736.0 | 1.383 |
| 38737.0 | 1.372 |
| 38740.0 | 1.37 |
| 38741.0 | 1.367 |
| 38742.0 | 1.379 |
| 38743.0 | 1.397 |
| 38744.0 | 1.409 |
| 38747.0 | 1.407 |
| 38748.0 | 1.41 |
| 38749.0 | 1.42 |
| 38750.0 | 1.407 |
| 38751.0 | 1.407 |
| 38754.0 | 1.408 |
| 38755.0 | 1.408 |
| 38756.0 | 1.405 |
| 38757.0 | 1.42 |
| 38758.0 | 1.412 |
| 38761.0 | 1.42 |
| 38762.0 | 1.422 |
| 38763.0 | 1.421 |
| 38764.0 | 1.428 |
| 38765.0 | 1.431 |
| 38768.0 | 1.431 |
| 38769.0 | 1.434 |
| 38770.0 | 1.444 |
| 38771.0 | 1.443 |
| 38772.0 | 1.446 |
| 38775.0 | 1.45 |
| 38776.0 | 1.433 |
| 38777.0 | 1.441 |
| 38778.0 | 1.43 |
| 38779.0 | 1.422 |
| 38782.0 | 1.427 |
| 38783.0 | 1.425 |
| 38784.0 | 1.42 |
| 38785.0 | 1.428 |
| 38786.0 | 1.439 |
| 38789.0 | 1.446 |
| 38790.0 | 1.448 |
| 38791.0 | 1.45 |
| 38792.0 | 1.45 |
| 38793.0 | 1.448 |
| 38796.0 | 1.45 |
| 38797.0 | 1.452 |
| 38798.0 | 1.457 |
| 38799.0 | 1.455 |
| 38800.0 | 1.458 |
| 38803.0 | 1.447 |
| 38804.0 | 1.442 |
| 38805.0 | 1.446 |
| 38806.0 | 1.459 |
| 38807.0 | 1.453 |
| 38810.0 | 1.46 |
| 38811.0 | 1.453 |
| 38812.0 | 1.456 |
| 38813.0 | 1.455 |
| 38814.0 | 1.446 |
| 38817.0 | 1.451 |
| 38818.0 | 1.437 |
| 38819.0 | 1.433 |
| 38820.0 | 1.434 |
| 38825.0 | 1.432 |
| 38826.0 | 1.445 |
| 38827.0 | 1.455 |
| 38828.0 | 1.462 |
| 38831.0 | 1.456 |
| 38832.0 | 1.458 |
| 38833.0 | 1.462 |
| 38834.0 | 1.457 |
| 38835.0 | 1.45 |
| 38838.0 | 1.45 |
| 38839.0 | 1.456 |
| 38840.0 | 1.445 |
| 38841.0 | 1.451 |
| 38842.0 | 1.459 |
| 38845.0 | 1.46 |
| 38846.0 | 1.463 |
| 38847.0 | 1.456 |
| 38848.0 | 1.449 |
| 38849.0 | 1.426 |
| 38852.0 | 1.416 |
| 38853.0 | 1.421 |
| 38854.0 | 1.387 |
| 38855.0 | 1.387 |
| 38856.0 | 1.392 |
| 38859.0 | 1.369 |
| 38860.0 | 1.391 |
| 38861.0 | 1.378 |
| 38862.0 | 1.395 |
| 38863.0 | 1.413 |
| 38866.0 | 1.407 |
| 38867.0 | 1.383 |
| 38868.0 | 1.396 |
| 38869.0 | 1.399 |
| 38870.0 | 1.396 |
| 38873.0 | 1.387 |
| 38874.0 | 1.365 |
| 38875.0 | 1.375 |
| 38876.0 | 1.346 |
| 38877.0 | 1.363 |
| 38880.0 | 1.352 |
| 38881.0 | 1.331 |
| 38882.0 | 1.332 |
| 38883.0 | 1.355 |
| 38884.0 | 1.347 |
| 38887.0 | 1.354 |
| 38888.0 | 1.361 |
| 38889.0 | 1.365 |
| 38890.0 | 1.37 |
| 38891.0 | 1.371 |
| 38894.0 | 1.367 |
| 38895.0 | 1.359 |
| 38896.0 | 1.359 |
| 38897.0 | 1.381 |
| 38898.0 | 1.399 |
| 38901.0 | 1.403 |
| 38902.0 | 1.405 |
| 38903.0 | 1.391 |
| 38904.0 | 1.403 |
| 38905.0 | 1.4 |
| 38908.0 | 1.404 |
| 38909.0 | 1.39 |
| 38910.0 | 1.394 |
| 38911.0 | 1.375 |
| 38912.0 | 1.36 |
| 38915.0 | 1.357 |
| 38916.0 | 1.355 |
| 38917.0 | 1.381 |
| 38918.0 | 1.382 |
| 38919.0 | 1.373 |
| 38922.0 | 1.394 |
| 38923.0 | 1.394 |
| 38924.0 | 1.397 |
| 38925.0 | 1.408 |
| 38926.0 | 1.416 |
| 38929.0 | 1.411 |
| 38930.0 | 1.397 |
| 38931.0 | 1.412 |
| 38932.0 | 1.404 |
| 38933.0 | 1.418 |
| 38936.0 | 1.401 |
| 38937.0 | 1.404 |
| 38938.0 | 1.415 |
| 38939.0 | 1.406 |
| 38940.0 | 1.406 |
| 38943.0 | 1.418 |
| 38944.0 | 1.431 |
| 38945.0 | 1.437 |
| 38946.0 | 1.439 |
| 38947.0 | 1.437 |
| 38950.0 | 1.433 |
| 38951.0 | 1.437 |
| 38952.0 | 1.429 |
| 38953.0 | 1.435 |
| 38954.0 | 1.434 |
| 38957.0 | 1.442 |
| 38958.0 | 1.441 |
| 38959.0 | 1.444 |
| 38960.0 | 1.442 |
| 38961.0 | 1.445 |
| 38964.0 | 1.449 |
| 38965.0 | 1.444 |
| 38966.0 | 1.432 |
| 38967.0 | 1.423 |
| 38968.0 | 1.426 |
| 38971.0 | 1.424 |
| 38972.0 | 1.437 |
| 38973.0 | 1.441 |
| 38974.0 | 1.439 |
| 38975.0 | 1.443 |
| 38978.0 | 1.442 |
| 38979.0 | 1.434 |
| 38980.0 | 1.45 |
| 38981.0 | 1.454 |
| 38982.0 | 1.443 |
| 38985.0 | 1.445 |
| 38986.0 | 1.458 |
| 38987.0 | 1.464 |
| 38988.0 | 1.464 |
| 38989.0 | 1.465 |
| 38992.0 | 1.463 |
| 38993.0 | 1.46 |
| 38994.0 | 1.469 |
| 38995.0 | 1.476 |
| 38996.0 | 1.476 |
| 38999.0 | 1.475 |
| 39000.0 | 1.481 |
| 39001.0 | 1.483 |
| 39002.0 | 1.491 |
| 39003.0 | 1.491 |
| 39006.0 | 1.491 |
| 39007.0 | 1.478 |
| 39008.0 | 1.489 |
| 39009.0 | 1.487 |
| 39010.0 | 1.49 |
| 39013.0 | 1.495 |
| 39014.0 | 1.494 |
| 39015.0 | 1.496 |
| 39016.0 | 1.498 |
| 39017.0 | 1.495 |
| 39020.0 | 1.492 |
| 39021.0 | 1.492 |
| 39022.0 | 1.494 |
| 39023.0 | 1.484 |
| 39024.0 | 1.488 |
| 39027.0 | 1.502 |
| 39028.0 | 1.509 |
| 39029.0 | 1.509 |
| 39030.0 | 1.509 |
| 39031.0 | 1.507 |
| 39034.0 | 1.512 |
| 39035.0 | 1.512 |
| 39036.0 | 1.518 |
| 39037.0 | 1.518 |
| 39038.0 | 1.511 |
| 39041.0 | 1.514 |
| 39042.0 | 1.514 |
| 39043.0 | 1.514 |
| 39044.0 | 1.512 |
| 39045.0 | 1.503 |
| 39048.0 | 1.485 |
| 39049.0 | 1.485 |
| 39050.0 | 1.497 |
| 39051.0 | 1.488 |
| 39052.0 | 1.474 |
| 39055.0 | 1.481 |
| 39056.0 | 1.493 |
| 39057.0 | 1.491 |
| 39058.0 | 1.495 |
| 39059.0 | 1.496 |
| 39062.0 | 1.504 |
| 39063.0 | 1.506 |
| 39064.0 | 1.514 |
| 39065.0 | 1.52 |
| 39066.0 | 1.525 |
| 39069.0 | 1.523 |
| 39070.0 | 1.516 |
| 39071.0 | 1.52 |
| 39072.0 | 1.518 |
| 39073.0 | 1.509 |
| 39078.0 | 1.524 |
| 39079.0 | 1.523 |
| 39080.0 | 1.52 |
| 39084.0 | 1.535 |
| 39085.0 | 1.537 |
| 39086.0 | 1.534 |
| 39087.0 | 1.523 |
| 39090.0 | 1.521 |
| 39091.0 | 1.523 |
| 39092.0 | 1.513 |
| 39093.0 | 1.531 |
| 39094.0 | 1.534 |
| 39097.0 | 1.537 |
| 39098.0 | 1.532 |
| 39099.0 | 1.527 |
| 39100.0 | 1.524 |
| 39101.0 | 1.533 |
| 39104.0 | 1.525 |
| 39105.0 | 1.525 |
| 39106.0 | 1.537 |
| 39107.0 | 1.534 |
| 39108.0 | 1.527 |
| 39111.0 | 1.532 |
| 39112.0 | 1.538 |
| 39113.0 | 1.534 |
| 39114.0 | 1.542 |
| 39115.0 | 1.546 |
| 39118.0 | 1.546 |
| 39119.0 | 1.547 |
| 39120.0 | 1.552 |
| 39121.0 | 1.546 |
| 39122.0 | 1.551 |
| 39125.0 | 1.543 |
| 39126.0 | 1.549 |
| 39127.0 | 1.555 |
| 39128.0 | 1.553 |
| 39129.0 | 1.551 |
| 39132.0 | 1.555 |
| 39133.0 | 1.551 |
| 39134.0 | 1.547 |
| 39135.0 | 1.549 |
| 39136.0 | 1.55 |
| 39139.0 | 1.557 |
| 39140.0 | 1.529 |
| 39141.0 | 1.512 |
| 39142.0 | 1.499 |
| 39143.0 | 1.494 |
| 39146.0 | 1.486 |
| 39147.0 | 1.493 |
| 39148.0 | 1.496 |
| 39149.0 | 1.511 |
| 39150.0 | 1.513 |
| 39153.0 | 1.507 |
| 39154.0 | 1.495 |
| 39155.0 | 1.467 |
| 39156.0 | 1.487 |
| 39157.0 | 1.487 |
| 39160.0 | 1.505 |
| 39161.0 | 1.51 |
| 39162.0 | 1.51 |
| 39163.0 | 1.532 |
| 39164.0 | 1.538 |
| 39167.0 | 1.526 |
| 39168.0 | 1.528 |
| 39169.0 | 1.522 |
| 39170.0 | 1.535 |
| 39171.0 | 1.535 |
| 39174.0 | 1.537 |
| 39175.0 | 1.55 |
| 39176.0 | 1.554 |
| 39177.0 | 1.556 |
| 39182.0 | 1.563 |
| 39183.0 | 1.561 |
| 39184.0 | 1.558 |
| 39185.0 | 1.567 |
| 39188.0 | 1.581 |
| 39189.0 | 1.582 |
| 39190.0 | 1.577 |
| 39191.0 | 1.572 |
| 39192.0 | 1.59 |
| 39195.0 | 1.586 |
| 39196.0 | 1.579 |
| 39197.0 | 1.587 |
| 39198.0 | 1.589 |
| 39199.0 | 1.582 |
| 39202.0 | 1.584 |
| 39203.0 | 1.584 |
| 39204.0 | 1.59 |
| 39205.0 | 1.592 |
| 39206.0 | 1.596 |
| 39209.0 | 1.595 |
| 39210.0 | 1.589 |
| 39211.0 | 1.592 |
| 39212.0 | 1.584 |
| 39213.0 | 1.591 |
| 39216.0 | 1.589 |
| 39217.0 | 1.595 |
| 39218.0 | 1.591 |
| 39219.0 | 1.593 |
| 39220.0 | 1.604 |
| 39223.0 | 1.601 |
| 39224.0 | 1.602 |
| 39225.0 | 1.608 |
| 39226.0 | 1.598 |
| 39227.0 | 1.6 |
| 39230.0 | 1.603 |
| 39231.0 | 1.603 |
| 39232.0 | 1.602 |
| 39233.0 | 1.611 |
| 39234.0 | 1.621 |
| 39237.0 | 1.617 |
| 39238.0 | 1.611 |
| 39239.0 | 1.594 |
| 39240.0 | 1.582 |
| 39241.0 | 1.581 |
| 39244.0 | 1.59 |
| 39245.0 | 1.582 |
| 39246.0 | 1.586 |
| 39247.0 | 1.605 |
| 39251.0 | 1.615 |
| 39252.0 | 1.615 |
| 39254.0 | 1.606 |
| 39255.0 | 1.604 |
| 39258.0 | 1.602 |
| 39259.0 | 1.594 |
| 39260.0 | 1.589 |
| 39261.0 | 1.599 |
| 39262.0 | 1.606 |
| 39265.0 | 1.602 |
| 39266.0 | 1.611 |
| 39267.0 | 1.614 |
| 39268.0 | 1.607 |
| 39269.0 | 1.614 |
| 39272.0 | 1.615 |
| 39273.0 | 1.603 |
| 39274.0 | 1.597 |
| 39275.0 | 1.612 |
| 39276.0 | 1.618 |
| 39279.0 | 1.621 |
| 39280.0 | 1.617 |
| 39281.0 | 1.602 |
| 39282.0 | 1.614 |
| 39283.0 | 1.596 |
| 39286.0 | 1.605 |
| 39287.0 | 1.589 |
| 39288.0 | 1.577 |
| 39289.0 | 1.552 |
| 39290.0 | 1.55 |
| 39293.0 | 1.549 |
| 39294.0 | 1.567 |
| 39295.0 | 1.548 |
| 39296.0 | 1.56 |
| 39297.0 | 1.546 |
| 39300.0 | 1.54 |
| 39301.0 | 1.558 |
| 39302.0 | 1.578 |
| 39303.0 | 1.557 |
| 39307.0 | 1.553 |
| 39308.0 | 1.538 |
| 39309.0 | 1.535 |
| 39310.0 | 1.506 |
| 39311.0 | 1.529 |
| 39314.0 | 1.533 |
| 39315.0 | 1.534 |
| 39316.0 | 1.546 |
| 39317.0 | 1.546 |
| 39318.0 | 1.549 |
| 39321.0 | 1.549 |
| 39322.0 | 1.533 |
| 39323.0 | 1.538 |
| 39324.0 | 1.55 |
| 39325.0 | 1.562 |
| 39328.0 | 1.562 |
| 39329.0 | 1.569 |
| 39330.0 | 1.548 |
| 39331.0 | 1.553 |
| 39332.0 | 1.531 |
| 39335.0 | 1.524 |
| 39336.0 | 1.539 |
| 39337.0 | 1.542 |
| 39338.0 | 1.551 |
| 39339.0 | 1.545 |
| 39342.0 | 1.536 |
| 39343.0 | 1.555 |
| 39344.0 | 1.584 |
| 39345.0 | 1.578 |
| 39346.0 | 1.579 |
| 39350.0 | 1.57 |
| 39351.0 | 1.578 |
| 39352.0 | 1.584 |
| 39353.0 | 1.582 |
| 39356.0 | 1.588 |
| 39358.0 | 1.591 |
| 39359.0 | 1.591 |
| 39360.0 | 1.599 |
| 39363.0 | 1.594 |
| 39364.0 | 1.597 |
| 39365.0 | 1.596 |
| 39366.0 | 1.603 |
| 39370.0 | 1.594 |
| 39371.0 | 1.591 |
| 39372.0 | 1.596 |
| 39373.0 | 1.591 |
| 39374.0 | 1.589 |
| 39377.0 | 1.576 |
| 39378.0 | 1.581 |
| 39379.0 | 1.576 |
| 39380.0 | 1.589 |
| 39381.0 | 1.595 |
| 39385.0 | 1.6 |
| 39386.0 | 1.606 |
| 39387.0 | 1.59 |
| 39391.0 | 1.584 |
| 39392.0 | 1.588 |
| 39394.0 | 1.578 |
| 39395.0 | 1.563 |
| 39398.0 | 1.564 |
| 39399.0 | 1.566 |
| 39400.0 | 1.572 |
| 39401.0 | 1.563 |
| 39402.0 | 1.559 |
| 39405.0 | 1.546 |
| 39406.0 | 1.558 |
| 39407.0 | 1.538 |
| 39408.0 | 1.542 |
| 39409.0 | 1.556 |
| 39412.0 | 1.549 |
| 39413.0 | 1.545 |
| 39414.0 | 1.568 |
| 39415.0 | 1.574 |
| 39416.0 | 1.585 |
| 39420.0 | 1.572 |
| 39421.0 | 1.588 |
| 39422.0 | 1.589 |
| 39423.0 | 1.597 |
| 39426.0 | 1.601 |
| 39427.0 | 1.597 |
| 39428.0 | 1.602 |
| 39429.0 | 1.579 |
| 39430.0 | 1.583 |
| 39433.0 | 1.566 |
| 39434.0 | 1.565 |
| 39435.0 | 1.563 |
| 39436.0 | 1.566 |
| 39440.0 | 1.583 |
| 39443.0 | 1.587 |
| 39444.0 | 1.587 |
| 39447.0 | 1.586 |
| 39449.0 | 1.572 |
| 39450.0 | 1.571 |
| 39451.0 | 1.556 |
| 39454.0 | 1.559 |
| 39455.0 | 1.562 |
| 39456.0 | 1.553 |
| 39457.0 | 1.548 |
| 39458.0 | 1.546 |
| 39461.0 | 1.548 |
| 39462.0 | 1.525 |
| 39463.0 | 1.517 |
| 39464.0 | 1.507 |
| 39465.0 | 1.49 |
| 39468.0 | 1.414 |
| 39469.0 | 1.427 |
| 39470.0 | 1.379 |
| 39471.0 | 1.442 |
| 39472.0 | 1.433 |
| 39476.0 | 1.442 |
| 39477.0 | 1.437 |
| 39478.0 | 1.438 |
| 39479.0 | 1.457 |
| 39482.0 | 1.457 |
| 39483.0 | 1.417 |
| 39484.0 | 1.429 |
| 39485.0 | 1.413 |
| 39486.0 | 1.413 |
| 39489.0 | 1.407 |
| 39490.0 | 1.44 |
| 39491.0 | 1.44 |
| 39492.0 | 1.439 |
| 39493.0 | 1.418 |
| 39496.0 | 1.438 |
| 39497.0 | 1.441 |
| 39498.0 | 1.428 |
| 39499.0 | 1.434 |
| 39500.0 | 1.423 |
| 39503.0 | 1.439 |
| 39504.0 | 1.454 |
| 39505.0 | 1.454 |
| 39506.0 | 1.435 |
| 39507.0 | 1.419 |
| 39510.0 | 1.406 |
| 39511.0 | 1.388 |
| 39512.0 | 1.409 |
| 39513.0 | 1.39 |
| 39514.0 | 1.379 |
| 39517.0 | 1.37 |
| 39518.0 | 1.387 |
| 39519.0 | 1.399 |
| 39520.0 | 1.385 |
| 39521.0 | 1.376 |
| 39524.0 | 1.338 |
| 39525.0 | 1.374 |
| 39526.0 | 1.366 |
| 39527.0 | 1.359 |
| 39532.0 | 1.394 |
| 39533.0 | 1.389 |
| 39534.0 | 1.4 |
| 39535.0 | 1.397 |
| 39538.0 | 1.393 |
| 39539.0 | 1.427 |
| 39540.0 | 1.439 |
| 39541.0 | 1.433 |
| 39542.0 | 1.438 |
| 39545.0 | 1.447 |
| 39546.0 | 1.442 |
| 39547.0 | 1.433 |
| 39548.0 | 1.428 |
| 39549.0 | 1.413 |
| 39552.0 | 1.405 |
| 39553.0 | 1.41 |
| 39554.0 | 1.426 |
| 39555.0 | 1.42 |
| 39556.0 | 1.442 |
| 39559.0 | 1.431 |
| 39560.0 | 1.422 |
| 39561.0 | 1.43 |
| 39562.0 | 1.429 |
| 39563.0 | 1.438 |
| 39566.0 | 1.443 |
| 39567.0 | 1.438 |
| 39568.0 | 1.446 |
| 39569.0 | 1.446 |
| 39570.0 | 1.46 |
| 39573.0 | 1.458 |
| 39574.0 | 1.451 |
| 39575.0 | 1.458 |
| 39576.0 | 1.454 |
| 39577.0 | 1.44 |
| 39580.0 | 1.443 |
| 39581.0 | 1.444 |
| 39582.0 | 1.454 |
| 39583.0 | 1.454 |
| 39584.0 | 1.456 |
| 39587.0 | 1.461 |
| 39588.0 | 1.445 |
| 39589.0 | 1.438 |
| 39590.0 | 1.438 |
| 39591.0 | 1.42 |
| 39594.0 | 1.419 |
| 39595.0 | 1.416 |
| 39596.0 | 1.424 |
| 39597.0 | 1.427 |
| 39598.0 | 1.434 |
| 39601.0 | 1.418 |
| 39602.0 | 1.423 |
| 39603.0 | 1.413 |
| 39604.0 | 1.408 |
| 39605.0 | 1.384 |
| 39608.0 | 1.385 |
| 39609.0 | 1.378 |
| 39610.0 | 1.36 |
| 39611.0 | 1.369 |
| 39612.0 | 1.375 |
| 39615.0 | 1.367 |
| 39616.0 | 1.373 |
| 39617.0 | 1.359 |
| 39618.0 | 1.353 |
| 39619.0 | 1.336 |
| 39622.0 | 1.336 |
| 39623.0 | 1.33 |
| 39624.0 | 1.346 |
| 39625.0 | 1.318 |
| 39626.0 | 1.311 |
| 39629.0 | 1.314 |
| 39630.0 | 1.296 |
| 39631.0 | 1.295 |
| 39632.0 | 1.308 |
| 39633.0 | 1.291 |
| 39636.0 | 1.308 |
| 39637.0 | 1.295 |
| 39638.0 | 1.311 |
| 39639.0 | 1.293 |
| 39640.0 | 1.267 |
| 39643.0 | 1.273 |
| 39644.0 | 1.25 |
| 39645.0 | 1.26 |
| 39646.0 | 1.285 |
| 39647.0 | 1.305 |
| 39650.0 | 1.309 |
| 39651.0 | 1.306 |
| 39652.0 | 1.325 |
| 39653.0 | 1.315 |
| 39654.0 | 1.314 |
| 39657.0 | 1.302 |
| 39658.0 | 1.306 |
| 39659.0 | 1.319 |
| 39660.0 | 1.319 |
| 39661.0 | 1.303 |
| 39664.0 | 1.295 |
| 39665.0 | 1.322 |
| 39666.0 | 1.331 |
| 39667.0 | 1.327 |
| 39668.0 | 1.331 |
| 39671.0 | 1.342 |
| 39672.0 | 1.339 |
| 39673.0 | 1.315 |
| 39674.0 | 1.315 |
| 39675.0 | 1.319 |
| 39678.0 | 1.318 |
| 39679.0 | 1.292 |
| 39680.0 | 1.297 |
| 39681.0 | 1.283 |
| 39682.0 | 1.302 |
| 39685.0 | 1.292 |
| 39686.0 | 1.298 |
| 39687.0 | 1.298 |
| 39688.0 | 1.316 |
| 39689.0 | 1.318 |
| 39692.0 | 1.318 |
| 39693.0 | 1.333 |
| 39694.0 | 1.319 |
| 39695.0 | 1.291 |
| 39696.0 | 1.263 |
| 39699.0 | 1.294 |
| 39700.0 | 1.287 |
| 39701.0 | 1.281 |
| 39702.0 | 1.274 |
| 39703.0 | 1.292 |
| 39706.0 | 1.252 |
| 39707.0 | 1.232 |
| 39708.0 | 1.209 |
| 39709.0 | 1.203 |
| 39710.0 | 1.284 |
| 39713.0 | 1.262 |
| 39714.0 | 1.249 |
| 39715.0 | 1.242 |
| 39716.0 | 1.27 |
| 39717.0 | 1.254 |
| 39720.0 | 1.206 |
| 39721.0 | 1.216 |
| 39722.0 | 1.225 |
| 39723.0 | 1.206 |
| 39724.0 | 1.24 |
| 39727.0 | 1.158 |
| 39728.0 | 1.162 |
| 39729.0 | 1.096 |
| 39730.0 | 1.071 |
| 39731.0 | 0.989 |
| 39734.0 | 1.093 |
| 39735.0 | 1.118 |
| 39736.0 | 1.051 |
| 39737.0 | 0.99 |
| 39738.0 | 1.034 |
| 39741.0 | 1.065 |
| 39742.0 | 1.06 |
| 39743.0 | 1.004 |
| 39744.0 | 1.001 |
| 39745.0 | 0.952 |
| 39748.0 | 0.934 |
| 39749.0 | 0.972 |
| 39750.0 | 1.027 |
| 39751.0 | 1.032 |
| 39752.0 | 1.057 |
| 39755.0 | 1.064 |
| 39756.0 | 1.118 |
| 39757.0 | 1.102 |
| 39758.0 | 1.037 |
| 39759.0 | 1.061 |
| 39762.0 | 1.07 |
| 39763.0 | 1.014 |
| 39764.0 | 0.98 |
| 39765.0 | 0.992 |
| 39766.0 | 1.003 |
| 39769.0 | 0.965 |
| 39770.0 | 0.976 |
| 39771.0 | 0.935 |
| 39772.0 | 0.905 |
| 39773.0 | 0.877 |
| 39776.0 | 0.972 |
| 39777.0 | 0.974 |
| 39778.0 | 0.969 |
| 39779.0 | 0.992 |
| 39780.0 | 0.992 |
| 39783.0 | 0.932 |
| 39784.0 | 0.961 |
| 39785.0 | 0.967 |
| 39786.0 | 0.967 |
| 39787.0 | 0.916 |
| 39790.0 | 1 |
| 39791.0 | 1.013 |
| 39792.0 | 1.019 |
| 39793.0 | 1.015 |
| 39794.0 | 0.988 |
| 39797.0 | 0.983 |
| 39798.0 | 1.001 |
| 39799.0 | 0.998 |
| 39800.0 | 1.002 |
| 39801.0 | 0.998 |
| 39804.0 | 0.979 |
| 39805.0 | 0.972 |
| 39806.0 | 0.97 |
| 39812.0 | 1.001 |
| 39813.0 | 1 |
| 39815.0 | 1.035 |
| 39818.0 | 1.042 |
| 39819.0 | 1.052 |
| 39820.0 | 1.036 |
| 39821.0 | 1.027 |
| 39822.0 | 1.015 |
| 39825.0 | 1.001 |
| 39826.0 | 0.985 |
| 39827.0 | 0.937 |
| 39828.0 | 0.919 |
| 39829.0 | 0.929 |
| 39832.0 | 0.916 |
| 39833.0 | 0.893 |
| 39834.0 | 0.888 |
| 39835.0 | 0.875 |
| 39836.0 | 0.869 |
| 39839.0 | 0.905 |
| 39840.0 | 0.904 |
| 39841.0 | 0.947 |
| 39842.0 | 0.924 |
| 39843.0 | 0.91 |
| 39846.0 | 0.892 |
| 39847.0 | 0.913 |
| 39848.0 | 0.936 |
| 39849.0 | 0.934 |
| 39850.0 | 0.956 |
| 39853.0 | 0.958 |
| 39854.0 | 0.923 |
| 39855.0 | 0.923 |
| 39856.0 | 0.9 |
| 39857.0 | 0.906 |
| 39860.0 | 0.89 |
| 39861.0 | 0.856 |
| 39862.0 | 0.855 |
| 39863.0 | 0.853 |
| 39864.0 | 0.803 |
| 39867.0 | 0.793 |
| 39868.0 | 0.786 |
| 39869.0 | 0.78 |
| 39870.0 | 0.808 |
| 39871.0 | 0.786 |
| 39874.0 | 0.737 |
| 39875.0 | 0.728 |
| 39876.0 | 0.769 |
| 39877.0 | 0.721 |
| 39878.0 | 0.702 |
| 39881.0 | 0.698 |
| 39882.0 | 0.757 |
| 39883.0 | 0.763 |
| 39884.0 | 0.779 |
| 39885.0 | 0.782 |
| 39888.0 | 0.814 |
| 39889.0 | 0.804 |
| 39890.0 | 0.807 |
| 39891.0 | 0.817 |
| 39892.0 | 0.823 |
| 39895.0 | 0.857 |
| 39896.0 | 0.859 |
| 39897.0 | 0.87 |
| 39898.0 | 0.873 |
| 39899.0 | 0.855 |
| 39902.0 | 0.803 |
| 39903.0 | 0.833 |
| 39904.0 | 0.845 |
| 39905.0 | 0.9 |
| 39906.0 | 0.892 |
| 39909.0 | 0.884 |
| 39910.0 | 0.877 |
| 39911.0 | 0.887 |
| 39912.0 | 0.914 |
| 39917.0 | 0.928 |
| 39918.0 | 0.921 |
| 39919.0 | 0.938 |
| 39920.0 | 0.955 |
| 39923.0 | 0.915 |
| 39924.0 | 0.913 |
| 39925.0 | 0.931 |
| 39926.0 | 0.92 |
| 39927.0 | 0.946 |
| 39930.0 | 0.945 |
| 39931.0 | 0.929 |
| 39932.0 | 0.952 |
| 39933.0 | 0.97 |
| 39934.0 | 0.97 |
| 39937.0 | 0.988 |
| 39938.0 | 0.983 |
| 39939.0 | 0.995 |
| 39940.0 | 0.982 |
| 39941.0 | 1.006 |
| 39944.0 | 0.994 |
| 39945.0 | 0.99 |
| 39946.0 | 0.962 |
| 39947.0 | 0.96 |
| 39948.0 | 0.965 |
| 39951.0 | 0.989 |
| 39952.0 | 1.004 |
| 39953.0 | 1.016 |
| 39954.0 | 0.99 |
| 39955.0 | 0.994 |
| 39958.0 | 0.997 |
| 39959.0 | 1.008 |
| 39960.0 | 1.012 |
| 39961.0 | 1.002 |
| 39962.0 | 1.001 |
| 39965.0 | 1.036 |
| 39966.0 | 1.034 |
| 39967.0 | 1.014 |
| 39968.0 | 1.016 |
| 39969.0 | 1.022 |
| 39972.0 | 1.008 |
| 39973.0 | 1.012 |
| 39974.0 | 1.021 |
| 39975.0 | 1.03 |
| 39976.0 | 1.024 |
| 39979.0 | 0.993 |
| 39980.0 | 0.991 |
| 39981.0 | 0.973 |
| 39982.0 | 0.986 |
| 39983.0 | 0.994 |
| 39986.0 | 0.963 |
| 39987.0 | 0.96 |
| 39988.0 | 0.988 |
| 39989.0 | 0.981 |
| 39990.0 | 0.976 |
| 39993.0 | 0.996 |
| 39994.0 | 0.981 |
| 39995.0 | 1 |
| 39996.0 | 0.967 |
| 39997.0 | 0.97 |
| 40000.0 | 0.956 |
| 40001.0 | 0.946 |
| 40002.0 | 0.934 |
| 40003.0 | 0.943 |
| 40004.0 | 0.929 |
| 40007.0 | 0.957 |
| 40008.0 | 0.968 |
| 40009.0 | 1.001 |
| 40010.0 | 1.004 |
| 40011.0 | 1.008 |
| 40014.0 | 1.021 |
| 40015.0 | 1.029 |
| 40016.0 | 1.032 |
| 40017.0 | 1.054 |
| 40018.0 | 1.053 |
| 40021.0 | 1.061 |
| 40022.0 | 1.05 |
| 40023.0 | 1.06 |
| 40024.0 | 1.081 |
| 40025.0 | 1.075 |
| 40028.0 | 1.088 |
| 40029.0 | 1.087 |
| 40030.0 | 1.076 |
| 40031.0 | 1.084 |
| 40032.0 | 1.1 |
| 40035.0 | 1.095 |
| 40036.0 | 1.079 |
| 40037.0 | 1.093 |
| 40038.0 | 1.1 |
| 40039.0 | 1.086 |
| 40042.0 | 1.061 |
| 40043.0 | 1.072 |
| 40044.0 | 1.069 |
| 40045.0 | 1.084 |
| 40046.0 | 1.114 |
| 40049.0 | 1.126 |
| 40050.0 | 1.134 |
| 40051.0 | 1.13 |
| 40052.0 | 1.126 |
| 40053.0 | 1.135 |
| 40056.0 | 1.125 |
| 40057.0 | 1.104 |
| 40058.0 | 1.099 |
| 40059.0 | 1.097 |
| 40060.0 | 1.114 |
| 40063.0 | 1.128 |
| 40064.0 | 1.129 |
| 40065.0 | 1.141 |
| 40066.0 | 1.14 |
| 40067.0 | 1.145 |
| 40070.0 | 1.144 |
| 40071.0 | 1.149 |
| 40072.0 | 1.163 |
| 40073.0 | 1.168 |
| 40074.0 | 1.165 |
| 40077.0 | 1.16 |
| 40078.0 | 1.163 |
| 40079.0 | 1.165 |
| 40080.0 | 1.148 |
| 40081.0 | 1.145 |
| 40084.0 | 1.169 |
| 40085.0 | 1.167 |
| 40086.0 | 1.16 |
| 40087.0 | 1.138 |
| 40088.0 | 1.12 |
| 40091.0 | 1.131 |
| 40092.0 | 1.157 |
| 40093.0 | 1.153 |
| 40094.0 | 1.165 |
| 40095.0 | 1.163 |
| 40098.0 | 1.174 |
| 40099.0 | 1.162 |
| 40100.0 | 1.187 |
| 40101.0 | 1.183 |
| 40102.0 | 1.167 |
| 40105.0 | 1.185 |
| 40106.0 | 1.178 |
| 40107.0 | 1.182 |
| 40108.0 | 1.17 |
| 40109.0 | 1.164 |
| 40112.0 | 1.146 |
| 40113.0 | 1.147 |
| 40114.0 | 1.126 |
| 40115.0 | 1.143 |
| 40116.0 | 1.114 |
| 40119.0 | 1.121 |
| 40120.0 | 1.102 |
| 40121.0 | 1.121 |
| 40122.0 | 1.132 |
| 40123.0 | 1.132 |
| 40126.0 | 1.155 |
| 40127.0 | 1.154 |
| 40128.0 | 1.163 |
| 40129.0 | 1.161 |
| 40130.0 | 1.163 |
| 40133.0 | 1.178 |
| 40134.0 | 1.172 |
| 40135.0 | 1.172 |
| 40136.0 | 1.155 |
| 40137.0 | 1.146 |
| 40140.0 | 1.169 |
| 40141.0 | 1.161 |
| 40142.0 | 1.168 |
| 40143.0 | 1.134 |
| 40144.0 | 1.145 |
| 40147.0 | 1.133 |
| 40148.0 | 1.159 |
| 40149.0 | 1.162 |
| 40150.0 | 1.161 |
| 40151.0 | 1.173 |
| 40154.0 | 1.168 |
| 40155.0 | 1.151 |
| 40156.0 | 1.141 |
| 40157.0 | 1.152 |
| 40158.0 | 1.156 |
| 40161.0 | 1.164 |
| 40162.0 | 1.165 |
| 40163.0 | 1.178 |
| 40164.0 | 1.166 |
| 40165.0 | 1.159 |
| 40168.0 | 1.178 |
| 40169.0 | 1.185 |
| 40170.0 | 1.189 |
| 40171.0 | 1.189 |
| 40175.0 | 1.197 |
| 40176.0 | 1.2 |
| 40177.0 | 1.192 |
| 40178.0 | 1.191 |
| 40182.0 | 1.209 |
| 40183.0 | 1.207 |
| 40184.0 | 1.206 |
| 40185.0 | 1.206 |
| 40186.0 | 1.209 |
| 40189.0 | 1.206 |
| 40190.0 | 1.195 |
| 40191.0 | 1.196 |
| 40192.0 | 1.2 |
| 40193.0 | 1.183 |
| 40196.0 | 1.189 |
| 40197.0 | 1.198 |
| 40198.0 | 1.174 |
| 40199.0 | 1.156 |
| 40200.0 | 1.147 |
| 40203.0 | 1.137 |
| 40204.0 | 1.144 |
| 40205.0 | 1.13 |
| 40206.0 | 1.111 |
| 40207.0 | 1.126 |
| 40210.0 | 1.132 |
| 40211.0 | 1.145 |
| 40212.0 | 1.136 |
| 40213.0 | 1.1 |
| 40214.0 | 1.072 |
| 40217.0 | 1.084 |
| 40218.0 | 1.086 |
| 40219.0 | 1.098 |
| 40220.0 | 1.09 |
| 40221.0 | 1.088 |
| 40224.0 | 1.092 |
| 40225.0 | 1.105 |
| 40226.0 | 1.12 |
| 40227.0 | 1.126 |
| 40228.0 | 1.132 |
| 40231.0 | 1.126 |
| 40232.0 | 1.109 |
| 40233.0 | 1.111 |
| 40234.0 | 1.092 |
| 40235.0 | 1.108 |
| 40238.0 | 1.124 |
| 40239.0 | 1.128 |
| 40240.0 | 1.142 |
| 40241.0 | 1.14 |
| 40242.0 | 1.161 |
| 40245.0 | 1.162 |
| 40246.0 | 1.162 |
| 40247.0 | 1.172 |
| 40248.0 | 1.168 |
| 40249.0 | 1.169 |
| 40252.0 | 1.159 |
| 40253.0 | 1.171 |
| 40254.0 | 1.18 |
| 40255.0 | 1.174 |
| 40256.0 | 1.168 |
| 40259.0 | 1.166 |
| 40260.0 | 1.173 |
| 40261.0 | 1.169 |
| 40262.0 | 1.183 |
| 40263.0 | 1.183 |
| 40266.0 | 1.185 |
| 40267.0 | 1.183 |
| 40268.0 | 1.18 |
| 40269.0 | 1.196 |
| 40274.0 | 1.2 |
| 40275.0 | 1.195 |
| 40276.0 | 1.184 |
| 40277.0 | 1.201 |
| 40280.0 | 1.204 |
| 40281.0 | 1.199 |
| 40282.0 | 1.206 |
| 40283.0 | 1.207 |
| 40284.0 | 1.186 |
| 40287.0 | 1.183 |
| 40288.0 | 1.198 |
| 40289.0 | 1.185 |
| 40290.0 | 1.168 |
| 40291.0 | 1.175 |
| 40294.0 | 1.185 |
| 40295.0 | 1.148 |
| 40296.0 | 1.13 |
| 40297.0 | 1.144 |
| 40298.0 | 1.14 |
| 40301.0 | 1.14 |
| 40302.0 | 1.101 |
| 40303.0 | 1.09 |
| 40304.0 | 1.064 |
| 40305.0 | 1.021 |
| 40308.0 | 1.119 |
| 40309.0 | 1.109 |
| 40310.0 | 1.121 |
| 40311.0 | 1.121 |
| 40312.0 | 1.073 |
| 40315.0 | 1.073 |
| 40316.0 | 1.097 |
| 40317.0 | 1.067 |
| 40318.0 | 1.048 |
| 40319.0 | 1.05 |
| 40322.0 | 1.044 |
| 40323.0 | 1.016 |
| 40324.0 | 1.033 |
| 40325.0 | 1.067 |
| 40326.0 | 1.065 |
| 40329.0 | 1.064 |
| 40330.0 | 1.062 |
| 40331.0 | 1.061 |
| 40332.0 | 1.073 |
| 40333.0 | 1.042 |
| 40336.0 | 1.033 |
| 40337.0 | 1.025 |
| 40338.0 | 1.043 |
| 40339.0 | 1.063 |
| 40340.0 | 1.075 |
| 40343.0 | 1.092 |
| 40344.0 | 1.104 |
| 40345.0 | 1.105 |
| 40346.0 | 1.108 |
| 40347.0 | 1.111 |
| 40350.0 | 1.123 |
| 40351.0 | 1.115 |
| 40352.0 | 1.099 |
| 40353.0 | 1.077 |
| 40354.0 | 1.071 |
| 40357.0 | 1.086 |
| 40358.0 | 1.043 |
| 40359.0 | 1.05 |
| 40360.0 | 1.028 |
| 40361.0 | 1.03 |
| 40364.0 | 1.024 |
| 40365.0 | 1.052 |
| 40366.0 | 1.073 |
| 40367.0 | 1.085 |
| 40368.0 | 1.091 |
| 40371.0 | 1.093 |
| 40372.0 | 1.112 |
| 40373.0 | 1.112 |
| 40374.0 | 1.099 |
| 40375.0 | 1.077 |
| 40378.0 | 1.073 |
| 40379.0 | 1.07 |
| 40380.0 | 1.075 |
| 40381.0 | 1.103 |
| 40382.0 | 1.105 |
| 40385.0 | 1.114 |
| 40386.0 | 1.123 |
| 40387.0 | 1.122 |
| 40388.0 | 1.117 |
| 40389.0 | 1.113 |
| 40392.0 | 1.142 |
| 40393.0 | 1.141 |
| 40394.0 | 1.143 |
| 40395.0 | 1.141 |
| 40396.0 | 1.127 |
| 40399.0 | 1.144 |
| 40400.0 | 1.134 |
| 40401.0 | 1.107 |
| 40402.0 | 1.105 |
| 40403.0 | 1.101 |
| 40406.0 | 1.097 |
| 40407.0 | 1.112 |
| 40408.0 | 1.108 |
| 40409.0 | 1.088 |
| 40410.0 | 1.077 |
| 40413.0 | 1.083 |
| 40414.0 | 1.066 |
| 40415.0 | 1.055 |
| 40416.0 | 1.063 |
| 40417.0 | 1.072 |
| 40420.0 | 1.066 |
| 40421.0 | 1.069 |
| 40422.0 | 1.103 |
| 40423.0 | 1.103 |
| 40424.0 | 1.115 |
| 40427.0 | 1.117 |
| 40428.0 | 1.108 |
| 40429.0 | 1.117 |
| 40430.0 | 1.128 |
| 40431.0 | 1.127 |
| 40434.0 | 1.136 |
| 40435.0 | 1.136 |
| 40436.0 | 1.132 |
| 40437.0 | 1.129 |
| 40438.0 | 1.119 |
| 40441.0 | 1.135 |
| 40442.0 | 1.132 |
| 40443.0 | 1.117 |
| 40444.0 | 1.112 |
| 40445.0 | 1.131 |
| 40448.0 | 1.126 |
| 40449.0 | 1.125 |
| 40450.0 | 1.117 |
| 40451.0 | 1.115 |
| 40452.0 | 1.11 |
| 40455.0 | 1.098 |
| 40456.0 | 1.119 |
| 40457.0 | 1.127 |
| 40458.0 | 1.129 |
| 40459.0 | 1.129 |
| 40462.0 | 1.13 |
| 40463.0 | 1.125 |
| 40464.0 | 1.148 |
| 40465.0 | 1.147 |
| 40466.0 | 1.149 |
| 40469.0 | 1.152 |
| 40470.0 | 1.147 |
| 40471.0 | 1.152 |
| 40472.0 | 1.163 |
| 40473.0 | 1.16 |
| 40476.0 | 1.159 |
| 40477.0 | 1.154 |
| 40478.0 | 1.145 |
| 40479.0 | 1.15 |
| 40480.0 | 1.15 |
| 40483.0 | 1.147 |
| 40484.0 | 1.156 |
| 40485.0 | 1.145 |
| 40486.0 | 1.164 |
| 40487.0 | 1.161 |
| 40490.0 | 1.158 |
| 40491.0 | 1.166 |
| 40492.0 | 1.15 |
| 40493.0 | 1.145 |
| 40494.0 | 1.142 |
| 40497.0 | 1.151 |
| 40498.0 | 1.128 |
| 40499.0 | 1.135 |
| 40500.0 | 1.154 |
| 40501.0 | 1.15 |
| 40504.0 | 1.138 |
| 40505.0 | 1.112 |
| 40506.0 | 1.119 |
| 40507.0 | 1.122 |
| 40508.0 | 1.111 |
| 40511.0 | 1.087 |
| 40512.0 | 1.079 |
| 40513.0 | 1.106 |
| 40514.0 | 1.127 |
| 40515.0 | 1.128 |
| 40518.0 | 1.123 |
| 40519.0 | 1.135 |
| 40520.0 | 1.141 |
| 40521.0 | 1.149 |
| 40522.0 | 1.148 |
| 40525.0 | 1.154 |
| 40526.0 | 1.156 |
| 40527.0 | 1.145 |
| 40528.0 | 1.15 |
| 40529.0 | 1.142 |
| 40532.0 | 1.148 |
| 40533.0 | 1.161 |
| 40534.0 | 1.159 |
| 40535.0 | 1.157 |
| 40536.0 | 1.156 |
| 40539.0 | 1.143 |
| 40540.0 | 1.143 |
| 40541.0 | 1.149 |
| 40542.0 | 1.137 |
| 40543.0 | 1.132 |
| 40546.0 | 1.148 |
| 40547.0 | 1.15 |
| 40548.0 | 1.146 |
| 40549.0 | 1.147 |
| 40550.0 | 1.137 |
| 40553.0 | 1.12 |
| 40554.0 | 1.133 |
| 40555.0 | 1.162 |
| 40556.0 | 1.175 |
| 40557.0 | 1.176 |
| 40560.0 | 1.173 |
| 40561.0 | 1.185 |
| 40562.0 | 1.177 |
| 40563.0 | 1.179 |
| 40564.0 | 1.193 |
| 40567.0 | 1.196 |
| 40568.0 | 1.189 |
| 40569.0 | 1.192 |
| 40570.0 | 1.2 |
| 40571.0 | 1.188 |
| 40574.0 | 1.187 |
| 40575.0 | 1.205 |
| 40576.0 | 1.207 |
| 40577.0 | 1.202 |
| 40578.0 | 1.204 |
| 40581.0 | 1.213 |
| 40582.0 | 1.217 |
| 40583.0 | 1.214 |
| 40584.0 | 1.212 |
| 40585.0 | 1.211 |
| 40588.0 | 1.209 |
| 40589.0 | 1.213 |
| 40590.0 | 1.223 |
| 40591.0 | 1.224 |
| 40592.0 | 1.225 |
| 40595.0 | 1.207 |
| 40596.0 | 1.197 |
| 40597.0 | 1.188 |
| 40598.0 | 1.186 |
| 40599.0 | 1.198 |
| 40602.0 | 1.207 |
| 40603.0 | 1.197 |
| 40604.0 | 1.189 |
| 40605.0 | 1.193 |
| 40606.0 | 1.186 |
| 40609.0 | 1.18 |
| 40610.0 | 1.185 |
| 40611.0 | 1.181 |
| 40612.0 | 1.173 |
| 40613.0 | 1.164 |
| 40616.0 | 1.153 |
| 40617.0 | 1.128 |
| 40618.0 | 1.106 |
| 40619.0 | 1.129 |
| 40620.0 | 1.131 |
| 40623.0 | 1.156 |
| 40624.0 | 1.153 |
| 40625.0 | 1.157 |
| 40626.0 | 1.173 |
| 40627.0 | 1.173 |
| 40630.0 | 1.174 |
| 40631.0 | 1.173 |
| 40632.0 | 1.182 |
| 40633.0 | 1.173 |
| 40634.0 | 1.191 |
| 40637.0 | 1.188 |
| 40638.0 | 1.187 |
| 40639.0 | 1.194 |
| 40640.0 | 1.191 |
| 40641.0 | 1.198 |
| 40644.0 | 1.195 |
| 40645.0 | 1.18 |
| 40646.0 | 1.186 |
| 40647.0 | 1.175 |
| 40648.0 | 1.176 |
| 40651.0 | 1.151 |
| 40652.0 | 1.154 |
| 40653.0 | 1.177 |
| 40654.0 | 1.182 |
| 40659.0 | 1.188 |
| 40660.0 | 1.196 |
| 40661.0 | 1.205 |
| 40662.0 | 1.207 |
| 40665.0 | 1.206 |
| 40666.0 | 1.203 |
| 40667.0 | 1.187 |
| 40668.0 | 1.178 |
| 40669.0 | 1.187 |
| 40672.0 | 1.17 |
| 40673.0 | 1.183 |
| 40674.0 | 1.184 |
| 40675.0 | 1.175 |
| 40676.0 | 1.167 |
| 40679.0 | 1.163 |
| 40680.0 | 1.152 |
| 40681.0 | 1.158 |
| 40682.0 | 1.166 |
| 40683.0 | 1.153 |
| 40686.0 | 1.132 |
| 40687.0 | 1.135 |
| 40688.0 | 1.14 |
| 40689.0 | 1.134 |
| 40690.0 | 1.141 |
| 40693.0 | 1.139 |
| 40694.0 | 1.156 |
| 40695.0 | 1.144 |
| 40696.0 | 1.128 |
| 40697.0 | 1.13 |
| 40700.0 | 1.122 |
| 40701.0 | 1.125 |
| 40702.0 | 1.117 |
| 40703.0 | 1.126 |
| 40704.0 | 1.11 |
| 40707.0 | 1.11 |
| 40708.0 | 1.127 |
| 40709.0 | 1.109 |
| 40710.0 | 1.109 |
| 40711.0 | 1.123 |
| 40714.0 | 1.115 |
| 40715.0 | 1.135 |
| 40716.0 | 1.132 |
| 40717.0 | 1.109 |
| 40718.0 | 1.104 |
| 40721.0 | 1.107 |
| 40722.0 | 1.116 |
| 40723.0 | 1.135 |
| 40724.0 | 1.151 |
| 40725.0 | 1.161 |
| 40728.0 | 1.159 |
| 40729.0 | 1.152 |
| 40730.0 | 1.146 |
| 40731.0 | 1.15 |
| 40732.0 | 1.131 |
| 40735.0 | 1.101 |
| 40736.0 | 1.095 |
| 40737.0 | 1.103 |
| 40738.0 | 1.096 |
| 40739.0 | 1.089 |
| 40742.0 | 1.069 |
| 40743.0 | 1.082 |
| 40744.0 | 1.1 |
| 40745.0 | 1.121 |
| 40746.0 | 1.124 |
| 40749.0 | 1.113 |
| 40750.0 | 1.112 |
| 40751.0 | 1.095 |
| 40752.0 | 1.095 |
| 40753.0 | 1.087 |
| 40756.0 | 1.057 |
| 40757.0 | 1.039 |
| 40758.0 | 1.02 |
| 40759.0 | 0.985 |
| 40760.0 | 0.97 |
| 40763.0 | 0.932 |
| 40764.0 | 0.935 |
| 40765.0 | 0.872 |
| 40766.0 | 0.9 |
| 40767.0 | 0.941 |
| 40770.0 | 0.948 |
| 40771.0 | 0.948 |
| 40772.0 | 0.951 |
| 40773.0 | 0.896 |
| 40774.0 | 0.874 |
| 40777.0 | 0.885 |
| 40778.0 | 0.893 |
| 40779.0 | 0.91 |
| 40780.0 | 0.9 |
| 40781.0 | 0.889 |
| 40784.0 | 0.911 |
| 40785.0 | 0.911 |
| 40786.0 | 0.938 |
| 40787.0 | 0.94 |
| 40788.0 | 0.902 |
| 40791.0 | 0.85 |
| 40792.0 | 0.837 |
| 40793.0 | 0.87 |
| 40794.0 | 0.876 |
| 40795.0 | 0.834 |
| 40798.0 | 0.795 |
| 40799.0 | 0.816 |
| 40800.0 | 0.838 |
| 40801.0 | 0.873 |
| 40802.0 | 0.874 |
| 40805.0 | 0.845 |
| 40806.0 | 0.865 |
| 40807.0 | 0.846 |
| 40808.0 | 0.795 |
| 40809.0 | 0.811 |
| 40812.0 | 0.838 |
| 40813.0 | 0.89 |
| 40814.0 | 0.882 |
| 40815.0 | 0.899 |
| 40816.0 | 0.884 |
| 40819.0 | 0.864 |
| 40820.0 | 0.842 |
| 40821.0 | 0.884 |
| 40822.0 | 0.915 |
| 40823.0 | 0.924 |
| 40826.0 | 0.946 |
| 40827.0 | 0.944 |
| 40828.0 | 0.968 |
| 40829.0 | 0.951 |
| 40830.0 | 0.961 |
| 40833.0 | 0.944 |
| 40834.0 | 0.94 |
| 40835.0 | 0.95 |
| 40836.0 | 0.925 |
| 40837.0 | 0.954 |
| 40840.0 | 0.967 |
| 40841.0 | 0.956 |
| 40842.0 | 0.952 |
| 40843.0 | 1.011 |
| 40844.0 | 1.006 |
| 40847.0 | 0.974 |
| 40848.0 | 0.92 |
| 40849.0 | 0.934 |
| 40850.0 | 0.958 |
| 40851.0 | 0.934 |
| 40854.0 | 0.927 |
| 40855.0 | 0.939 |
| 40856.0 | 0.915 |
| 40857.0 | 0.918 |
| 40858.0 | 0.948 |
| 40861.0 | 0.932 |
| 40862.0 | 0.917 |
| 40863.0 | 0.923 |
| 40864.0 | 0.912 |
| 40865.0 | 0.909 |
| 40868.0 | 0.875 |
| 40869.0 | 0.864 |
| 40870.0 | 0.845 |
| 40871.0 | 0.842 |
| 40872.0 | 0.852 |
| 40875.0 | 0.903 |
| 40876.0 | 0.908 |
| 40877.0 | 0.951 |
| 40878.0 | 0.943 |
| 40879.0 | 0.956 |
| 40882.0 | 0.967 |
| 40883.0 | 0.962 |
| 40884.0 | 0.957 |
| 40885.0 | 0.932 |
| 40886.0 | 0.956 |
| 40889.0 | 0.924 |
| 40890.0 | 0.92 |
| 40891.0 | 0.896 |
| 40892.0 | 0.904 |
| 40893.0 | 0.894 |
| 40896.0 | 0.894 |
| 40897.0 | 0.921 |
| 40898.0 | 0.913 |
| 40899.0 | 0.926 |
| 40900.0 | 0.933 |
| 40904.0 | 0.933 |
| 40905.0 | 0.918 |
| 40906.0 | 0.934 |
| 40907.0 | 0.945 |
| 40910.0 | 0.967 |
| 40911.0 | 0.976 |
| 40912.0 | 0.959 |
| 40913.0 | 0.944 |
| 40914.0 | 0.937 |
| 40917.0 | 0.931 |
| 40918.0 | 0.958 |
| 40919.0 | 0.954 |
| 40920.0 | 0.957 |
| 40921.0 | 0.954 |
| 40924.0 | 0.964 |
| 40925.0 | 0.979 |
| 40926.0 | 0.976 |
| 40927.0 | 0.994 |
| 40928.0 | 0.991 |
| 40931.0 | 0.997 |
| 40932.0 | 0.993 |
| 40933.0 | 0.989 |
| 40934.0 | 1.005 |
| 40935.0 | 0.995 |
| 40938.0 | 0.982 |
| 40939.0 | 0.987 |
| 40940.0 | 1.009 |
| 40941.0 | 1.012 |
| 40942.0 | 1.027 |
| 40945.0 | 1.024 |
| 40946.0 | 1.026 |
| 40947.0 | 1.026 |
| 40948.0 | 1.03 |
| 40949.0 | 1.013 |
| 40952.0 | 1.017 |
| 40953.0 | 1.016 |
| 40954.0 | 1.018 |
| 40955.0 | 1.016 |
| 40956.0 | 1.029 |
| 40959.0 | 1.041 |
| 40960.0 | 1.037 |
| 40961.0 | 1.028 |
| 40962.0 | 1.024 |
| 40963.0 | 1.03 |
| 40966.0 | 1.026 |
| 40967.0 | 1.029 |
| 40968.0 | 1.026 |
| 40969.0 | 1.04 |
| 40970.0 | 1.039 |
| 40973.0 | 1.033 |
| 40974.0 | 0.998 |
| 40975.0 | 1.005 |
| 40976.0 | 1.026 |
| 40977.0 | 1.027 |
| 40980.0 | 1.027 |
| 40981.0 | 1.043 |
| 40982.0 | 1.05 |
| 40983.0 | 1.058 |
| 40984.0 | 1.063 |
| 40987.0 | 1.063 |
| 40988.0 | 1.051 |
| 40989.0 | 1.047 |
| 40990.0 | 1.033 |
| 40991.0 | 1.031 |
| 40994.0 | 1.037 |
| 40995.0 | 1.031 |
| 40996.0 | 1.019 |
| 40997.0 | 1.002 |
| 40998.0 | 1.012 |
| 41001.0 | 1.021 |
| 41002.0 | 1.004 |
| 41003.0 | 0.979 |
| 41004.0 | 0.977 |
| 41009.0 | 0.947 |
| 41010.0 | 0.955 |
| 41011.0 | 0.96 |
| 41012.0 | 0.934 |
| 41015.0 | 0.938 |
| 41016.0 | 0.966 |
| 41017.0 | 0.949 |
| 41018.0 | 0.931 |
| 41019.0 | 0.942 |
| 41022.0 | 0.913 |
| 41023.0 | 0.93 |
| 41024.0 | 0.947 |
| 41025.0 | 0.947 |
| 41026.0 | 0.956 |
| 41029.0 | 0.94 |
| 41030.0 | 0.94 |
| 41031.0 | 0.933 |
| 41032.0 | 0.932 |
| 41033.0 | 0.915 |
| 41036.0 | 0.93 |
| 41037.0 | 0.909 |
| 41038.0 | 0.904 |
| 41039.0 | 0.914 |
| 41040.0 | 0.917 |
| 41043.0 | 0.894 |
| 41044.0 | 0.883 |
| 41045.0 | 0.882 |
| 41046.0 | 0.868 |
| 41047.0 | 0.867 |
| 41050.0 | 0.87 |
| 41051.0 | 0.89 |
| 41052.0 | 0.862 |
| 41053.0 | 0.873 |
| 41054.0 | 0.875 |
| 41057.0 | 0.869 |
| 41058.0 | 0.875 |
| 41059.0 | 0.854 |
| 41060.0 | 0.855 |
| 41061.0 | 0.831 |
| 41064.0 | 0.836 |
| 41065.0 | 0.84 |
| 41066.0 | 0.864 |
| 41067.0 | 0.867 |
| 41068.0 | 0.867 |
| 41071.0 | 0.864 |
| 41072.0 | 0.867 |
| 41073.0 | 0.867 |
| 41074.0 | 0.869 |
| 41075.0 | 0.884 |
| 41078.0 | 0.873 |
| 41079.0 | 0.892 |
| 41080.0 | 0.896 |
| 41081.0 | 0.893 |
| 41082.0 | 0.887 |
| 41085.0 | 0.861 |
| 41086.0 | 0.86 |
| 41087.0 | 0.877 |
| 41088.0 | 0.873 |
| 41089.0 | 0.922 |
| 41092.0 | 0.934 |
| 41093.0 | 0.946 |
| 41094.0 | 0.943 |
| 41095.0 | 0.931 |
| 41096.0 | 0.909 |
| 41099.0 | 0.906 |
| 41100.0 | 0.912 |
| 41101.0 | 0.914 |
| 41102.0 | 0.906 |
| 41103.0 | 0.919 |
| 41106.0 | 0.916 |
| 41107.0 | 0.916 |
| 41108.0 | 0.931 |
| 41109.0 | 0.938 |
| 41110.0 | 0.91 |
| 41113.0 | 0.883 |
| 41114.0 | 0.871 |
| 41115.0 | 0.874 |
| 41116.0 | 0.916 |
| 41117.0 | 0.938 |
| 41120.0 | 0.955 |
| 41121.0 | 0.948 |
| 41122.0 | 0.952 |
| 41123.0 | 0.921 |
| 41124.0 | 0.968 |
| 41127.0 | 0.98 |
| 41128.0 | 0.997 |
| 41129.0 | 0.993 |
| 41130.0 | 0.995 |
| 41131.0 | 0.99 |
| 41134.0 | 0.987 |
| 41135.0 | 0.993 |
| 41136.0 | 0.993 |
| 41137.0 | 1.003 |
| 41138.0 | 1.009 |
| 41141.0 | 1.007 |
| 41142.0 | 1.017 |
| 41143.0 | 1.002 |
| 41144.0 | 0.992 |
| 41145.0 | 0.994 |
| 41148.0 | 1.005 |
| 41149.0 | 0.997 |
| 41150.0 | 0.994 |
| 41151.0 | 0.982 |
| 41152.0 | 0.997 |
| 41155.0 | 1.006 |
| 41156.0 | 0.995 |
| 41157.0 | 0.997 |
| 41158.0 | 1.031 |
| 41159.0 | 1.036 |
| 41162.0 | 1.032 |
| 41163.0 | 1.044 |
| 41164.0 | 1.046 |
| 41165.0 | 1.038 |
| 41166.0 | 1.058 |
| 41169.0 | 1.054 |
| 41170.0 | 1.042 |
| 41171.0 | 1.047 |
| 41172.0 | 1.042 |
| 41173.0 | 1.051 |
| 41176.0 | 1.044 |
| 41177.0 | 1.048 |
| 41178.0 | 1.02 |
| 41179.0 | 1.023 |
| 41180.0 | 1.002 |
| 41183.0 | 1.02 |
| 41184.0 | 1.018 |
| 41185.0 | 1.018 |
| 41186.0 | 1.015 |
| 41187.0 | 1.033 |
| 41190.0 | 1.019 |
| 41191.0 | 1.01 |
| 41192.0 | 1.003 |
| 41193.0 | 1.016 |
| 41194.0 | 1.008 |
| 41197.0 | 1.015 |
| 41198.0 | 1.04 |
| 41199.0 | 1.048 |
| 41200.0 | 1.05 |
| 41201.0 | 1.037 |
| 41204.0 | 1.033 |
| 41205.0 | 1.012 |
| 41206.0 | 1.017 |
| 41207.0 | 1.014 |
| 41208.0 | 1.019 |
| 41211.0 | 1.012 |
| 41212.0 | 1.027 |
| 41213.0 | 1.022 |
| 41214.0 | 1.034 |
| 41215.0 | 1.039 |
| 41218.0 | 1.028 |
| 41219.0 | 1.035 |
| 41220.0 | 1.012 |
| 41221.0 | 1.012 |
| 41222.0 | 1.013 |
| 41225.0 | 1.01 |
| 41226.0 | 1.018 |
| 41227.0 | 1.01 |
| 41228.0 | 1.005 |
| 41229.0 | 0.991 |
| 41232.0 | 1.019 |
| 41233.0 | 1.025 |
| 41234.0 | 1.029 |
| 41235.0 | 1.035 |
| 41236.0 | 1.043 |
| 41239.0 | 1.038 |
| 41240.0 | 1.038 |
| 41241.0 | 1.039 |
| 41242.0 | 1.053 |
| 41243.0 | 1.05 |
| 41246.0 | 1.053 |
| 41247.0 | 1.056 |
| 41248.0 | 1.057 |
| 41249.0 | 1.061 |
| 41250.0 | 1.06 |
| 41253.0 | 1.058 |
| 41254.0 | 1.069 |
| 41255.0 | 1.072 |
| 41256.0 | 1.071 |
| 41257.0 | 1.072 |
| 41260.0 | 1.071 |
| 41261.0 | 1.077 |
| 41262.0 | 1.081 |
| 41263.0 | 1.082 |
| 41264.0 | 1.079 |
| 41267.0 | 1.078 |
| 41268.0 | 1.078 |
| 41269.0 | 1.078 |
| 41270.0 | 1.083 |
| 41271.0 | 1.07 |
| 41274.0 | 1.074 |
| 41276.0 | 1.102 |
| 41277.0 | 1.098 |
| 41278.0 | 1.101 |
| 41281.0 | 1.096 |
| 41282.0 | 1.095 |
| 41283.0 | 1.1 |
| 41284.0 | 1.101 |
| 41285.0 | 1.104 |
| 41288.0 | 1.103 |
| 41289.0 | 1.098 |
| 41290.0 | 1.099 |
| 41291.0 | 1.105 |
| 41292.0 | 1.101 |
| 41295.0 | 1.108 |
| 41296.0 | 1.104 |
| 41297.0 | 1.101 |
| 41298.0 | 1.106 |
| 41299.0 | 1.114 |
| 41302.0 | 1.114 |
| 41303.0 | 1.116 |
| 41304.0 | 1.11 |
| 41305.0 | 1.099 |
| 41306.0 | 1.101 |
| 41309.0 | 1.07 |
| 41310.0 | 1.079 |
| 41311.0 | 1.067 |
| 41312.0 | 1.059 |
| 41313.0 | 1.072 |
| 41316.0 | 1.069 |
| 41317.0 | 1.079 |
| 41318.0 | 1.082 |
| 41319.0 | 1.073 |
| 41320.0 | 1.066 |
| 41323.0 | 1.066 |
| 41324.0 | 1.084 |
| 41325.0 | 1.075 |
| 41326.0 | 1.052 |
| 41327.0 | 1.071 |
| 41330.0 | 1.08 |
| 41331.0 | 1.049 |
| 41332.0 | 1.065 |
| 41333.0 | 1.073 |
| 41334.0 | 1.066 |
| 41337.0 | 1.068 |
| 41338.0 | 1.091 |
| 41339.0 | 1.09 |
| 41340.0 | 1.094 |
| 41341.0 | 1.108 |
| 41344.0 | 1.105 |
| 41345.0 | 1.102 |
| 41346.0 | 1.099 |
| 41347.0 | 1.114 |
| 41348.0 | 1.107 |
| 41351.0 | 1.1 |
| 41352.0 | 1.087 |
| 41353.0 | 1.101 |
| 41354.0 | 1.092 |
| 41355.0 | 1.091 |
| 41358.0 | 1.079 |
| 41359.0 | 1.076 |
| 41360.0 | 1.065 |
| 41361.0 | 1.069 |
| 41366.0 | 1.09 |
| 41367.0 | 1.075 |
| 41368.0 | 1.068 |
| 41369.0 | 1.054 |
| 41372.0 | 1.056 |
| 41373.0 | 1.058 |
| 41374.0 | 1.083 |
| 41375.0 | 1.088 |
| 41376.0 | 1.073 |
| 41379.0 | 1.069 |
| 41380.0 | 1.064 |
| 41381.0 | 1.042 |
| 41382.0 | 1.043 |
| 41383.0 | 1.05 |
| 41386.0 | 1.054 |
| 41387.0 | 1.084 |
| 41388.0 | 1.098 |
| 41389.0 | 1.099 |
| 41390.0 | 1.092 |
| 41393.0 | 1.104 |
| 41394.0 | 1.102 |
| 41395.0 | 1.102 |
| 41396.0 | 1.105 |
| 41397.0 | 1.121 |
| 41400.0 | 1.116 |
| 41401.0 | 1.123 |
| 41402.0 | 1.129 |
| 41403.0 | 1.124 |
| 41404.0 | 1.129 |
| 41407.0 | 1.126 |
| 41408.0 | 1.133 |
| 41409.0 | 1.137 |
| 41410.0 | 1.136 |
| 41411.0 | 1.14 |
| 41414.0 | 1.143 |
| 41415.0 | 1.142 |
| 41416.0 | 1.146 |
| 41417.0 | 1.126 |
| 41418.0 | 1.121 |
| 41421.0 | 1.132 |
| 41422.0 | 1.147 |
| 41423.0 | 1.129 |
| 41424.0 | 1.134 |
| 41425.0 | 1.123 |
| 41428.0 | 1.115 |
| 41429.0 | 1.118 |
| 41430.0 | 1.101 |
| 41431.0 | 1.089 |
| 41432.0 | 1.107 |
| 41435.0 | 1.105 |
| 41436.0 | 1.091 |
| 41437.0 | 1.085 |
| 41438.0 | 1.083 |
| 41439.0 | 1.086 |
| 41442.0 | 1.099 |
| 41443.0 | 1.098 |
| 41444.0 | 1.092 |
| 41445.0 | 1.055 |
| 41446.0 | 1.04 |
| 41449.0 | 1.025 |
| 41450.0 | 1.038 |
| 41451.0 | 1.061 |
| 41452.0 | 1.068 |
| 41453.0 | 1.061 |
| 41456.0 | 1.069 |
| 41457.0 | 1.061 |
| 41458.0 | 1.049 |
| 41459.0 | 1.078 |
| 41460.0 | 1.058 |
| 41463.0 | 1.079 |
| 41464.0 | 1.084 |
| 41465.0 | 1.083 |
| 41466.0 | 1.091 |
| 41467.0 | 1.088 |
| 41470.0 | 1.093 |
| 41471.0 | 1.085 |
| 41472.0 | 1.091 |
| 41473.0 | 1.104 |
| 41474.0 | 1.104 |
| 41477.0 | 1.107 |
| 41478.0 | 1.106 |
| 41479.0 | 1.117 |
| 41480.0 | 1.113 |
| 41481.0 | 1.113 |
| 41484.0 | 1.113 |
| 41485.0 | 1.119 |
| 41486.0 | 1.123 |
| 41487.0 | 1.137 |
| 41488.0 | 1.138 |
| 41491.0 | 1.137 |
| 41492.0 | 1.131 |
| 41493.0 | 1.132 |
| 41494.0 | 1.14 |
| 41495.0 | 1.143 |
| 41498.0 | 1.144 |
| 41499.0 | 1.149 |
| 41500.0 | 1.152 |
| 41501.0 | 1.147 |
| 41502.0 | 1.153 |
| 41505.0 | 1.142 |
| 41506.0 | 1.13 |
| 41507.0 | 1.125 |
| 41508.0 | 1.138 |
| 41509.0 | 1.143 |
| 41512.0 | 1.142 |
| 41513.0 | 1.116 |
| 41514.0 | 1.113 |
| 41515.0 | 1.119 |
| 41516.0 | 1.106 |
| 41519.0 | 1.125 |
| 41520.0 | 1.117 |
| 41521.0 | 1.119 |
| 41522.0 | 1.125 |
| 41523.0 | 1.135 |
| 41526.0 | 1.133 |
| 41527.0 | 1.152 |
| 41528.0 | 1.156 |
| 41529.0 | 1.156 |
| 41530.0 | 1.158 |
| 41533.0 | 1.167 |
| 41534.0 | 1.166 |
| 41535.0 | 1.172 |
| 41536.0 | 1.182 |
| 41537.0 | 1.178 |
| 41540.0 | 1.171 |
| 41541.0 | 1.177 |
| 41542.0 | 1.179 |
| 41543.0 | 1.177 |
| 41544.0 | 1.176 |
| 41547.0 | 1.167 |
| 41548.0 | 1.18 |
| 41549.0 | 1.175 |
| 41550.0 | 1.17 |
| 41551.0 | 1.179 |
| 41554.0 | 1.177 |
| 41555.0 | 1.17 |
| 41556.0 | 1.171 |
| 41557.0 | 1.193 |
| 41558.0 | 1.194 |
| 41561.0 | 1.196 |
| 41562.0 | 1.205 |
| 41563.0 | 1.208 |
| 41564.0 | 1.207 |
| 41565.0 | 1.214 |
| 41568.0 | 1.213 |
| 41569.0 | 1.218 |
| 41570.0 | 1.209 |
| 41571.0 | 1.216 |
| 41572.0 | 1.214 |
| 41575.0 | 1.21 |
| 41576.0 | 1.22 |
| 41577.0 | 1.217 |
| 41578.0 | 1.225 |
| 41579.0 | 1.22 |
| 41582.0 | 1.223 |
| 41583.0 | 1.215 |
| 41584.0 | 1.222 |
| 41585.0 | 1.217 |
| 41586.0 | 1.215 |
| 41589.0 | 1.221 |
| 41590.0 | 1.215 |
| 41591.0 | 1.21 |
| 41592.0 | 1.221 |
| 41593.0 | 1.221 |
| 41596.0 | 1.23 |
| 41597.0 | 1.219 |
| 41598.0 | 1.219 |
| 41599.0 | 1.218 |
| 41600.0 | 1.222 |
| 41603.0 | 1.227 |
| 41604.0 | 1.224 |
| 41605.0 | 1.23 |
| 41606.0 | 1.233 |
| 41607.0 | 1.232 |
| 41610.0 | 1.228 |
| 41611.0 | 1.208 |
| 41612.0 | 1.2 |
| 41613.0 | 1.187 |
| 41614.0 | 1.196 |
| 41617.0 | 1.199 |
| 41618.0 | 1.19 |
| 41619.0 | 1.185 |
| 41620.0 | 1.179 |
| 41621.0 | 1.177 |
| 41624.0 | 1.196 |
| 41625.0 | 1.183 |
| 41626.0 | 1.195 |
| 41627.0 | 1.213 |
| 41628.0 | 1.219 |
| 41631.0 | 1.226 |
| 41632.0 | 1.227 |
| 41635.0 | 1.24 |
| 41638.0 | 1.236 |
| 41639.0 | 1.239 |
| 41641.0 | 1.223 |
| 41642.0 | 1.228 |
| 41645.0 | 1.226 |
| 41646.0 | 1.239 |
| 41647.0 | 1.239 |
| 41648.0 | 1.233 |
| 41649.0 | 1.237 |
| 41652.0 | 1.24 |
| 41653.0 | 1.242 |
| 41654.0 | 1.258 |
| 41655.0 | 1.252 |
| 41656.0 | 1.253 |
| 41659.0 | 1.253 |
| 41660.0 | 1.253 |
| 41661.0 | 1.252 |
| 41662.0 | 1.241 |
| 41663.0 | 1.212 |
| 41666.0 | 1.208 |
| 41667.0 | 1.216 |
| 41668.0 | 1.207 |
| 41669.0 | 1.212 |
| 41670.0 | 1.208 |
| 41673.0 | 1.191 |
| 41674.0 | 1.19 |
| 41675.0 | 1.19 |
| 41676.0 | 1.207 |
| 41677.0 | 1.216 |
| 41680.0 | 1.214 |
| 41681.0 | 1.228 |
| 41682.0 | 1.234 |
| 41683.0 | 1.235 |
| 41684.0 | 1.242 |
| 41687.0 | 1.242 |
| 41688.0 | 1.241 |
| 41689.0 | 1.243 |
| 41690.0 | 1.243 |
| 41691.0 | 1.246 |
| 41694.0 | 1.254 |
| 41695.0 | 1.254 |
| 41696.0 | 1.251 |
| 41697.0 | 1.247 |
| 41698.0 | 1.252 |
| 41701.0 | 1.221 |
| 41702.0 | 1.248 |
| 41703.0 | 1.247 |
| 41704.0 | 1.25 |
| 41705.0 | 1.234 |
| 41708.0 | 1.234 |
| 41709.0 | 1.233 |
| 41710.0 | 1.225 |
| 41711.0 | 1.21 |
| 41712.0 | 1.205 |
| 41715.0 | 1.219 |
| 41716.0 | 1.227 |
| 41717.0 | 1.228 |
| 41718.0 | 1.232 |
| 41719.0 | 1.235 |
| 41722.0 | 1.221 |
| 41723.0 | 1.235 |
| 41724.0 | 1.246 |
| 41725.0 | 1.247 |
| 41726.0 | 1.259 |
| 41729.0 | 1.256 |
| 41730.0 | 1.263 |
| 41731.0 | 1.264 |
| 41732.0 | 1.27 |
| 41733.0 | 1.277 |
| 41736.0 | 1.263 |
| 41737.0 | 1.261 |
| 41738.0 | 1.262 |
| 41739.0 | 1.253 |
| 41740.0 | 1.241 |
| 41743.0 | 1.246 |
| 41744.0 | 1.233 |
| 41745.0 | 1.248 |
| 41746.0 | 1.254 |
| 41751.0 | 1.268 |
| 41752.0 | 1.26 |
| 41753.0 | 1.264 |
| 41754.0 | 1.251 |
| 41757.0 | 1.257 |
| 41758.0 | 1.27 |
| 41759.0 | 1.267 |
| 41760.0 | 1.267 |
| 41761.0 | 1.261 |
| 41764.0 | 1.259 |
| 41765.0 | 1.252 |
| 41766.0 | 1.255 |
| 41767.0 | 1.269 |
| 41768.0 | 1.263 |
| 41771.0 | 1.27 |
| 41772.0 | 1.271 |
| 41773.0 | 1.271 |
| 41774.0 | 1.256 |
| 41775.0 | 1.259 |
| 41778.0 | 1.258 |
| 41779.0 | 1.256 |
| 41780.0 | 1.264 |
| 41781.0 | 1.264 |
| 41782.0 | 1.269 |
| 41785.0 | 1.28 |
| 41786.0 | 1.281 |
| 41787.0 | 1.282 |
| 41788.0 | 1.281 |
| 41789.0 | 1.281 |
| 41792.0 | 1.282 |
| 41793.0 | 1.28 |
| 41794.0 | 1.279 |
| 41795.0 | 1.288 |
| 41796.0 | 1.297 |
| 41799.0 | 1.3 |
| 41800.0 | 1.303 |
| 41801.0 | 1.295 |
| 41802.0 | 1.294 |
| 41803.0 | 1.293 |
| 41806.0 | 1.287 |
| 41807.0 | 1.291 |
| 41808.0 | 1.292 |
| 41809.0 | 1.303 |
| 41810.0 | 1.299 |
| 41813.0 | 1.293 |
| 41814.0 | 1.294 |
| 41815.0 | 1.284 |
| 41816.0 | 1.278 |
| 41817.0 | 1.276 |
| 41820.0 | 1.276 |
| 41821.0 | 1.286 |
| 41822.0 | 1.284 |
| 41823.0 | 1.295 |
| 41824.0 | 1.289 |
| 41827.0 | 1.277 |
| 41828.0 | 1.263 |
| 41829.0 | 1.269 |
| 41830.0 | 1.252 |
| 41831.0 | 1.254 |
| 41834.0 | 1.263 |
| 41835.0 | 1.253 |
| 41836.0 | 1.269 |
| 41837.0 | 1.254 |
| 41838.0 | 1.256 |
| 41841.0 | 1.248 |
| 41842.0 | 1.264 |
| 41843.0 | 1.265 |
| 41844.0 | 1.274 |
| 41845.0 | 1.26 |
| 41848.0 | 1.259 |
| 41849.0 | 1.265 |
| 41850.0 | 1.258 |
| 41851.0 | 1.241 |
| 41852.0 | 1.227 |
| 41855.0 | 1.226 |
| 41856.0 | 1.227 |
| 41857.0 | 1.22 |
| 41858.0 | 1.207 |
| 41859.0 | 1.205 |
| 41862.0 | 1.219 |
| 41863.0 | 1.211 |
| 41864.0 | 1.222 |
| 41865.0 | 1.222 |
| 41866.0 | 1.214 |
| 41869.0 | 1.227 |
| 41870.0 | 1.233 |
| 41871.0 | 1.231 |
| 41872.0 | 1.244 |
| 41873.0 | 1.235 |
| 41876.0 | 1.257 |
| 41877.0 | 1.267 |
| 41878.0 | 1.266 |
| 41879.0 | 1.256 |
| 41880.0 | 1.259 |
| 41883.0 | 1.26 |
| 41884.0 | 1.261 |
| 41885.0 | 1.273 |
| 41886.0 | 1.291 |
| 41887.0 | 1.291 |
| 41890.0 | 1.288 |
| 41891.0 | 1.282 |
| 41892.0 | 1.281 |
| 41893.0 | 1.279 |
| 41894.0 | 1.279 |
| 41897.0 | 1.277 |
| 41898.0 | 1.274 |
| 41899.0 | 1.279 |
| 41900.0 | 1.29 |
| 41901.0 | 1.29 |
| 41904.0 | 1.285 |
| 41905.0 | 1.269 |
| 41906.0 | 1.281 |
| 41907.0 | 1.268 |
| 41908.0 | 1.274 |
| 41911.0 | 1.264 |
| 41912.0 | 1.276 |
| 41913.0 | 1.266 |
| 41914.0 | 1.238 |
| 41915.0 | 1.247 |
| 41918.0 | 1.248 |
| 41919.0 | 1.23 |
| 41920.0 | 1.221 |
| 41921.0 | 1.217 |
| 41922.0 | 1.2 |
| 41925.0 | 1.203 |
| 41926.0 | 1.203 |
| 41927.0 | 1.167 |
| 41928.0 | 1.16 |
| 41929.0 | 1.19 |
| 41932.0 | 1.179 |
| 41933.0 | 1.2 |
| 41934.0 | 1.206 |
| 41935.0 | 1.218 |
| 41936.0 | 1.213 |
| 41939.0 | 1.203 |
| 41940.0 | 1.215 |
| 41941.0 | 1.211 |
| 41942.0 | 1.215 |
| 41943.0 | 1.24 |
| 41946.0 | 1.23 |
| 41947.0 | 1.214 |
| 41948.0 | 1.233 |
| 41949.0 | 1.237 |
| 41950.0 | 1.224 |
| 41953.0 | 1.234 |
| 41954.0 | 1.237 |
| 41955.0 | 1.219 |
| 41956.0 | 1.222 |
| 41957.0 | 1.223 |
| 41960.0 | 1.231 |
| 41961.0 | 1.242 |
| 41962.0 | 1.243 |
| 41963.0 | 1.237 |
| 41964.0 | 1.266 |
| 41967.0 | 1.271 |
| 41968.0 | 1.276 |
| 41969.0 | 1.276 |
| 41970.0 | 1.282 |
| 41971.0 | 1.283 |
| 41974.0 | 1.278 |
| 41975.0 | 1.28 |
| 41976.0 | 1.282 |
| 41977.0 | 1.265 |
| 41978.0 | 1.291 |
| 41981.0 | 1.282 |
| 41982.0 | 1.256 |
| 41983.0 | 1.252 |
| 41984.0 | 1.255 |
| 41985.0 | 1.225 |
| 41988.0 | 1.197 |
| 41989.0 | 1.22 |
| 41990.0 | 1.22 |
| 41991.0 | 1.253 |
| 41992.0 | 1.249 |
| 41995.0 | 1.253 |
| 41996.0 | 1.265 |
| 41997.0 | 1.263 |
| 42002.0 | 1.263 |
| 42003.0 | 1.247 |
| 42004.0 | 1.251 |
| 42006.0 | 1.248 |
| 42009.0 | 1.211 |
| 42010.0 | 1.206 |
| 42011.0 | 1.212 |
| 42012.0 | 1.247 |
| 42013.0 | 1.217 |
| 42016.0 | 1.231 |
| 42017.0 | 1.247 |
| 42018.0 | 1.233 |
| 42019.0 | 1.254 |
| 42020.0 | 1.268 |
| 42023.0 | 1.274 |
| 42024.0 | 1.282 |
| 42025.0 | 1.289 |
| 42026.0 | 1.305 |
| 42027.0 | 1.323 |
| 42030.0 | 1.332 |
| 42031.0 | 1.32 |
| 42032.0 | 1.316 |
| 42033.0 | 1.32 |
| 42034.0 | 1.314 |
| 42037.0 | 1.319 |
| 42038.0 | 1.332 |
| 42039.0 | 1.333 |
| 42040.0 | 1.331 |
| 42041.0 | 1.328 |
| 42044.0 | 1.313 |
| 42045.0 | 1.323 |
| 42046.0 | 1.321 |
| 42047.0 | 1.333 |
| 42048.0 | 1.342 |
| 42051.0 | 1.338 |
| 42052.0 | 1.339 |
| 42053.0 | 1.347 |
| 42054.0 | 1.354 |
| 42055.0 | 1.355 |
| 42058.0 | 1.363 |
| 42059.0 | 1.371 |
| 42060.0 | 1.369 |
| 42061.0 | 1.378 |
| 42062.0 | 1.385 |
| 42065.0 | 1.383 |
| 42066.0 | 1.371 |
| 42067.0 | 1.381 |
| 42068.0 | 1.39 |
| 42069.0 | 1.39 |
| 42072.0 | 1.388 |
| 42073.0 | 1.376 |
| 42074.0 | 1.399 |
| 42075.0 | 1.397 |
| 42076.0 | 1.401 |
| 42079.0 | 1.415 |
| 42080.0 | 1.405 |
| 42081.0 | 1.404 |
| 42082.0 | 1.405 |
| 42083.0 | 1.42 |
| 42086.0 | 1.413 |
| 42087.0 | 1.421 |
| 42088.0 | 1.408 |
| 42089.0 | 1.405 |
| 42090.0 | 1.407 |
| 42093.0 | 1.42 |
| 42094.0 | 1.412 |
| 42095.0 | 1.417 |
| 42096.0 | 1.417 |
| 42101.0 | 1.431 |
| 42102.0 | 1.424 |
| 42103.0 | 1.435 |
| 42104.0 | 1.444 |
| 42107.0 | 1.447 |
| 42108.0 | 1.435 |
| 42109.0 | 1.44 |
| 42110.0 | 1.427 |
| 42111.0 | 1.406 |
| 42114.0 | 1.418 |
| 42115.0 | 1.418 |
| 42116.0 | 1.419 |
| 42117.0 | 1.412 |
| 42118.0 | 1.417 |
| 42121.0 | 1.432 |
| 42122.0 | 1.417 |
| 42123.0 | 1.39 |
| 42124.0 | 1.39 |
| 42125.0 | 1.39 |
| 42128.0 | 1.394 |
| 42129.0 | 1.37 |
| 42130.0 | 1.374 |
| 42131.0 | 1.373 |
| 42132.0 | 1.399 |
| 42135.0 | 1.392 |
| 42136.0 | 1.378 |
| 42137.0 | 1.372 |
| 42138.0 | 1.386 |
| 42139.0 | 1.378 |
| 42142.0 | 1.382 |
| 42143.0 | 1.405 |
| 42144.0 | 1.408 |
| 42145.0 | 1.41 |
| 42146.0 | 1.407 |
| 42149.0 | 1.401 |
| 42150.0 | 1.391 |
| 42151.0 | 1.408 |
| 42152.0 | 1.399 |
| 42153.0 | 1.377 |
| 42156.0 | 1.378 |
| 42157.0 | 1.375 |
| 42158.0 | 1.381 |
| 42159.0 | 1.373 |
| 42160.0 | 1.36 |
| 42163.0 | 1.348 |
| 42164.0 | 1.345 |
| 42165.0 | 1.365 |
| 42166.0 | 1.372 |
| 42167.0 | 1.358 |
| 42170.0 | 1.339 |
| 42171.0 | 1.344 |
| 42172.0 | 1.337 |
| 42173.0 | 1.343 |
| 42174.0 | 1.345 |
| 42177.0 | 1.384 |
| 42178.0 | 1.393 |
| 42179.0 | 1.388 |
| 42180.0 | 1.388 |
| 42181.0 | 1.391 |
| 42184.0 | 1.348 |
| 42185.0 | 1.335 |
| 42186.0 | 1.356 |
| 42187.0 | 1.347 |
| 42188.0 | 1.34 |
| 42191.0 | 1.318 |
| 42192.0 | 1.297 |
| 42193.0 | 1.307 |
| 42194.0 | 1.334 |
| 42195.0 | 1.365 |
| 42198.0 | 1.383 |
| 42199.0 | 1.387 |
| 42200.0 | 1.392 |
| 42201.0 | 1.406 |
| 42202.0 | 1.405 |
| 42205.0 | 1.409 |
| 42206.0 | 1.399 |
| 42207.0 | 1.395 |
| 42208.0 | 1.395 |
| 42209.0 | 1.385 |
| 42212.0 | 1.361 |
| 42213.0 | 1.373 |
| 42214.0 | 1.379 |
| 42215.0 | 1.381 |
| 42216.0 | 1.386 |
| 42219.0 | 1.395 |
| 42220.0 | 1.391 |
| 42221.0 | 1.406 |
| 42222.0 | 1.404 |
| 42223.0 | 1.396 |
| 42226.0 | 1.406 |
| 42227.0 | 1.387 |
| 42228.0 | 1.353 |
| 42229.0 | 1.362 |
| 42230.0 | 1.355 |
| 42233.0 | 1.357 |
| 42234.0 | 1.356 |
| 42235.0 | 1.337 |
| 42236.0 | 1.314 |
| 42237.0 | 1.282 |
| 42240.0 | 1.227 |
| 42241.0 | 1.273 |
| 42242.0 | 1.258 |
| 42243.0 | 1.293 |
| 42244.0 | 1.294 |
| 42247.0 | 1.289 |
| 42248.0 | 1.264 |
| 42249.0 | 1.267 |
| 42250.0 | 1.289 |
| 42251.0 | 1.261 |
| 42254.0 | 1.267 |
| 42256.0 | 1.289 |
| 42257.0 | 1.274 |
| 42258.0 | 1.264 |
| 42261.0 | 1.26 |
| 42268.0 | 1.263 |
| 42269.0 | 1.228 |
| 42270.0 | 1.229 |
| 42271.0 | 1.209 |
| 42272.0 | 1.24 |
| 42275.0 | 1.216 |
| 42276.0 | 1.213 |
| 42277.0 | 1.236 |
| 42282.0 | 1.265 |
| 42285.0 | 1.275 |
| 42286.0 | 1.283 |